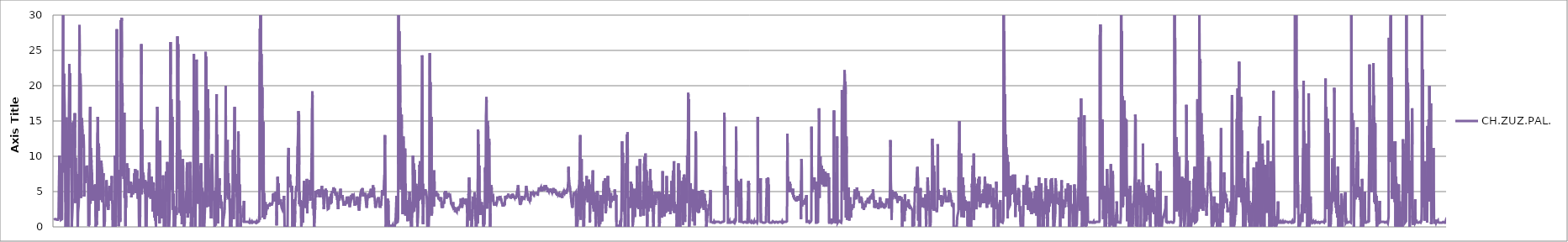
| Category | CH.ZUZ.PAL. |
|---|---|
| 2015-01-01_00:00:09 | 1 |
| 2015-01-01_00:00:10 | 1.1 |
| 2015-01-01_00:00:11 | 1.1 |
| 2015-01-01_00:00:12 | 1.1 |
| 2015-01-01_00:00:13 | 1.1 |
| 2015-01-01_00:00:14 | 1.1 |
| 2015-01-01_00:00:15 | 1.1 |
| 2015-01-01_00:00:16 | 1.1 |
| 2015-01-01_00:00:17 | 1.1 |
| 2015-01-01_00:00:18 | 1.1 |
| 2015-01-01_00:00:19 | 1.1 |
| 2015-01-01_00:00:20 | 1.1 |
| 2015-01-01_00:00:21 | 1.2 |
| 2015-01-01_00:00:22 | 1.1 |
| 2015-01-01_00:00:23 | 1.1 |
| 2015-01-01_00:00:24 | 1 |
| 2015-01-01_00:00:25 | 1.1 |
| 2015-01-01_00:00:26 | 1 |
| 2015-01-01_00:00:27 | 1 |
| 2015-01-01_00:00:28 | 1.1 |
| 2015-01-01_00:00:29 | 1 |
| 2015-01-01_00:00:30 | 1.1 |
| 2015-01-01_00:00:31 | 1.1 |
| 2015-01-01_00:00:32 | 1.3 |
| 2015-01-01_00:00:33 | 1.1 |
| 2015-01-01_00:00:34 | 1.1 |
| 2015-01-01_00:00:35 | 1.1 |
| 2015-01-01_00:00:36 | 10.1 |
| 2015-01-01_00:00:37 | 9.3 |
| 2015-01-01_00:00:38 | 8.3 |
| 2015-01-01_00:00:39 | 8.3 |
| 2015-01-01_00:00:40 | 9 |
| 2015-01-01_00:00:41 | 7.2 |
| 2015-01-01_00:00:42 | 7.3 |
| 2015-01-01_00:00:43 | 8 |
| 2015-01-01_00:00:44 | 1 |
| 2015-01-01_00:00:45 | 1.1 |
| 2015-01-01_00:00:46 | 1.1 |
| 2015-01-01_00:00:47 | 1.1 |
| 2015-01-01_00:00:48 | 1.1 |
| 2015-01-01_00:00:49 | 1.1 |
| 2015-01-01_00:00:50 | 1.1 |
| 2015-01-01_00:00:51 | 1.1 |
| 2015-01-01_00:00:52 | 1.1 |
| 2015-01-01_00:00:53 | 23.5 |
| 2015-01-01_00:00:54 | 31.3 |
| 2015-01-01_00:00:55 | 30.9 |
| 2015-01-01_00:00:56 | 7.7 |
| 2015-01-01_00:00:57 | 14.8 |
| 2015-01-01_00:00:58 | 19.1 |
| 2015-01-01_00:00:59 | 21.7 |
| 2015-01-01_00:01:00 | 19.3 |
| 2015-01-01_00:01:01 | 18.4 |
| 2015-01-01_00:01:02 | 17.3 |
| 2015-01-01_00:01:03 | 12.3 |
| 2015-01-01_00:01:04 | 12.5 |
| 2015-01-01_00:01:05 | 12.7 |
| 2015-01-01_00:01:06 | 3.5 |
| 2015-01-01_00:01:07 | 0 |
| 2015-01-01_00:01:08 | 2 |
| 2015-01-01_00:01:09 | 8.6 |
| 2015-01-01_00:01:10 | 14.3 |
| 2015-01-01_00:01:11 | 15.5 |
| 2015-01-01_00:01:12 | 13.2 |
| 2015-01-01_00:01:13 | 10.7 |
| 2015-01-01_00:01:14 | 11.5 |
| 2015-01-01_00:01:15 | 12.7 |
| 2015-01-01_00:01:16 | 11.1 |
| 2015-01-01_00:01:17 | 13.6 |
| 2015-01-01_00:01:18 | 7.5 |
| 2015-01-01_00:01:19 | 0 |
| 2015-01-01_00:01:20 | 0 |
| 2015-01-01_00:01:21 | 0 |
| 2015-01-01_00:01:22 | 8.1 |
| 2015-01-01_00:01:23 | 17 |
| 2015-01-01_00:01:24 | 19.4 |
| 2015-01-01_00:01:25 | 23.1 |
| 2015-01-01_00:01:26 | 21.1 |
| 2015-01-01_00:01:27 | 14.7 |
| 2015-01-01_00:01:28 | 21.8 |
| 2015-01-01_00:01:29 | 10.5 |
| 2015-01-01_00:01:30 | 8.4 |
| 2015-01-01_00:01:31 | 12.7 |
| 2015-01-01_00:01:32 | 11.6 |
| 2015-01-01_00:01:33 | 11.9 |
| 2015-01-01_00:01:34 | 13.2 |
| 2015-01-01_00:01:35 | 10.3 |
| 2015-01-01_00:01:36 | 2.9 |
| 2015-01-01_00:01:37 | 0 |
| 2015-01-01_00:01:38 | 0 |
| 2015-01-01_00:01:39 | 0 |
| 2015-01-01_00:01:40 | 0 |
| 2015-01-01_00:01:41 | 4 |
| 2015-01-01_00:01:42 | 14.1 |
| 2015-01-01_00:01:43 | 14.8 |
| 2015-01-01_00:01:44 | 13.4 |
| 2015-01-01_00:01:45 | 14.7 |
| 2015-01-01_00:01:46 | 14.7 |
| 2015-01-01_00:01:47 | 14.2 |
| 2015-01-01_00:01:48 | 15 |
| 2015-01-01_00:01:49 | 14.5 |
| 2015-01-01_00:01:50 | 14.8 |
| 2015-01-01_00:01:51 | 14.1 |
| 2015-01-01_00:01:52 | 16.1 |
| 2015-01-01_00:01:53 | 11.2 |
| 2015-01-01_00:01:54 | 3.4 |
| 2015-01-01_00:01:55 | 9 |
| 2015-01-01_00:01:56 | 9.8 |
| 2015-01-01_00:01:57 | 7.3 |
| 2015-01-01_00:01:58 | 6.7 |
| 2015-01-01_00:01:59 | 6.7 |
| 2015-01-01_00:02:00 | 7 |
| 2015-01-01_00:02:01 | 6.4 |
| 2015-01-01_00:02:02 | 6.2 |
| 2015-01-01_00:02:03 | 7.2 |
| 2015-01-01_00:02:04 | 7.5 |
| 2015-01-01_00:02:05 | 4.7 |
| 2015-01-01_00:02:06 | 0 |
| 2015-01-01_00:02:07 | 0.2 |
| 2015-01-01_00:02:08 | 2 |
| 2015-01-01_00:02:09 | 2.4 |
| 2015-01-01_00:02:10 | 2.5 |
| 2015-01-01_00:02:11 | 3 |
| 2015-01-01_00:02:12 | 4 |
| 2015-01-01_00:02:13 | 11.1 |
| 2015-01-01_00:02:14 | 20 |
| 2015-01-01_00:02:15 | 28.6 |
| 2015-01-01_00:02:16 | 24.2 |
| 2015-01-01_00:02:17 | 6.9 |
| 2015-01-01_00:02:18 | 18.6 |
| 2015-01-01_00:02:19 | 21.7 |
| 2015-01-01_00:02:20 | 21.5 |
| 2015-01-01_00:02:21 | 21.4 |
| 2015-01-01_00:02:22 | 19.6 |
| 2015-01-01_00:02:23 | 4.1 |
| 2015-01-01_00:02:24 | 10.7 |
| 2015-01-01_00:02:25 | 14 |
| 2015-01-01_00:02:26 | 14.3 |
| 2015-01-01_00:02:27 | 15.4 |
| 2015-01-01_00:02:28 | 14.8 |
| 2015-01-01_00:02:29 | 14.7 |
| 2015-01-01_00:02:30 | 13.8 |
| 2015-01-01_00:02:31 | 12.6 |
| 2015-01-01_00:02:32 | 11.2 |
| 2015-01-01_00:02:33 | 12.3 |
| 2015-01-01_00:02:34 | 13.1 |
| 2015-01-01_00:02:35 | 12.9 |
| 2015-01-01_00:02:36 | 12.3 |
| 2015-01-01_00:02:37 | 11.3 |
| 2015-01-01_00:02:38 | 4.3 |
| 2015-01-01_00:02:39 | 5.2 |
| 2015-01-01_00:02:40 | 8.5 |
| 2015-01-01_00:02:41 | 7.9 |
| 2015-01-01_00:02:42 | 7.8 |
| 2015-01-01_00:02:43 | 7.6 |
| 2015-01-01_00:02:44 | 6.2 |
| 2015-01-01_00:02:45 | 6.2 |
| 2015-01-01_00:02:46 | 6.8 |
| 2015-01-01_00:02:47 | 7.7 |
| 2015-01-01_00:02:48 | 7.1 |
| 2015-01-01_00:02:49 | 7.5 |
| 2015-01-01_00:02:50 | 8 |
| 2015-01-01_00:02:51 | 8.7 |
| 2015-01-01_00:02:52 | 8.1 |
| 2015-01-01_00:02:53 | 8.2 |
| 2015-01-01_00:02:54 | 8 |
| 2015-01-01_00:02:55 | 8.2 |
| 2015-01-01_00:02:56 | 8 |
| 2015-01-01_00:02:57 | 6.9 |
| 2015-01-01_00:02:58 | 4.6 |
| 2015-01-01_00:02:59 | 0.1 |
| 2015-01-01_00:03:00 | 0 |
| 2015-01-01_00:03:01 | 0 |
| 2015-01-01_00:03:02 | 0 |
| 2015-01-01_00:03:03 | 0 |
| 2015-01-01_00:03:04 | 0.4 |
| 2015-01-01_00:03:05 | 5.4 |
| 2015-01-01_00:03:06 | 11.9 |
| 2015-01-01_00:03:07 | 15.8 |
| 2015-01-01_00:03:08 | 17 |
| 2015-01-01_00:03:09 | 3.3 |
| 2015-01-01_00:03:10 | 6.7 |
| 2015-01-01_00:03:11 | 11.2 |
| 2015-01-01_00:03:12 | 9.6 |
| 2015-01-01_00:03:13 | 9.8 |
| 2015-01-01_00:03:14 | 9.1 |
| 2015-01-01_00:03:15 | 8.4 |
| 2015-01-01_00:03:16 | 8.3 |
| 2015-01-01_00:03:17 | 7.5 |
| 2015-01-01_00:03:18 | 6.1 |
| 2015-01-01_00:03:19 | 4.8 |
| 2015-01-01_00:03:20 | 4.9 |
| 2015-01-01_00:03:21 | 4.2 |
| 2015-01-01_00:03:22 | 3.7 |
| 2015-01-01_00:03:23 | 3.8 |
| 2015-01-01_00:03:24 | 5.4 |
| 2015-01-01_00:03:25 | 5.6 |
| 2015-01-01_00:03:26 | 5.2 |
| 2015-01-01_00:03:27 | 4.2 |
| 2015-01-01_00:03:28 | 3.8 |
| 2015-01-01_00:03:29 | 4.4 |
| 2015-01-01_00:03:30 | 5.9 |
| 2015-01-01_00:03:31 | 5.3 |
| 2015-01-01_00:03:32 | 4.5 |
| 2015-01-01_00:03:33 | 6 |
| 2015-01-01_00:03:34 | 1.5 |
| 2015-01-01_00:03:35 | 0 |
| 2015-01-01_00:03:36 | 0 |
| 2015-01-01_00:03:37 | 0 |
| 2015-01-01_00:03:38 | 0 |
| 2015-01-01_00:03:39 | 0.8 |
| 2015-01-01_00:03:40 | 0.3 |
| 2015-01-01_00:03:41 | 2.7 |
| 2015-01-01_00:03:42 | 10 |
| 2015-01-01_00:03:43 | 13.2 |
| 2015-01-01_00:03:44 | 13.5 |
| 2015-01-01_00:03:45 | 15.6 |
| 2015-01-01_00:03:46 | 14.8 |
| 2015-01-01_00:03:47 | 14.7 |
| 2015-01-01_00:03:48 | 2.3 |
| 2015-01-01_00:03:49 | 6.4 |
| 2015-01-01_00:03:50 | 11.8 |
| 2015-01-01_00:03:51 | 11.2 |
| 2015-01-01_00:03:52 | 9.4 |
| 2015-01-01_00:03:53 | 8.9 |
| 2015-01-01_00:03:54 | 7.2 |
| 2015-01-01_00:03:55 | 5.2 |
| 2015-01-01_00:03:56 | 4 |
| 2015-01-01_00:03:57 | 3.8 |
| 2015-01-01_00:03:58 | 3.8 |
| 2015-01-01_00:03:59 | 4.7 |
| 2015-01-01_00:04:00 | 6.3 |
| 2015-01-01_00:04:01 | 8.2 |
| 2015-01-01_00:04:02 | 9.4 |
| 2015-01-01_00:04:03 | 9.3 |
| 2015-01-01_00:04:04 | 8.7 |
| 2015-01-01_00:04:05 | 8.6 |
| 2015-01-01_00:04:06 | 8.3 |
| 2015-01-01_00:04:07 | 7.8 |
| 2015-01-01_00:04:08 | 3.7 |
| 2015-01-01_00:04:09 | 3.5 |
| 2015-01-01_00:04:10 | 7.2 |
| 2015-01-01_00:04:11 | 7 |
| 2015-01-01_00:04:12 | 7 |
| 2015-01-01_00:04:13 | 7.6 |
| 2015-01-01_00:04:14 | 4.3 |
| 2015-01-01_00:04:15 | 0.7 |
| 2015-01-01_00:04:16 | 0 |
| 2015-01-01_00:04:17 | 0 |
| 2015-01-01_00:04:18 | 0 |
| 2015-01-01_00:04:19 | 0 |
| 2015-01-01_00:04:20 | 0.8 |
| 2015-01-01_00:04:21 | 3 |
| 2015-01-01_00:04:22 | 3.2 |
| 2015-01-01_00:04:23 | 2.9 |
| 2015-01-01_00:04:24 | 2.9 |
| 2015-01-01_00:04:25 | 3.1 |
| 2015-01-01_00:04:26 | 3.5 |
| 2015-01-01_00:04:27 | 5.2 |
| 2015-01-01_00:04:28 | 6.6 |
| 2015-01-01_00:04:29 | 6.4 |
| 2015-01-01_00:04:30 | 5.6 |
| 2015-01-01_00:04:31 | 5 |
| 2015-01-01_00:04:32 | 4.9 |
| 2015-01-01_00:04:33 | 4.5 |
| 2015-01-01_00:04:34 | 3.5 |
| 2015-01-01_00:04:35 | 3.2 |
| 2015-01-01_00:04:36 | 2.6 |
| 2015-01-01_00:04:37 | 2.4 |
| 2015-01-01_00:04:38 | 2.4 |
| 2015-01-01_00:04:39 | 3.2 |
| 2015-01-01_00:04:40 | 4.5 |
| 2015-01-01_00:04:41 | 4.5 |
| 2015-01-01_00:04:42 | 4.5 |
| 2015-01-01_00:04:43 | 5.8 |
| 2015-01-01_00:04:44 | 5.9 |
| 2015-01-01_00:04:45 | 4.6 |
| 2015-01-01_00:04:46 | 4 |
| 2015-01-01_00:04:47 | 4.4 |
| 2015-01-01_00:04:48 | 4 |
| 2015-01-01_00:04:49 | 3.7 |
| 2015-01-01_00:04:50 | 4.2 |
| 2015-01-01_00:04:51 | 5.3 |
| 2015-01-01_00:04:52 | 5.9 |
| 2015-01-01_00:04:53 | 6.2 |
| 2015-01-01_00:04:54 | 7.2 |
| 2015-01-01_00:04:55 | 6.8 |
| 2015-01-01_00:04:56 | 3.8 |
| 2015-01-01_00:04:57 | 3.5 |
| 2015-01-01_00:04:58 | 1.1 |
| 2015-01-01_00:04:59 | 0 |
| 2015-01-01_00:05:00 | 0 |
| 2015-01-01_00:05:01 | 0 |
| 2015-01-01_00:05:02 | 0 |
| 2015-01-01_00:05:03 | 0 |
| 2015-01-01_00:05:04 | 0 |
| 2015-01-01_00:05:05 | 0 |
| 2015-01-01_00:05:06 | 0 |
| 2015-01-01_00:05:07 | 0.7 |
| 2015-01-01_00:05:08 | 0.5 |
| 2015-01-01_00:05:09 | 2 |
| 2015-01-01_00:05:10 | 10.1 |
| 2015-01-01_00:05:11 | 9.6 |
| 2015-01-01_00:05:12 | 3.3 |
| 2015-01-01_00:05:13 | 0 |
| 2015-01-01_00:05:14 | 0 |
| 2015-01-01_00:05:15 | 1.6 |
| 2015-01-01_00:05:16 | 1.7 |
| 2015-01-01_00:05:17 | 6.5 |
| 2015-01-01_00:05:18 | 16.9 |
| 2015-01-01_00:05:19 | 28 |
| 2015-01-01_00:05:20 | 9.2 |
| 2015-01-01_00:05:21 | 12.7 |
| 2015-01-01_00:05:22 | 20.7 |
| 2015-01-01_00:05:23 | 10 |
| 2015-01-01_00:05:24 | 6 |
| 2015-01-01_00:05:25 | 5.6 |
| 2015-01-01_00:05:26 | 5.6 |
| 2015-01-01_00:05:27 | 2.6 |
| 2015-01-01_00:05:28 | 0.1 |
| 2015-01-01_00:05:29 | 0.4 |
| 2015-01-01_00:05:30 | 2 |
| 2015-01-01_00:05:31 | 2.8 |
| 2015-01-01_00:05:32 | 8.1 |
| 2015-01-01_00:05:33 | 5.4 |
| 2015-01-01_00:05:34 | 3.2 |
| 2015-01-01_00:05:35 | 0.7 |
| 2015-01-01_00:05:36 | 0.7 |
| 2015-01-01_00:05:37 | 1.2 |
| 2015-01-01_00:05:38 | 23.7 |
| 2015-01-01_00:05:39 | 29.3 |
| 2015-01-01_00:05:40 | 10.9 |
| 2015-01-01_00:05:41 | 29.1 |
| 2015-01-01_00:05:42 | 28.2 |
| 2015-01-01_00:05:43 | 29.6 |
| 2015-01-01_00:05:44 | 24 |
| 2015-01-01_00:05:45 | 7.2 |
| 2015-01-01_00:05:46 | 20.3 |
| 2015-01-01_00:05:47 | 17.1 |
| 2015-01-01_00:05:48 | 10.3 |
| 2015-01-01_00:05:49 | 8.7 |
| 2015-01-01_00:05:50 | 12.4 |
| 2015-01-01_00:05:51 | 12.5 |
| 2015-01-01_00:05:52 | 8.5 |
| 2015-01-01_00:05:53 | 6.8 |
| 2015-01-01_00:05:54 | 7.3 |
| 2015-01-01_00:05:55 | 10.8 |
| 2015-01-01_00:05:56 | 16.2 |
| 2015-01-01_00:05:57 | 7.2 |
| 2015-01-01_00:05:58 | 4.1 |
| 2015-01-01_00:05:59 | 7.1 |
| 2015-01-01_00:06:00 | 6.3 |
| 2015-01-01_00:06:01 | 1 |
| 2015-01-01_00:06:02 | 0.1 |
| 2015-01-01_00:06:03 | 4.1 |
| 2015-01-01_00:06:04 | 2.7 |
| 2015-01-01_00:06:05 | 4.4 |
| 2015-01-01_00:06:06 | 5.2 |
| 2015-01-01_00:06:07 | 6.5 |
| 2015-01-01_00:06:08 | 6.7 |
| 2015-01-01_00:06:09 | 9 |
| 2015-01-01_00:06:10 | 9.1 |
| 2015-01-01_00:06:11 | 7.5 |
| 2015-01-01_00:06:12 | 7.9 |
| 2015-01-01_00:06:13 | 7.1 |
| 2015-01-01_00:06:14 | 8.3 |
| 2015-01-01_00:06:15 | 7.9 |
| 2015-01-01_00:06:16 | 8.3 |
| 2015-01-01_00:06:17 | 6.3 |
| 2015-01-01_00:06:18 | 4.8 |
| 2015-01-01_00:06:19 | 5.4 |
| 2015-01-01_00:06:20 | 5.2 |
| 2015-01-01_00:06:21 | 5.7 |
| 2015-01-01_00:06:22 | 6.1 |
| 2015-01-01_00:06:23 | 5.9 |
| 2015-01-01_00:06:24 | 6 |
| 2015-01-01_00:06:25 | 5.9 |
| 2015-01-01_00:06:26 | 4.8 |
| 2015-01-01_00:06:27 | 5.1 |
| 2015-01-01_00:06:28 | 6.4 |
| 2015-01-01_00:06:29 | 6 |
| 2015-01-01_00:06:30 | 5.8 |
| 2015-01-01_00:06:31 | 4.2 |
| 2015-01-01_00:06:32 | 4.8 |
| 2015-01-01_00:06:33 | 5.9 |
| 2015-01-01_00:06:34 | 5.5 |
| 2015-01-01_00:06:35 | 5.6 |
| 2015-01-01_00:06:36 | 5.3 |
| 2015-01-01_00:06:37 | 5.3 |
| 2015-01-01_00:06:38 | 4.6 |
| 2015-01-01_00:06:39 | 4.5 |
| 2015-01-01_00:06:40 | 5.3 |
| 2015-01-01_00:06:41 | 5.8 |
| 2015-01-01_00:06:42 | 5.7 |
| 2015-01-01_00:06:43 | 5.7 |
| 2015-01-01_00:06:44 | 6.5 |
| 2015-01-01_00:06:45 | 6 |
| 2015-01-01_00:06:46 | 7.6 |
| 2015-01-01_00:06:47 | 7.2 |
| 2015-01-01_00:06:48 | 6.2 |
| 2015-01-01_00:06:49 | 7.6 |
| 2015-01-01_00:06:50 | 8.2 |
| 2015-01-01_00:06:51 | 7.1 |
| 2015-01-01_00:06:52 | 5.4 |
| 2015-01-01_00:06:53 | 4.8 |
| 2015-01-01_00:06:54 | 5 |
| 2015-01-01_00:06:55 | 5.8 |
| 2015-01-01_00:06:56 | 7.7 |
| 2015-01-01_00:06:57 | 6.5 |
| 2015-01-01_00:06:58 | 6.9 |
| 2015-01-01_00:06:59 | 8 |
| 2015-01-01_00:07:00 | 7.2 |
| 2015-01-01_00:07:01 | 5.8 |
| 2015-01-01_00:07:02 | 5 |
| 2015-01-01_00:07:03 | 4 |
| 2015-01-01_00:07:04 | 6.5 |
| 2015-01-01_00:07:05 | 6.8 |
| 2015-01-01_00:07:06 | 5.7 |
| 2015-01-01_00:07:07 | 5.2 |
| 2015-01-01_00:07:08 | 1.3 |
| 2015-01-01_00:07:09 | 0 |
| 2015-01-01_00:07:10 | 0.9 |
| 2015-01-01_00:07:11 | 0.6 |
| 2015-01-01_00:07:12 | 0 |
| 2015-01-01_00:07:13 | 0 |
| 2015-01-01_00:07:14 | 1.6 |
| 2015-01-01_00:07:15 | 6.3 |
| 2015-01-01_00:07:16 | 5.9 |
| 2015-01-01_00:07:17 | 5.2 |
| 2015-01-01_00:07:18 | 15.2 |
| 2015-01-01_00:07:19 | 22 |
| 2015-01-01_00:07:20 | 25.9 |
| 2015-01-01_00:07:21 | 21.6 |
| 2015-01-01_00:07:22 | 4.6 |
| 2015-01-01_00:07:23 | 13.1 |
| 2015-01-01_00:07:24 | 13.8 |
| 2015-01-01_00:07:25 | 9.4 |
| 2015-01-01_00:07:26 | 8.5 |
| 2015-01-01_00:07:27 | 7.3 |
| 2015-01-01_00:07:28 | 7.7 |
| 2015-01-01_00:07:29 | 6.9 |
| 2015-01-01_00:07:30 | 7.6 |
| 2015-01-01_00:07:31 | 7.7 |
| 2015-01-01_00:07:32 | 6.3 |
| 2015-01-01_00:07:33 | 5.6 |
| 2015-01-01_00:07:34 | 6 |
| 2015-01-01_00:07:35 | 5.5 |
| 2015-01-01_00:07:36 | 5.7 |
| 2015-01-01_00:07:37 | 5.2 |
| 2015-01-01_00:07:38 | 4.7 |
| 2015-01-01_00:07:39 | 6.6 |
| 2015-01-01_00:07:40 | 5 |
| 2015-01-01_00:07:41 | 0.1 |
| 2015-01-01_00:07:42 | 0 |
| 2015-01-01_00:07:43 | 0 |
| 2015-01-01_00:07:44 | 0 |
| 2015-01-01_00:07:45 | 0 |
| 2015-01-01_00:07:46 | 0 |
| 2015-01-01_00:07:47 | 3.7 |
| 2015-01-01_00:07:48 | 5.7 |
| 2015-01-01_00:07:49 | 4.2 |
| 2015-01-01_00:07:50 | 5 |
| 2015-01-01_00:07:51 | 6.4 |
| 2015-01-01_00:07:52 | 5 |
| 2015-01-01_00:07:53 | 4.3 |
| 2015-01-01_00:07:54 | 5.8 |
| 2015-01-01_00:07:55 | 6.3 |
| 2015-01-01_00:07:56 | 5.4 |
| 2015-01-01_00:07:57 | 7.7 |
| 2015-01-01_00:07:58 | 9.1 |
| 2015-01-01_00:07:59 | 9.1 |
| 2015-01-01_00:08:00 | 8.8 |
| 2015-01-01_00:08:01 | 7.5 |
| 2015-01-01_00:08:02 | 6.6 |
| 2015-01-01_00:08:03 | 4.9 |
| 2015-01-01_00:08:04 | 4.3 |
| 2015-01-01_00:08:05 | 4.2 |
| 2015-01-01_00:08:06 | 4 |
| 2015-01-01_00:08:07 | 5.6 |
| 2015-01-01_00:08:08 | 6 |
| 2015-01-01_00:08:09 | 5.4 |
| 2015-01-01_00:08:10 | 6.7 |
| 2015-01-01_00:08:11 | 7.1 |
| 2015-01-01_00:08:12 | 6.4 |
| 2015-01-01_00:08:13 | 6.5 |
| 2015-01-01_00:08:14 | 5.8 |
| 2015-01-01_00:08:15 | 4.9 |
| 2015-01-01_00:08:16 | 2.2 |
| 2015-01-01_00:08:17 | 4.7 |
| 2015-01-01_00:08:18 | 5.1 |
| 2015-01-01_00:08:19 | 4.2 |
| 2015-01-01_00:08:20 | 6.3 |
| 2015-01-01_00:08:21 | 5.8 |
| 2015-01-01_00:08:22 | 4.5 |
| 2015-01-01_00:08:23 | 3.6 |
| 2015-01-01_00:08:24 | 2.1 |
| 2015-01-01_00:08:25 | 1.3 |
| 2015-01-01_00:08:26 | 5.1 |
| 2015-01-01_00:08:27 | 4.6 |
| 2015-01-01_00:08:28 | 0.9 |
| 2015-01-01_00:08:29 | 1.1 |
| 2015-01-01_00:08:30 | 3.5 |
| 2015-01-01_00:08:31 | 0.8 |
| 2015-01-01_00:08:32 | 0 |
| 2015-01-01_00:08:33 | 2.7 |
| 2015-01-01_00:08:34 | 3.7 |
| 2015-01-01_00:08:35 | 7.2 |
| 2015-01-01_00:08:36 | 13 |
| 2015-01-01_00:08:37 | 15 |
| 2015-01-01_00:08:38 | 17 |
| 2015-01-01_00:08:39 | 16.7 |
| 2015-01-01_00:08:40 | 16.4 |
| 2015-01-01_00:08:41 | 11.3 |
| 2015-01-01_00:08:42 | 7 |
| 2015-01-01_00:08:43 | 5.9 |
| 2015-01-01_00:08:44 | 9.2 |
| 2015-01-01_00:08:45 | 1.6 |
| 2015-01-01_00:08:46 | 3.7 |
| 2015-01-01_00:08:47 | 4.4 |
| 2015-01-01_00:08:48 | 5 |
| 2015-01-01_00:08:49 | 0.7 |
| 2015-01-01_00:08:50 | 0.5 |
| 2015-01-01_00:08:51 | 5.2 |
| 2015-01-01_00:08:52 | 12.2 |
| 2015-01-01_00:08:53 | 11.9 |
| 2015-01-01_00:08:54 | 6.9 |
| 2015-01-01_00:08:55 | 5.8 |
| 2015-01-01_00:08:56 | 4.3 |
| 2015-01-01_00:08:57 | 4 |
| 2015-01-01_00:08:58 | 5.3 |
| 2015-01-01_00:08:59 | 3.7 |
| 2015-01-01_00:09:00 | 1.6 |
| 2015-01-01_00:09:01 | 1.2 |
| 2015-01-01_00:09:02 | 3.1 |
| 2015-01-01_00:09:03 | 3.5 |
| 2015-01-01_00:09:04 | 3.3 |
| 2015-01-01_00:09:05 | 1.5 |
| 2015-01-01_00:09:06 | 3.5 |
| 2015-01-01_00:09:07 | 7.3 |
| 2015-01-01_00:09:08 | 6.5 |
| 2015-01-01_00:09:09 | 5.7 |
| 2015-01-01_00:09:10 | 4 |
| 2015-01-01_00:09:11 | 2.5 |
| 2015-01-01_00:09:12 | 0 |
| 2015-01-01_00:09:13 | 1.9 |
| 2015-01-01_00:09:14 | 2.8 |
| 2015-01-01_00:09:15 | 0 |
| 2015-01-01_00:09:16 | 1.2 |
| 2015-01-01_00:09:17 | 3.7 |
| 2015-01-01_00:09:18 | 0.3 |
| 2015-01-01_00:09:19 | 0 |
| 2015-01-01_00:09:20 | 1.6 |
| 2015-01-01_00:09:21 | 7.4 |
| 2015-01-01_00:09:22 | 7.8 |
| 2015-01-01_00:09:23 | 4.8 |
| 2015-01-01_00:09:24 | 5.9 |
| 2015-01-01_00:09:25 | 3.6 |
| 2015-01-01_00:09:26 | 6.7 |
| 2015-01-01_00:09:27 | 8.3 |
| 2015-01-01_00:09:28 | 9.2 |
| 2015-01-01_00:09:29 | 9.2 |
| 2015-01-01_00:09:30 | 7.9 |
| 2015-01-01_00:09:31 | 1.7 |
| 2015-01-01_00:09:32 | 0 |
| 2015-01-01_00:09:33 | 0 |
| 2015-01-01_00:09:34 | 0 |
| 2015-01-01_00:09:35 | 0 |
| 2015-01-01_00:09:36 | 0 |
| 2015-01-01_00:09:37 | 0 |
| 2015-01-01_00:09:38 | 0.1 |
| 2015-01-01_00:09:39 | 1.5 |
| 2015-01-01_00:09:40 | 2 |
| 2015-01-01_00:09:41 | 4.5 |
| 2015-01-01_00:09:42 | 14.7 |
| 2015-01-01_00:09:43 | 21.7 |
| 2015-01-01_00:09:44 | 26.2 |
| 2015-01-01_00:09:45 | 21.6 |
| 2015-01-01_00:09:46 | 5.2 |
| 2015-01-01_00:09:47 | 7.1 |
| 2015-01-01_00:09:48 | 18.1 |
| 2015-01-01_00:09:49 | 13.4 |
| 2015-01-01_00:09:50 | 8.2 |
| 2015-01-01_00:09:51 | 6.5 |
| 2015-01-01_00:09:52 | 9.9 |
| 2015-01-01_00:09:53 | 15.6 |
| 2015-01-01_00:09:54 | 10 |
| 2015-01-01_00:09:55 | 6.5 |
| 2015-01-01_00:09:56 | 2.4 |
| 2015-01-01_00:09:57 | 3.9 |
| 2015-01-01_00:09:58 | 4.7 |
| 2015-01-01_00:09:59 | 3.3 |
| 2015-01-01_00:10:00 | 0 |
| 2015-01-01_00:10:01 | 0 |
| 2015-01-01_00:10:02 | 0 |
| 2015-01-01_00:10:03 | 0.8 |
| 2015-01-01_00:10:04 | 1.4 |
| 2015-01-01_00:10:05 | 0 |
| 2015-01-01_00:10:06 | 0 |
| 2015-01-01_00:10:07 | 0 |
| 2015-01-01_00:10:08 | 1.2 |
| 2015-01-01_00:10:09 | 1.8 |
| 2015-01-01_00:10:10 | 2.3 |
| 2015-01-01_00:10:11 | 2.7 |
| 2015-01-01_00:10:12 | 2.9 |
| 2015-01-01_00:10:13 | 1.7 |
| 2015-01-01_00:10:14 | 2.7 |
| 2015-01-01_00:10:15 | 10.5 |
| 2015-01-01_00:10:16 | 10.1 |
| 2015-01-01_00:10:17 | 14.8 |
| 2015-01-01_00:10:18 | 27 |
| 2015-01-01_00:10:19 | 14 |
| 2015-01-01_00:10:20 | 11.2 |
| 2015-01-01_00:10:21 | 25.9 |
| 2015-01-01_00:10:22 | 24 |
| 2015-01-01_00:10:23 | 5.4 |
| 2015-01-01_00:10:24 | 10.1 |
| 2015-01-01_00:10:25 | 17.9 |
| 2015-01-01_00:10:26 | 10.6 |
| 2015-01-01_00:10:27 | 10.1 |
| 2015-01-01_00:10:28 | 10.5 |
| 2015-01-01_00:10:29 | 2 |
| 2015-01-01_00:10:30 | 8.8 |
| 2015-01-01_00:10:31 | 10.9 |
| 2015-01-01_00:10:32 | 6.4 |
| 2015-01-01_00:10:33 | 6.2 |
| 2015-01-01_00:10:34 | 5.8 |
| 2015-01-01_00:10:35 | 4.4 |
| 2015-01-01_00:10:36 | 1.6 |
| 2015-01-01_00:10:37 | 2.7 |
| 2015-01-01_00:10:38 | 5.2 |
| 2015-01-01_00:10:39 | 3.1 |
| 2015-01-01_00:10:40 | 0.4 |
| 2015-01-01_00:10:41 | 2.4 |
| 2015-01-01_00:10:42 | 2.6 |
| 2015-01-01_00:10:43 | 3.7 |
| 2015-01-01_00:10:44 | 6.4 |
| 2015-01-01_00:10:45 | 9.6 |
| 2015-01-01_00:10:46 | 6.2 |
| 2015-01-01_00:10:47 | 5.9 |
| 2015-01-01_00:10:48 | 4.5 |
| 2015-01-01_00:10:49 | 3.5 |
| 2015-01-01_00:10:50 | 0 |
| 2015-01-01_00:10:51 | 0 |
| 2015-01-01_00:10:52 | 0 |
| 2015-01-01_00:10:53 | 0 |
| 2015-01-01_00:10:54 | 0.6 |
| 2015-01-01_00:10:55 | 3.7 |
| 2015-01-01_00:10:56 | 3.2 |
| 2015-01-01_00:10:57 | 2.2 |
| 2015-01-01_00:10:58 | 2.2 |
| 2015-01-01_00:10:59 | 3 |
| 2015-01-01_00:11:00 | 1.9 |
| 2015-01-01_00:11:01 | 4.6 |
| 2015-01-01_00:11:02 | 5 |
| 2015-01-01_00:11:03 | 5.2 |
| 2015-01-01_00:11:04 | 8.1 |
| 2015-01-01_00:11:05 | 8.4 |
| 2015-01-01_00:11:06 | 8.8 |
| 2015-01-01_00:11:07 | 9.1 |
| 2015-01-01_00:11:08 | 6.9 |
| 2015-01-01_00:11:09 | 1.3 |
| 2015-01-01_00:11:10 | 4 |
| 2015-01-01_00:11:11 | 5.4 |
| 2015-01-01_00:11:12 | 4.8 |
| 2015-01-01_00:11:13 | 3.5 |
| 2015-01-01_00:11:14 | 2.2 |
| 2015-01-01_00:11:15 | 1.9 |
| 2015-01-01_00:11:16 | 2.5 |
| 2015-01-01_00:11:17 | 3.1 |
| 2015-01-01_00:11:18 | 5 |
| 2015-01-01_00:11:19 | 6.9 |
| 2015-01-01_00:11:20 | 9.2 |
| 2015-01-01_00:11:21 | 8.3 |
| 2015-01-01_00:11:22 | 6.7 |
| 2015-01-01_00:11:23 | 5.1 |
| 2015-01-01_00:11:24 | 3 |
| 2015-01-01_00:11:25 | 0 |
| 2015-01-01_00:11:26 | 1 |
| 2015-01-01_00:11:27 | 2.4 |
| 2015-01-01_00:11:28 | 2.3 |
| 2015-01-01_00:11:29 | 2.8 |
| 2015-01-01_00:11:30 | 0.7 |
| 2015-01-01_00:11:31 | 0 |
| 2015-01-01_00:11:32 | 1.5 |
| 2015-01-01_00:11:33 | 1.6 |
| 2015-01-01_00:11:34 | 2.1 |
| 2015-01-01_00:11:35 | 2.2 |
| 2015-01-01_00:11:36 | 1.4 |
| 2015-01-01_00:11:37 | 7.3 |
| 2015-01-01_00:11:38 | 16 |
| 2015-01-01_00:11:39 | 24.5 |
| 2015-01-01_00:11:40 | 19.5 |
| 2015-01-01_00:11:41 | 4.3 |
| 2015-01-01_00:11:42 | 10.3 |
| 2015-01-01_00:11:43 | 12 |
| 2015-01-01_00:11:44 | 9.3 |
| 2015-01-01_00:11:45 | 0.7 |
| 2015-01-01_00:11:46 | 0 |
| 2015-01-01_00:11:47 | 0 |
| 2015-01-01_00:11:48 | 0 |
| 2015-01-01_00:11:49 | 6.3 |
| 2015-01-01_00:11:50 | 15.6 |
| 2015-01-01_00:11:51 | 19.6 |
| 2015-01-01_00:11:52 | 23.7 |
| 2015-01-01_00:11:53 | 23.4 |
| 2015-01-01_00:11:54 | 19.6 |
| 2015-01-01_00:11:55 | 3.3 |
| 2015-01-01_00:11:56 | 9.1 |
| 2015-01-01_00:11:57 | 16.5 |
| 2015-01-01_00:11:58 | 13.6 |
| 2015-01-01_00:11:59 | 8.4 |
| 2015-01-01_00:12:00 | 6.2 |
| 2015-01-01_00:12:01 | 4.8 |
| 2015-01-01_00:12:02 | 3.8 |
| 2015-01-01_00:12:03 | 3.5 |
| 2015-01-01_00:12:04 | 3.3 |
| 2015-01-01_00:12:05 | 4.1 |
| 2015-01-01_00:12:06 | 4.5 |
| 2015-01-01_00:12:07 | 4.1 |
| 2015-01-01_00:12:08 | 4.1 |
| 2015-01-01_00:12:09 | 3.2 |
| 2015-01-01_00:12:10 | 0 |
| 2015-01-01_00:12:11 | 4.6 |
| 2015-01-01_00:12:12 | 7.8 |
| 2015-01-01_00:12:13 | 8.7 |
| 2015-01-01_00:12:14 | 8.2 |
| 2015-01-01_00:12:15 | 9 |
| 2015-01-01_00:12:16 | 6.8 |
| 2015-01-01_00:12:17 | 5.9 |
| 2015-01-01_00:12:18 | 4.7 |
| 2015-01-01_00:12:19 | 4.4 |
| 2015-01-01_00:12:20 | 5.5 |
| 2015-01-01_00:12:21 | 4.4 |
| 2015-01-01_00:12:22 | 0.8 |
| 2015-01-01_00:12:23 | 0 |
| 2015-01-01_00:12:24 | 0 |
| 2015-01-01_00:12:25 | 0.5 |
| 2015-01-01_00:12:26 | 4.9 |
| 2015-01-01_00:12:27 | 4.5 |
| 2015-01-01_00:12:28 | 2.7 |
| 2015-01-01_00:12:29 | 0 |
| 2015-01-01_00:12:30 | 0 |
| 2015-01-01_00:12:31 | 0 |
| 2015-01-01_00:12:32 | 1.6 |
| 2015-01-01_00:12:33 | 2 |
| 2015-01-01_00:12:34 | 2.9 |
| 2015-01-01_00:12:35 | 5.5 |
| 2015-01-01_00:12:36 | 16.1 |
| 2015-01-01_00:12:37 | 24.8 |
| 2015-01-01_00:12:38 | 4.7 |
| 2015-01-01_00:12:39 | 17.9 |
| 2015-01-01_00:12:40 | 24.1 |
| 2015-01-01_00:12:41 | 15.1 |
| 2015-01-01_00:12:42 | 7.8 |
| 2015-01-01_00:12:43 | 2.8 |
| 2015-01-01_00:12:44 | 4.4 |
| 2015-01-01_00:12:45 | 8.7 |
| 2015-01-01_00:12:46 | 9.7 |
| 2015-01-01_00:12:47 | 16.9 |
| 2015-01-01_00:12:48 | 19.5 |
| 2015-01-01_00:12:49 | 5 |
| 2015-01-01_00:12:50 | 16.8 |
| 2015-01-01_00:12:51 | 12.4 |
| 2015-01-01_00:12:52 | 8.7 |
| 2015-01-01_00:12:53 | 8.6 |
| 2015-01-01_00:12:54 | 7.6 |
| 2015-01-01_00:12:55 | 5.6 |
| 2015-01-01_00:12:56 | 2.9 |
| 2015-01-01_00:12:57 | 4.8 |
| 2015-01-01_00:12:58 | 4.8 |
| 2015-01-01_00:12:59 | 4.7 |
| 2015-01-01_00:13:00 | 4 |
| 2015-01-01_00:13:01 | 4.5 |
| 2015-01-01_00:13:02 | 6.3 |
| 2015-01-01_00:13:03 | 2.1 |
| 2015-01-01_00:13:04 | 1.2 |
| 2015-01-01_00:13:05 | 4.1 |
| 2015-01-01_00:13:06 | 8.9 |
| 2015-01-01_00:13:07 | 9.9 |
| 2015-01-01_00:13:08 | 10 |
| 2015-01-01_00:13:09 | 10.3 |
| 2015-01-01_00:13:10 | 8.3 |
| 2015-01-01_00:13:11 | 7.3 |
| 2015-01-01_00:13:12 | 5.4 |
| 2015-01-01_00:13:13 | 4 |
| 2015-01-01_00:13:14 | 4.1 |
| 2015-01-01_00:13:15 | 4.1 |
| 2015-01-01_00:13:16 | 4 |
| 2015-01-01_00:13:17 | 4.2 |
| 2015-01-01_00:13:18 | 4.2 |
| 2015-01-01_00:13:19 | 5.1 |
| 2015-01-01_00:13:20 | 1.1 |
| 2015-01-01_00:13:21 | 0 |
| 2015-01-01_00:13:22 | 0 |
| 2015-01-01_00:13:23 | 0 |
| 2015-01-01_00:13:24 | 0 |
| 2015-01-01_00:13:25 | 0 |
| 2015-01-01_00:13:26 | 0.7 |
| 2015-01-01_00:13:27 | 0.2 |
| 2015-01-01_00:13:28 | 5.6 |
| 2015-01-01_00:13:29 | 9.8 |
| 2015-01-01_00:13:30 | 15.7 |
| 2015-01-01_00:13:31 | 18.8 |
| 2015-01-01_00:13:32 | 3.1 |
| 2015-01-01_00:13:33 | 10.3 |
| 2015-01-01_00:13:34 | 13.1 |
| 2015-01-01_00:13:35 | 9.8 |
| 2015-01-01_00:13:36 | 6.8 |
| 2015-01-01_00:13:37 | 6.2 |
| 2015-01-01_00:13:38 | 0.5 |
| 2015-01-01_00:13:39 | 2.9 |
| 2015-01-01_00:13:40 | 2.7 |
| 2015-01-01_00:13:41 | 2.7 |
| 2015-01-01_00:13:42 | 4.7 |
| 2015-01-01_00:13:43 | 6.5 |
| 2015-01-01_00:13:44 | 5.9 |
| 2015-01-01_00:13:45 | 6.9 |
| 2015-01-01_00:13:46 | 6 |
| 2015-01-01_00:13:47 | 3.5 |
| 2015-01-01_00:13:48 | 3.9 |
| 2015-01-01_00:13:49 | 3.8 |
| 2015-01-01_00:13:50 | 4.1 |
| 2015-01-01_00:13:51 | 4.5 |
| 2015-01-01_00:13:52 | 3.7 |
| 2015-01-01_00:13:53 | 2.9 |
| 2015-01-01_00:13:54 | 2.6 |
| 2015-01-01_00:13:55 | 3.4 |
| 2015-01-01_00:13:56 | 3.6 |
| 2015-01-01_00:13:57 | 3.2 |
| 2015-01-01_00:13:58 | 2.8 |
| 2015-01-01_00:13:59 | 2.3 |
| 2015-01-01_00:14:00 | 0.4 |
| 2015-01-01_00:14:01 | 0 |
| 2015-01-01_00:14:02 | 0 |
| 2015-01-01_00:14:03 | 0 |
| 2015-01-01_00:14:04 | 1 |
| 2015-01-01_00:14:05 | 1.1 |
| 2015-01-01_00:14:06 | 1.2 |
| 2015-01-01_00:14:07 | 1.5 |
| 2015-01-01_00:14:08 | 1.5 |
| 2015-01-01_00:14:09 | 1.9 |
| 2015-01-01_00:14:10 | 2.1 |
| 2015-01-01_00:14:11 | 2.8 |
| 2015-01-01_00:14:12 | 4.1 |
| 2015-01-01_00:14:13 | 3.8 |
| 2015-01-01_00:14:14 | 9.3 |
| 2015-01-01_00:14:15 | 13.5 |
| 2015-01-01_00:14:16 | 20 |
| 2015-01-01_00:14:17 | 4.5 |
| 2015-01-01_00:14:18 | 11.8 |
| 2015-01-01_00:14:19 | 11.6 |
| 2015-01-01_00:14:20 | 10.1 |
| 2015-01-01_00:14:21 | 9.5 |
| 2015-01-01_00:14:22 | 10.2 |
| 2015-01-01_00:14:23 | 10.7 |
| 2015-01-01_00:14:24 | 10.5 |
| 2015-01-01_00:14:25 | 12.3 |
| 2015-01-01_00:14:26 | 5.2 |
| 2015-01-01_00:14:27 | 4.1 |
| 2015-01-01_00:14:28 | 7.6 |
| 2015-01-01_00:14:29 | 5.6 |
| 2015-01-01_00:14:30 | 4.4 |
| 2015-01-01_00:14:31 | 3.9 |
| 2015-01-01_00:14:32 | 5.4 |
| 2015-01-01_00:14:33 | 6.2 |
| 2015-01-01_00:14:34 | 4.8 |
| 2015-01-01_00:14:35 | 3.7 |
| 2015-01-01_00:14:36 | 3.8 |
| 2015-01-01_00:14:37 | 1.8 |
| 2015-01-01_00:14:38 | 0 |
| 2015-01-01_00:14:39 | 0 |
| 2015-01-01_00:14:40 | 1.3 |
| 2015-01-01_00:14:41 | 3.4 |
| 2015-01-01_00:14:42 | 0.6 |
| 2015-01-01_00:14:43 | 0 |
| 2015-01-01_00:14:44 | 1.1 |
| 2015-01-01_00:14:45 | 3.6 |
| 2015-01-01_00:14:46 | 4 |
| 2015-01-01_00:14:47 | 4.1 |
| 2015-01-01_00:14:48 | 2.7 |
| 2015-01-01_00:14:49 | 2.2 |
| 2015-01-01_00:14:50 | 4.5 |
| 2015-01-01_00:14:51 | 7.2 |
| 2015-01-01_00:14:52 | 10.9 |
| 2015-01-01_00:14:53 | 5.1 |
| 2015-01-01_00:14:54 | 4.1 |
| 2015-01-01_00:14:55 | 1.1 |
| 2015-01-01_00:14:56 | 4.7 |
| 2015-01-01_00:14:57 | 6.2 |
| 2015-01-01_00:14:58 | 13.8 |
| 2015-01-01_00:14:59 | 15.6 |
| 2015-01-01_00:15:00 | 17 |
| 2015-01-01_00:15:01 | 12.1 |
| 2015-01-01_00:15:02 | 6.7 |
| 2015-01-01_00:15:03 | 5.2 |
| 2015-01-01_00:15:04 | 5.9 |
| 2015-01-01_00:15:05 | 7.2 |
| 2015-01-01_00:15:06 | 7.5 |
| 2015-01-01_00:15:07 | 4.9 |
| 2015-01-01_00:15:08 | 6.9 |
| 2015-01-01_00:15:09 | 7 |
| 2015-01-01_00:15:10 | 4.4 |
| 2015-01-01_00:15:11 | 4.1 |
| 2015-01-01_00:15:12 | 2.4 |
| 2015-01-01_00:15:13 | 0 |
| 2015-01-01_00:15:14 | 3.5 |
| 2015-01-01_00:15:15 | 4.8 |
| 2015-01-01_00:15:16 | 5.6 |
| 2015-01-01_00:15:17 | 8.3 |
| 2015-01-01_00:15:18 | 13.5 |
| 2015-01-01_00:15:19 | 13 |
| 2015-01-01_00:15:20 | 9.3 |
| 2015-01-01_00:15:21 | 9.7 |
| 2015-01-01_00:15:22 | 9 |
| 2015-01-01_00:15:23 | 2.8 |
| 2015-01-01_00:15:24 | 4.2 |
| 2015-01-01_00:15:25 | 6 |
| 2015-01-01_00:15:26 | 1.9 |
| 2015-01-01_00:15:27 | 1.8 |
| 2015-01-01_00:15:28 | 3 |
| 2015-01-01_00:15:29 | 0 |
| 2015-01-01_00:15:30 | 0 |
| 2015-01-01_00:15:31 | 0.9 |
| 2015-01-01_00:15:32 | 0.6 |
| 2015-01-01_00:15:33 | 1.1 |
| 2015-01-01_00:15:34 | 1.4 |
| 2015-01-01_00:15:35 | 1.3 |
| 2015-01-01_00:15:36 | 1.3 |
| 2015-01-01_00:15:37 | 1.5 |
| 2015-01-01_00:15:38 | 1.3 |
| 2015-01-01_00:15:39 | 1.6 |
| 2015-01-01_00:15:40 | 1.5 |
| 2015-01-01_00:15:41 | 1.9 |
| 2015-01-01_00:15:42 | 2 |
| 2015-01-01_00:15:43 | 2.4 |
| 2015-01-01_00:15:44 | 2.5 |
| 2015-01-01_00:15:45 | 3.2 |
| 2015-01-01_00:15:46 | 3.7 |
| 2015-01-01_00:15:47 | 0.7 |
| 2015-01-01_00:15:48 | 0.7 |
| 2015-01-01_00:15:49 | 0.6 |
| 2015-01-01_00:15:50 | 0.7 |
| 2015-01-01_00:15:51 | 0.7 |
| 2015-01-01_00:15:52 | 0.7 |
| 2015-01-01_00:15:53 | 0.6 |
| 2015-01-01_00:15:54 | 0.6 |
| 2015-01-01_00:15:55 | 0.7 |
| 2015-01-01_00:15:56 | 0.7 |
| 2015-01-01_00:15:57 | 0.7 |
| 2015-01-01_00:15:58 | 0.7 |
| 2015-01-01_00:15:59 | 0.7 |
| 2015-01-01_00:16:00 | 0.7 |
| 2015-01-01_00:16:01 | 0.7 |
| 2015-01-01_00:16:02 | 0.7 |
| 2015-01-01_00:16:03 | 0.8 |
| 2015-01-01_00:16:04 | 0.7 |
| 2015-01-01_00:16:05 | 0.7 |
| 2015-01-01_00:16:06 | 0.7 |
| 2015-01-01_00:16:07 | 0.7 |
| 2015-01-01_00:16:08 | 0.7 |
| 2015-01-01_00:16:09 | 0.7 |
| 2015-01-01_00:16:10 | 0.7 |
| 2015-01-01_00:16:11 | 0.7 |
| 2015-01-01_00:16:12 | 0.6 |
| 2015-01-01_00:16:13 | 0.7 |
| 2015-01-01_00:16:14 | 0.8 |
| 2015-01-01_00:16:15 | 0.7 |
| 2015-01-01_00:16:16 | 0.6 |
| 2015-01-01_00:16:17 | 0.7 |
| 2015-01-01_00:16:18 | 0.6 |
| 2015-01-01_00:16:19 | 0.7 |
| 2015-01-01_00:16:20 | 0.6 |
| 2015-01-01_00:16:21 | 0.6 |
| 2015-01-01_00:16:22 | 0.6 |
| 2015-01-01_00:16:23 | 0.7 |
| 2015-01-01_00:16:24 | 0.7 |
| 2015-01-01_00:16:25 | 0.8 |
| 2015-01-01_00:16:26 | 0.7 |
| 2015-01-01_00:16:27 | 0.7 |
| 2015-01-01_00:16:28 | 0.6 |
| 2015-01-01_00:16:29 | 0.7 |
| 2015-01-01_00:16:30 | 0.7 |
| 2015-01-01_00:16:31 | 0.7 |
| 2015-01-01_00:16:32 | 0.6 |
| 2015-01-01_00:16:33 | 0.7 |
| 2015-01-01_00:16:34 | 0.7 |
| 2015-01-01_00:16:35 | 0.6 |
| 2015-01-01_00:16:36 | 0.7 |
| 2015-01-01_00:16:37 | 0.8 |
| 2015-01-01_00:16:38 | 0.7 |
| 2015-01-01_00:16:39 | 0.7 |
| 2015-01-01_00:16:40 | 0.7 |
| 2015-01-01_00:16:41 | 0.7 |
| 2015-01-01_00:16:42 | 0.7 |
| 2015-01-01_00:16:43 | 0.6 |
| 2015-01-01_00:16:44 | 0.7 |
| 2015-01-01_00:16:45 | 0.6 |
| 2015-01-01_00:16:46 | 0.6 |
| 2015-01-01_00:16:47 | 0.7 |
| 2015-01-01_00:16:48 | 0.8 |
| 2015-01-01_00:16:49 | 0.7 |
| 2015-01-01_00:16:50 | 0.6 |
| 2015-01-01_00:16:51 | 0.7 |
| 2015-01-01_00:16:52 | 0.7 |
| 2015-01-01_00:16:53 | 0.7 |
| 2015-01-01_00:16:54 | 0.7 |
| 2015-01-01_00:16:55 | 0.7 |
| 2015-01-01_00:16:56 | 0.6 |
| 2015-01-01_00:16:57 | 0.7 |
| 2015-01-01_00:16:58 | 0.7 |
| 2015-01-01_00:16:59 | 0.7 |
| 2015-01-01_00:17:00 | 0.8 |
| 2015-01-01_00:17:01 | 0.7 |
| 2015-01-01_00:17:02 | 1.8 |
| 2015-01-01_00:17:03 | 1 |
| 2015-01-01_00:17:04 | 23.4 |
| 2015-01-01_00:17:05 | 28.1 |
| 2015-01-01_00:17:06 | 16.1 |
| 2015-01-01_00:17:07 | 15.9 |
| 2015-01-01_00:17:08 | 33.6 |
| 2015-01-01_00:17:09 | 18.4 |
| 2015-01-01_00:17:10 | 9.7 |
| 2015-01-01_00:17:11 | 22.9 |
| 2015-01-01_00:17:12 | 24.5 |
| 2015-01-01_00:17:13 | 15.5 |
| 2015-01-01_00:17:14 | 5.2 |
| 2015-01-01_00:17:15 | 15.7 |
| 2015-01-01_00:17:16 | 19.8 |
| 2015-01-01_00:17:17 | 16.8 |
| 2015-01-01_00:17:18 | 12.4 |
| 2015-01-01_00:17:19 | 1.3 |
| 2015-01-01_00:17:20 | 8.4 |
| 2015-01-01_00:17:21 | 13.8 |
| 2015-01-01_00:17:22 | 14.9 |
| 2015-01-01_00:17:23 | 8.8 |
| 2015-01-01_00:17:24 | 1.7 |
| 2015-01-01_00:17:25 | 4.8 |
| 2015-01-01_00:17:26 | 3.2 |
| 2015-01-01_00:17:27 | 1.1 |
| 2015-01-01_00:17:28 | 1.2 |
| 2015-01-01_00:17:29 | 1.2 |
| 2015-01-01_00:17:30 | 1.8 |
| 2015-01-01_00:17:31 | 3 |
| 2015-01-01_00:17:32 | 3.5 |
| 2015-01-01_00:17:33 | 2.6 |
| 2015-01-01_00:17:34 | 2.7 |
| 2015-01-01_00:17:35 | 1.7 |
| 2015-01-01_00:17:36 | 2.6 |
| 2015-01-01_00:17:37 | 3.2 |
| 2015-01-01_00:17:38 | 2.7 |
| 2015-01-01_00:17:39 | 2.5 |
| 2015-01-01_00:17:40 | 2.7 |
| 2015-01-01_00:17:41 | 2.5 |
| 2015-01-01_00:17:42 | 2.8 |
| 2015-01-01_00:17:43 | 3.1 |
| 2015-01-01_00:17:44 | 2.9 |
| 2015-01-01_00:17:45 | 2.8 |
| 2015-01-01_00:17:46 | 3 |
| 2015-01-01_00:17:47 | 2.9 |
| 2015-01-01_00:17:48 | 3 |
| 2015-01-01_00:17:49 | 3.1 |
| 2015-01-01_00:17:50 | 2.9 |
| 2015-01-01_00:17:51 | 3 |
| 2015-01-01_00:17:52 | 2.8 |
| 2015-01-01_00:17:53 | 2.9 |
| 2015-01-01_00:17:54 | 3.2 |
| 2015-01-01_00:17:55 | 3 |
| 2015-01-01_00:17:56 | 3 |
| 2015-01-01_00:17:57 | 3.2 |
| 2015-01-01_00:17:58 | 3.1 |
| 2015-01-01_00:17:59 | 3.1 |
| 2015-01-01_00:18:00 | 3.4 |
| 2015-01-01_00:18:01 | 3 |
| 2015-01-01_00:18:02 | 3 |
| 2015-01-01_00:18:03 | 3.4 |
| 2015-01-01_00:18:04 | 3.2 |
| 2015-01-01_00:18:05 | 3.1 |
| 2015-01-01_00:18:06 | 3.4 |
| 2015-01-01_00:18:07 | 3.4 |
| 2015-01-01_00:18:08 | 3.7 |
| 2015-01-01_00:18:09 | 4.7 |
| 2015-01-01_00:18:10 | 4.5 |
| 2015-01-01_00:18:11 | 4.2 |
| 2015-01-01_00:18:12 | 3.9 |
| 2015-01-01_00:18:13 | 4.1 |
| 2015-01-01_00:18:14 | 4.8 |
| 2015-01-01_00:18:15 | 4.1 |
| 2015-01-01_00:18:16 | 3.6 |
| 2015-01-01_00:18:17 | 3.7 |
| 2015-01-01_00:18:18 | 3.9 |
| 2015-01-01_00:18:19 | 4.1 |
| 2015-01-01_00:18:20 | 4.5 |
| 2015-01-01_00:18:21 | 4.3 |
| 2015-01-01_00:18:22 | 4.6 |
| 2015-01-01_00:18:23 | 5 |
| 2015-01-01_00:18:24 | 4.8 |
| 2015-01-01_00:18:25 | 4.6 |
| 2015-01-01_00:18:26 | 4.5 |
| 2015-01-01_00:18:27 | 0.2 |
| 2015-01-01_00:18:28 | 2.2 |
| 2015-01-01_00:18:29 | 4.5 |
| 2015-01-01_00:18:30 | 4.7 |
| 2015-01-01_00:18:31 | 6.7 |
| 2015-01-01_00:18:32 | 7.1 |
| 2015-01-01_00:18:33 | 6.4 |
| 2015-01-01_00:18:34 | 3.1 |
| 2015-01-01_00:18:35 | 4.1 |
| 2015-01-01_00:18:36 | 6.2 |
| 2015-01-01_00:18:37 | 5.2 |
| 2015-01-01_00:18:38 | 4.6 |
| 2015-01-01_00:18:39 | 4.1 |
| 2015-01-01_00:18:40 | 3.8 |
| 2015-01-01_00:18:41 | 3.8 |
| 2015-01-01_00:18:42 | 3.2 |
| 2015-01-01_00:18:43 | 3.1 |
| 2015-01-01_00:18:44 | 3.5 |
| 2015-01-01_00:18:45 | 3.4 |
| 2015-01-01_00:18:46 | 3.4 |
| 2015-01-01_00:18:47 | 3.9 |
| 2015-01-01_00:18:48 | 3.6 |
| 2015-01-01_00:18:49 | 3.6 |
| 2015-01-01_00:18:50 | 3 |
| 2015-01-01_00:18:51 | 3 |
| 2015-01-01_00:18:52 | 2.7 |
| 2015-01-01_00:18:53 | 2.6 |
| 2015-01-01_00:18:54 | 2.7 |
| 2015-01-01_00:18:55 | 2.8 |
| 2015-01-01_00:18:56 | 2.4 |
| 2015-01-01_00:18:57 | 2.5 |
| 2015-01-01_00:18:58 | 2.3 |
| 2015-01-01_00:18:59 | 2.7 |
| 2015-01-01_00:19:00 | 3 |
| 2015-01-01_00:19:01 | 3.2 |
| 2015-01-01_00:19:02 | 3.7 |
| 2015-01-01_00:19:03 | 4.4 |
| 2015-01-01_00:19:04 | 3.8 |
| 2015-01-01_00:19:05 | 2.4 |
| 2015-01-01_00:19:06 | 0 |
| 2015-01-01_00:19:07 | 0 |
| 2015-01-01_00:19:08 | 0 |
| 2015-01-01_00:19:09 | 0 |
| 2015-01-01_00:19:10 | 0 |
| 2015-01-01_00:19:11 | 0 |
| 2015-01-01_00:19:12 | 0 |
| 2015-01-01_00:19:13 | 0 |
| 2015-01-01_00:19:14 | 0 |
| 2015-01-01_00:19:15 | 0 |
| 2015-01-01_00:19:16 | 0 |
| 2015-01-01_00:19:17 | 0 |
| 2015-01-01_00:19:18 | 0 |
| 2015-01-01_00:19:19 | 0 |
| 2015-01-01_00:19:20 | 0 |
| 2015-01-01_00:19:21 | 0 |
| 2015-01-01_00:19:22 | 4 |
| 2015-01-01_00:19:23 | 9.8 |
| 2015-01-01_00:19:24 | 9.8 |
| 2015-01-01_00:19:25 | 10.3 |
| 2015-01-01_00:19:26 | 11.2 |
| 2015-01-01_00:19:27 | 7 |
| 2015-01-01_00:19:28 | 7.2 |
| 2015-01-01_00:19:29 | 6.7 |
| 2015-01-01_00:19:30 | 6.9 |
| 2015-01-01_00:19:31 | 5.6 |
| 2015-01-01_00:19:32 | 7.4 |
| 2015-01-01_00:19:33 | 7.1 |
| 2015-01-01_00:19:34 | 6.5 |
| 2015-01-01_00:19:35 | 6.4 |
| 2015-01-01_00:19:36 | 6.3 |
| 2015-01-01_00:19:37 | 5.8 |
| 2015-01-01_00:19:38 | 5.5 |
| 2015-01-01_00:19:39 | 5.2 |
| 2015-01-01_00:19:40 | 4.9 |
| 2015-01-01_00:19:41 | 4.8 |
| 2015-01-01_00:19:42 | 5.8 |
| 2015-01-01_00:19:43 | 5.2 |
| 2015-01-01_00:19:44 | 1.6 |
| 2015-01-01_00:19:45 | 0 |
| 2015-01-01_00:19:46 | 0 |
| 2015-01-01_00:19:47 | 1.3 |
| 2015-01-01_00:19:48 | 3.3 |
| 2015-01-01_00:19:49 | 3.9 |
| 2015-01-01_00:19:50 | 3.8 |
| 2015-01-01_00:19:51 | 3.7 |
| 2015-01-01_00:19:52 | 3 |
| 2015-01-01_00:19:53 | 2.9 |
| 2015-01-01_00:19:54 | 3.3 |
| 2015-01-01_00:19:55 | 0.3 |
| 2015-01-01_00:19:56 | 0 |
| 2015-01-01_00:19:57 | 0 |
| 2015-01-01_00:19:58 | 2.3 |
| 2015-01-01_00:19:59 | 3.4 |
| 2015-01-01_00:20:00 | 3.5 |
| 2015-01-01_00:20:01 | 4.3 |
| 2015-01-01_00:20:02 | 5.3 |
| 2015-01-01_00:20:03 | 5.2 |
| 2015-01-01_00:20:04 | 5.8 |
| 2015-01-01_00:20:05 | 5.2 |
| 2015-01-01_00:20:06 | 5 |
| 2015-01-01_00:20:07 | 5.2 |
| 2015-01-01_00:20:08 | 7.3 |
| 2015-01-01_00:20:09 | 8.9 |
| 2015-01-01_00:20:10 | 8.7 |
| 2015-01-01_00:20:11 | 11.4 |
| 2015-01-01_00:20:12 | 12.4 |
| 2015-01-01_00:20:13 | 13.7 |
| 2015-01-01_00:20:14 | 15.9 |
| 2015-01-01_00:20:15 | 16.4 |
| 2015-01-01_00:20:16 | 14.4 |
| 2015-01-01_00:20:17 | 15.9 |
| 2015-01-01_00:20:18 | 8.8 |
| 2015-01-01_00:20:19 | 3.2 |
| 2015-01-01_00:20:20 | 4.9 |
| 2015-01-01_00:20:21 | 4 |
| 2015-01-01_00:20:22 | 3.3 |
| 2015-01-01_00:20:23 | 3.1 |
| 2015-01-01_00:20:24 | 2.9 |
| 2015-01-01_00:20:25 | 3.8 |
| 2015-01-01_00:20:26 | 3.4 |
| 2015-01-01_00:20:27 | 2.7 |
| 2015-01-01_00:20:28 | 0.3 |
| 2015-01-01_00:20:29 | 0 |
| 2015-01-01_00:20:30 | 0 |
| 2015-01-01_00:20:31 | 0 |
| 2015-01-01_00:20:32 | 0 |
| 2015-01-01_00:20:33 | 0.1 |
| 2015-01-01_00:20:34 | 2.2 |
| 2015-01-01_00:20:35 | 3.7 |
| 2015-01-01_00:20:36 | 3.2 |
| 2015-01-01_00:20:37 | 0.6 |
| 2015-01-01_00:20:38 | 2.8 |
| 2015-01-01_00:20:39 | 3.9 |
| 2015-01-01_00:20:40 | 4.5 |
| 2015-01-01_00:20:41 | 5.5 |
| 2015-01-01_00:20:42 | 6.5 |
| 2015-01-01_00:20:43 | 6 |
| 2015-01-01_00:20:44 | 4.2 |
| 2015-01-01_00:20:45 | 3.6 |
| 2015-01-01_00:20:46 | 2.7 |
| 2015-01-01_00:20:47 | 3.4 |
| 2015-01-01_00:20:48 | 4.8 |
| 2015-01-01_00:20:49 | 4.6 |
| 2015-01-01_00:20:50 | 5.9 |
| 2015-01-01_00:20:51 | 5.3 |
| 2015-01-01_00:20:52 | 3.6 |
| 2015-01-01_00:20:53 | 2.7 |
| 2015-01-01_00:20:54 | 3.4 |
| 2015-01-01_00:20:55 | 5.2 |
| 2015-01-01_00:20:56 | 6.8 |
| 2015-01-01_00:20:57 | 4.1 |
| 2015-01-01_00:20:58 | 1.9 |
| 2015-01-01_00:20:59 | 3.9 |
| 2015-01-01_00:21:00 | 5.6 |
| 2015-01-01_00:21:01 | 4.5 |
| 2015-01-01_00:21:02 | 4.6 |
| 2015-01-01_00:21:03 | 5.8 |
| 2015-01-01_00:21:04 | 6 |
| 2015-01-01_00:21:05 | 6.1 |
| 2015-01-01_00:21:06 | 5.8 |
| 2015-01-01_00:21:07 | 5.8 |
| 2015-01-01_00:21:08 | 5.9 |
| 2015-01-01_00:21:09 | 5.6 |
| 2015-01-01_00:21:10 | 6.6 |
| 2015-01-01_00:21:11 | 6.2 |
| 2015-01-01_00:21:12 | 4.1 |
| 2015-01-01_00:21:13 | 3.7 |
| 2015-01-01_00:21:14 | 4.3 |
| 2015-01-01_00:21:15 | 4.7 |
| 2015-01-01_00:21:16 | 5.3 |
| 2015-01-01_00:21:17 | 6.2 |
| 2015-01-01_00:21:18 | 6.7 |
| 2015-01-01_00:21:19 | 9.4 |
| 2015-01-01_00:21:20 | 10.4 |
| 2015-01-01_00:21:21 | 10.2 |
| 2015-01-01_00:21:22 | 16.8 |
| 2015-01-01_00:21:23 | 19.2 |
| 2015-01-01_00:21:24 | 18.3 |
| 2015-01-01_00:21:25 | 12.3 |
| 2015-01-01_00:21:26 | 2.6 |
| 2015-01-01_00:21:27 | 4 |
| 2015-01-01_00:21:28 | 3.2 |
| 2015-01-01_00:21:29 | 2.6 |
| 2015-01-01_00:21:30 | 3.2 |
| 2015-01-01_00:21:31 | 1.3 |
| 2015-01-01_00:21:32 | 0 |
| 2015-01-01_00:21:33 | 0 |
| 2015-01-01_00:21:34 | 0 |
| 2015-01-01_00:21:35 | 0 |
| 2015-01-01_00:21:36 | 0 |
| 2015-01-01_00:21:37 | 3 |
| 2015-01-01_00:21:38 | 4.9 |
| 2015-01-01_00:21:39 | 5.1 |
| 2015-01-01_00:21:40 | 4.9 |
| 2015-01-01_00:21:41 | 4.2 |
| 2015-01-01_00:21:42 | 4.4 |
| 2015-01-01_00:21:43 | 5.1 |
| 2015-01-01_00:21:44 | 4.7 |
| 2015-01-01_00:21:45 | 4.9 |
| 2015-01-01_00:21:46 | 5 |
| 2015-01-01_00:21:47 | 5.2 |
| 2015-01-01_00:21:48 | 4.9 |
| 2015-01-01_00:21:49 | 4.7 |
| 2015-01-01_00:21:50 | 5.1 |
| 2015-01-01_00:21:51 | 5.1 |
| 2015-01-01_00:21:52 | 5 |
| 2015-01-01_00:21:53 | 4.8 |
| 2015-01-01_00:21:54 | 5.3 |
| 2015-01-01_00:21:55 | 5 |
| 2015-01-01_00:21:56 | 4.7 |
| 2015-01-01_00:21:57 | 4.7 |
| 2015-01-01_00:21:58 | 4.2 |
| 2015-01-01_00:21:59 | 4.3 |
| 2015-01-01_00:22:00 | 4.3 |
| 2015-01-01_00:22:01 | 4.8 |
| 2015-01-01_00:22:02 | 4.2 |
| 2015-01-01_00:22:03 | 4.1 |
| 2015-01-01_00:22:04 | 5 |
| 2015-01-01_00:22:05 | 4.9 |
| 2015-01-01_00:22:06 | 5 |
| 2015-01-01_00:22:07 | 5.1 |
| 2015-01-01_00:22:08 | 5.4 |
| 2015-01-01_00:22:09 | 5.4 |
| 2015-01-01_00:22:10 | 5.8 |
| 2015-01-01_00:22:11 | 5.6 |
| 2015-01-01_00:22:12 | 5.7 |
| 2015-01-01_00:22:13 | 5.2 |
| 2015-01-01_00:22:14 | 5 |
| 2015-01-01_00:22:15 | 5.2 |
| 2015-01-01_00:22:16 | 4.7 |
| 2015-01-01_00:22:17 | 4.2 |
| 2015-01-01_00:22:18 | 3.6 |
| 2015-01-01_00:22:19 | 2.7 |
| 2015-01-01_00:22:20 | 2.5 |
| 2015-01-01_00:22:21 | 3.1 |
| 2015-01-01_00:22:22 | 3.3 |
| 2015-01-01_00:22:23 | 3.9 |
| 2015-01-01_00:22:24 | 4.5 |
| 2015-01-01_00:22:25 | 5.2 |
| 2015-01-01_00:22:26 | 5.1 |
| 2015-01-01_00:22:27 | 5.1 |
| 2015-01-01_00:22:28 | 5 |
| 2015-01-01_00:22:29 | 5.4 |
| 2015-01-01_00:22:30 | 5 |
| 2015-01-01_00:22:31 | 5 |
| 2015-01-01_00:22:32 | 5.2 |
| 2015-01-01_00:22:33 | 4.8 |
| 2015-01-01_00:22:34 | 4.4 |
| 2015-01-01_00:22:35 | 4.5 |
| 2015-01-01_00:22:36 | 4 |
| 2015-01-01_00:22:37 | 3.5 |
| 2015-01-01_00:22:38 | 2.8 |
| 2015-01-01_00:22:39 | 2.5 |
| 2015-01-01_00:22:40 | 2.5 |
| 2015-01-01_00:22:41 | 2.5 |
| 2015-01-01_00:22:42 | 2.5 |
| 2015-01-01_00:22:43 | 2.5 |
| 2015-01-01_00:22:44 | 2.6 |
| 2015-01-01_00:22:45 | 3 |
| 2015-01-01_00:22:46 | 3.4 |
| 2015-01-01_00:22:47 | 3.6 |
| 2015-01-01_00:22:48 | 3.9 |
| 2015-01-01_00:22:49 | 4.3 |
| 2015-01-01_00:22:50 | 4.1 |
| 2015-01-01_00:22:51 | 4 |
| 2015-01-01_00:22:52 | 3.2 |
| 2015-01-01_00:22:53 | 3.3 |
| 2015-01-01_00:22:54 | 3.7 |
| 2015-01-01_00:22:55 | 4.4 |
| 2015-01-01_00:22:56 | 4.7 |
| 2015-01-01_00:22:57 | 3.4 |
| 2015-01-01_00:22:58 | 3.5 |
| 2015-01-01_00:22:59 | 4.1 |
| 2015-01-01_00:23:00 | 5.1 |
| 2015-01-01_00:23:01 | 5.2 |
| 2015-01-01_00:23:02 | 5 |
| 2015-01-01_00:23:03 | 5.2 |
| 2015-01-01_00:23:04 | 4.8 |
| 2015-01-01_00:23:05 | 5 |
| 2015-01-01_00:23:06 | 5 |
| 2015-01-01_00:23:07 | 5.6 |
| 2015-01-01_00:23:08 | 5.5 |
| 2015-01-01_00:23:09 | 5.5 |
| 2015-01-01_00:23:10 | 5.5 |
| 2015-01-01_00:23:11 | 5.6 |
| 2015-01-01_00:23:12 | 5.1 |
| 2015-01-01_00:23:13 | 5.1 |
| 2015-01-01_00:23:14 | 5.4 |
| 2015-01-01_00:23:15 | 4.8 |
| 2015-01-01_00:23:16 | 4.8 |
| 2015-01-01_00:23:17 | 4.7 |
| 2015-01-01_00:23:18 | 4.4 |
| 2015-01-01_00:23:19 | 4.5 |
| 2015-01-01_00:23:20 | 4.7 |
| 2015-01-01_00:23:21 | 4.8 |
| 2015-01-01_00:23:22 | 4.5 |
| 2015-01-01_00:23:23 | 4.6 |
| 2015-01-01_00:23:24 | 4.9 |
| 2015-01-01_00:23:25 | 4 |
| 2015-01-01_00:23:26 | 3.8 |
| 2015-01-01_00:23:27 | 4 |
| 2015-01-01_00:23:28 | 4 |
| 2015-01-01_00:23:29 | 3.1 |
| 2015-01-01_00:23:30 | 2.5 |
| 2015-01-01_00:23:31 | 3.1 |
| 2015-01-01_00:23:32 | 3.6 |
| 2015-01-01_00:23:33 | 4.1 |
| 2015-01-01_00:23:34 | 4.5 |
| 2015-01-01_00:23:35 | 4.6 |
| 2015-01-01_00:23:36 | 3.7 |
| 2015-01-01_00:23:37 | 4.1 |
| 2015-01-01_00:23:38 | 4.8 |
| 2015-01-01_00:23:39 | 4.8 |
| 2015-01-01_00:23:40 | 4.9 |
| 2015-01-01_00:23:41 | 5 |
| 2015-01-01_00:23:42 | 5.4 |
| 2015-01-01_00:23:43 | 4.7 |
| 2015-01-01_00:23:44 | 4.7 |
| 2015-01-01_00:23:45 | 4.7 |
| 2015-01-01_00:23:46 | 4.1 |
| 2015-01-01_00:23:47 | 4.3 |
| 2015-01-01_00:23:48 | 4.3 |
| 2015-01-01_00:23:49 | 4.2 |
| 2015-01-01_00:23:50 | 4.1 |
| 2015-01-01_00:23:51 | 4 |
| 2015-01-01_00:23:52 | 4.5 |
| 2015-01-01_00:23:53 | 4.1 |
| 2015-01-01_00:23:54 | 4 |
| 2015-01-01_00:23:55 | 4 |
| 2015-01-01_00:23:56 | 3.4 |
| 2015-01-01_00:23:57 | 3.2 |
| 2015-01-01_00:23:58 | 3 |
| 2015-01-01_00:23:59 | 3.3 |
| 2015-01-01_00:24:00 | 3 |
| 2015-01-01_00:24:01 | 3.1 |
| 2015-01-01_00:24:02 | 3.3 |
| 2015-01-01_00:24:03 | 3 |
| 2015-01-01_00:24:04 | 3.2 |
| 2015-01-01_00:24:05 | 3.3 |
| 2015-01-01_00:24:06 | 3.6 |
| 2015-01-01_00:24:07 | 3.2 |
| 2015-01-01_00:24:08 | 3.1 |
| 2015-01-01_00:24:09 | 3.3 |
| 2015-01-01_00:24:10 | 3.3 |
| 2015-01-01_00:24:11 | 3.7 |
| 2015-01-01_00:24:12 | 4 |
| 2015-01-01_00:24:13 | 4.3 |
| 2015-01-01_00:24:14 | 3.9 |
| 2015-01-01_00:24:15 | 3.8 |
| 2015-01-01_00:24:16 | 3.9 |
| 2015-01-01_00:24:17 | 3.7 |
| 2015-01-01_00:24:18 | 3.9 |
| 2015-01-01_00:24:19 | 4.3 |
| 2015-01-01_00:24:20 | 4.4 |
| 2015-01-01_00:24:21 | 4.1 |
| 2015-01-01_00:24:22 | 4 |
| 2015-01-01_00:24:23 | 4.1 |
| 2015-01-01_00:24:24 | 3.5 |
| 2015-01-01_00:24:25 | 3.2 |
| 2015-01-01_00:24:26 | 3 |
| 2015-01-01_00:24:27 | 2.8 |
| 2015-01-01_00:24:28 | 2.7 |
| 2015-01-01_00:24:29 | 2.8 |
| 2015-01-01_00:24:30 | 3.3 |
| 2015-01-01_00:24:31 | 3.3 |
| 2015-01-01_00:24:32 | 3.3 |
| 2015-01-01_00:24:33 | 3.6 |
| 2015-01-01_00:24:34 | 4 |
| 2015-01-01_00:24:35 | 4.5 |
| 2015-01-01_00:24:36 | 4.6 |
| 2015-01-01_00:24:37 | 4.6 |
| 2015-01-01_00:24:38 | 4 |
| 2015-01-01_00:24:39 | 4.1 |
| 2015-01-01_00:24:40 | 4.3 |
| 2015-01-01_00:24:41 | 4.7 |
| 2015-01-01_00:24:42 | 4.3 |
| 2015-01-01_00:24:43 | 3.9 |
| 2015-01-01_00:24:44 | 4.4 |
| 2015-01-01_00:24:45 | 4.1 |
| 2015-01-01_00:24:46 | 4.1 |
| 2015-01-01_00:24:47 | 4 |
| 2015-01-01_00:24:48 | 4.3 |
| 2015-01-01_00:24:49 | 4.1 |
| 2015-01-01_00:24:50 | 3.5 |
| 2015-01-01_00:24:51 | 3.3 |
| 2015-01-01_00:24:52 | 3 |
| 2015-01-01_00:24:53 | 3.2 |
| 2015-01-01_00:24:54 | 3.5 |
| 2015-01-01_00:24:55 | 3.3 |
| 2015-01-01_00:24:56 | 3.1 |
| 2015-01-01_00:24:57 | 3.2 |
| 2015-01-01_00:24:58 | 3.6 |
| 2015-01-01_00:24:59 | 3.2 |
| 2015-01-01_00:25:00 | 3.4 |
| 2015-01-01_00:25:01 | 3.7 |
| 2015-01-01_00:25:02 | 3.7 |
| 2015-01-01_00:25:03 | 3.9 |
| 2015-01-01_00:25:04 | 4.3 |
| 2015-01-01_00:25:05 | 4.2 |
| 2015-01-01_00:25:06 | 3.9 |
| 2015-01-01_00:25:07 | 4 |
| 2015-01-01_00:25:08 | 4.1 |
| 2015-01-01_00:25:09 | 3.8 |
| 2015-01-01_00:25:10 | 3 |
| 2015-01-01_00:25:11 | 2.9 |
| 2015-01-01_00:25:12 | 2.9 |
| 2015-01-01_00:25:13 | 2.3 |
| 2015-01-01_00:25:14 | 2.3 |
| 2015-01-01_00:25:15 | 2.6 |
| 2015-01-01_00:25:16 | 3 |
| 2015-01-01_00:25:17 | 3.3 |
| 2015-01-01_00:25:18 | 3.4 |
| 2015-01-01_00:25:19 | 4.3 |
| 2015-01-01_00:25:20 | 4.7 |
| 2015-01-01_00:25:21 | 4.6 |
| 2015-01-01_00:25:22 | 4.8 |
| 2015-01-01_00:25:23 | 5 |
| 2015-01-01_00:25:24 | 5 |
| 2015-01-01_00:25:25 | 5 |
| 2015-01-01_00:25:26 | 5.3 |
| 2015-01-01_00:25:27 | 4.8 |
| 2015-01-01_00:25:28 | 5 |
| 2015-01-01_00:25:29 | 5.1 |
| 2015-01-01_00:25:30 | 5.5 |
| 2015-01-01_00:25:31 | 5.1 |
| 2015-01-01_00:25:32 | 4.6 |
| 2015-01-01_00:25:33 | 4.7 |
| 2015-01-01_00:25:34 | 4.3 |
| 2015-01-01_00:25:35 | 4.3 |
| 2015-01-01_00:25:36 | 4.8 |
| 2015-01-01_00:25:37 | 4.5 |
| 2015-01-01_00:25:38 | 4.6 |
| 2015-01-01_00:25:39 | 4.7 |
| 2015-01-01_00:25:40 | 4.8 |
| 2015-01-01_00:25:41 | 4.4 |
| 2015-01-01_00:25:42 | 4.5 |
| 2015-01-01_00:25:43 | 4.8 |
| 2015-01-01_00:25:44 | 4.6 |
| 2015-01-01_00:25:45 | 4.6 |
| 2015-01-01_00:25:46 | 3.9 |
| 2015-01-01_00:25:47 | 3.8 |
| 2015-01-01_00:25:48 | 3.4 |
| 2015-01-01_00:25:49 | 3 |
| 2015-01-01_00:25:50 | 2.9 |
| 2015-01-01_00:25:51 | 2.7 |
| 2015-01-01_00:25:52 | 2.8 |
| 2015-01-01_00:25:53 | 3.1 |
| 2015-01-01_00:25:54 | 3.7 |
| 2015-01-01_00:25:55 | 3.7 |
| 2015-01-01_00:25:56 | 4.1 |
| 2015-01-01_00:25:57 | 4.5 |
| 2015-01-01_00:25:58 | 4.3 |
| 2015-01-01_00:25:59 | 4.4 |
| 2015-01-01_00:26:00 | 4.7 |
| 2015-01-01_00:26:01 | 4.8 |
| 2015-01-01_00:26:02 | 4.1 |
| 2015-01-01_00:26:03 | 4.3 |
| 2015-01-01_00:26:04 | 4.5 |
| 2015-01-01_00:26:05 | 4.3 |
| 2015-01-01_00:26:06 | 4.6 |
| 2015-01-01_00:26:07 | 4.7 |
| 2015-01-01_00:26:08 | 5 |
| 2015-01-01_00:26:09 | 4.7 |
| 2015-01-01_00:26:10 | 4.8 |
| 2015-01-01_00:26:11 | 5.2 |
| 2015-01-01_00:26:12 | 5.4 |
| 2015-01-01_00:26:13 | 4.8 |
| 2015-01-01_00:26:14 | 4.2 |
| 2015-01-01_00:26:15 | 4.4 |
| 2015-01-01_00:26:16 | 4.2 |
| 2015-01-01_00:26:17 | 4.4 |
| 2015-01-01_00:26:18 | 4.8 |
| 2015-01-01_00:26:19 | 4.6 |
| 2015-01-01_00:26:20 | 4.5 |
| 2015-01-01_00:26:21 | 5 |
| 2015-01-01_00:26:22 | 5.9 |
| 2015-01-01_00:26:23 | 5.4 |
| 2015-01-01_00:26:24 | 5.1 |
| 2015-01-01_00:26:25 | 5.4 |
| 2015-01-01_00:26:26 | 5.6 |
| 2015-01-01_00:26:27 | 5.2 |
| 2015-01-01_00:26:28 | 4.5 |
| 2015-01-01_00:26:29 | 4.6 |
| 2015-01-01_00:26:30 | 4.2 |
| 2015-01-01_00:26:31 | 3.8 |
| 2015-01-01_00:26:32 | 3.4 |
| 2015-01-01_00:26:33 | 2.9 |
| 2015-01-01_00:26:34 | 2.7 |
| 2015-01-01_00:26:35 | 2.8 |
| 2015-01-01_00:26:36 | 2.7 |
| 2015-01-01_00:26:37 | 2.8 |
| 2015-01-01_00:26:38 | 2.8 |
| 2015-01-01_00:26:39 | 3.2 |
| 2015-01-01_00:26:40 | 3.1 |
| 2015-01-01_00:26:41 | 3.3 |
| 2015-01-01_00:26:42 | 3.6 |
| 2015-01-01_00:26:43 | 3.5 |
| 2015-01-01_00:26:44 | 3.8 |
| 2015-01-01_00:26:45 | 4 |
| 2015-01-01_00:26:46 | 4 |
| 2015-01-01_00:26:47 | 3.7 |
| 2015-01-01_00:26:48 | 3.6 |
| 2015-01-01_00:26:49 | 4.2 |
| 2015-01-01_00:26:50 | 3.8 |
| 2015-01-01_00:26:51 | 3.7 |
| 2015-01-01_00:26:52 | 3.7 |
| 2015-01-01_00:26:53 | 3.4 |
| 2015-01-01_00:26:54 | 2.8 |
| 2015-01-01_00:26:55 | 3.1 |
| 2015-01-01_00:26:56 | 3.6 |
| 2015-01-01_00:26:57 | 3.2 |
| 2015-01-01_00:26:58 | 2.7 |
| 2015-01-01_00:26:59 | 3 |
| 2015-01-01_00:27:00 | 3.3 |
| 2015-01-01_00:27:01 | 3 |
| 2015-01-01_00:27:02 | 2.9 |
| 2015-01-01_00:27:03 | 3.5 |
| 2015-01-01_00:27:04 | 3.6 |
| 2015-01-01_00:27:05 | 4.1 |
| 2015-01-01_00:27:06 | 4.7 |
| 2015-01-01_00:27:07 | 5.2 |
| 2015-01-01_00:27:08 | 4.9 |
| 2015-01-01_00:27:09 | 4.7 |
| 2015-01-01_00:27:10 | 4.8 |
| 2015-01-01_00:27:11 | 5.1 |
| 2015-01-01_00:27:12 | 4.5 |
| 2015-01-01_00:27:13 | 4.6 |
| 2015-01-01_00:27:14 | 4.8 |
| 2015-01-01_00:27:15 | 4.5 |
| 2015-01-01_00:27:16 | 4.6 |
| 2015-01-01_00:27:17 | 4.5 |
| 2015-01-01_00:27:18 | 4.4 |
| 2015-01-01_00:27:19 | 7.4 |
| 2015-01-01_00:27:20 | 12.6 |
| 2015-01-01_00:27:21 | 13 |
| 2015-01-01_00:27:22 | 11.7 |
| 2015-01-01_00:27:23 | 8 |
| 2015-01-01_00:27:24 | 2.8 |
| 2015-01-01_00:27:25 | 0 |
| 2015-01-01_00:27:26 | 0 |
| 2015-01-01_00:27:27 | 0 |
| 2015-01-01_00:27:28 | 0 |
| 2015-01-01_00:27:29 | 0 |
| 2015-01-01_00:27:30 | 0.7 |
| 2015-01-01_00:27:31 | 2.6 |
| 2015-01-01_00:27:32 | 3.4 |
| 2015-01-01_00:27:33 | 3.7 |
| 2015-01-01_00:27:34 | 4 |
| 2015-01-01_00:27:35 | 3.7 |
| 2015-01-01_00:27:36 | 3.5 |
| 2015-01-01_00:27:37 | 3.7 |
| 2015-01-01_00:27:38 | 3.5 |
| 2015-01-01_00:27:39 | 3 |
| 2015-01-01_00:27:40 | 0.1 |
| 2015-01-01_00:27:41 | 0 |
| 2015-01-01_00:27:42 | 0 |
| 2015-01-01_00:27:43 | 0 |
| 2015-01-01_00:27:44 | 0 |
| 2015-01-01_00:27:45 | 0 |
| 2015-01-01_00:27:46 | 0 |
| 2015-01-01_00:27:47 | 0 |
| 2015-01-01_00:27:48 | 0 |
| 2015-01-01_00:27:49 | 0.3 |
| 2015-01-01_00:27:50 | 0 |
| 2015-01-01_00:27:51 | 0 |
| 2015-01-01_00:27:52 | 0 |
| 2015-01-01_00:27:53 | 0 |
| 2015-01-01_00:27:54 | 0 |
| 2015-01-01_00:27:55 | 0 |
| 2015-01-01_00:27:56 | 0 |
| 2015-01-01_00:27:57 | 0 |
| 2015-01-01_00:27:58 | 0.2 |
| 2015-01-01_00:27:59 | 0 |
| 2015-01-01_00:28:00 | 0 |
| 2015-01-01_00:28:01 | 0 |
| 2015-01-01_00:28:02 | 0 |
| 2015-01-01_00:28:03 | 0 |
| 2015-01-01_00:28:04 | 0 |
| 2015-01-01_00:28:05 | 0 |
| 2015-01-01_00:28:06 | 0 |
| 2015-01-01_00:28:07 | 0 |
| 2015-01-01_00:28:08 | 0 |
| 2015-01-01_00:28:09 | 0 |
| 2015-01-01_00:28:10 | 0 |
| 2015-01-01_00:28:11 | 0 |
| 2015-01-01_00:28:12 | 0 |
| 2015-01-01_00:28:13 | 0 |
| 2015-01-01_00:28:14 | 1.3 |
| 2015-01-01_00:28:15 | 2 |
| 2015-01-01_00:28:16 | 2.8 |
| 2015-01-01_00:28:17 | 3.5 |
| 2015-01-01_00:28:18 | 4.4 |
| 2015-01-01_00:28:19 | 0.6 |
| 2015-01-01_00:28:20 | 0.7 |
| 2015-01-01_00:28:21 | 0.6 |
| 2015-01-01_00:28:22 | 0.6 |
| 2015-01-01_00:28:23 | 0.7 |
| 2015-01-01_00:28:24 | 0.7 |
| 2015-01-01_00:28:25 | 0.8 |
| 2015-01-01_00:28:26 | 1.2 |
| 2015-01-01_00:28:27 | 24.3 |
| 2015-01-01_00:28:28 | 30.4 |
| 2015-01-01_00:28:29 | 8.9 |
| 2015-01-01_00:28:30 | 13.4 |
| 2015-01-01_00:28:31 | 20.9 |
| 2015-01-01_00:28:32 | 27.7 |
| 2015-01-01_00:28:33 | 6.5 |
| 2015-01-01_00:28:34 | 14.6 |
| 2015-01-01_00:28:35 | 23 |
| 2015-01-01_00:28:36 | 17.6 |
| 2015-01-01_00:28:37 | 14.8 |
| 2015-01-01_00:28:38 | 16.9 |
| 2015-01-01_00:28:39 | 7 |
| 2015-01-01_00:28:40 | 5.3 |
| 2015-01-01_00:28:41 | 13.5 |
| 2015-01-01_00:28:42 | 15.1 |
| 2015-01-01_00:28:43 | 15.9 |
| 2015-01-01_00:28:44 | 14 |
| 2015-01-01_00:28:45 | 11.4 |
| 2015-01-01_00:28:46 | 11.5 |
| 2015-01-01_00:28:47 | 11.7 |
| 2015-01-01_00:28:48 | 11.6 |
| 2015-01-01_00:28:49 | 1.8 |
| 2015-01-01_00:28:50 | 6.1 |
| 2015-01-01_00:28:51 | 11.3 |
| 2015-01-01_00:28:52 | 12.8 |
| 2015-01-01_00:28:53 | 10.3 |
| 2015-01-01_00:28:54 | 7.8 |
| 2015-01-01_00:28:55 | 5.2 |
| 2015-01-01_00:28:56 | 3.8 |
| 2015-01-01_00:28:57 | 4.8 |
| 2015-01-01_00:28:58 | 6.9 |
| 2015-01-01_00:28:59 | 9.1 |
| 2015-01-01_00:29:00 | 11.1 |
| 2015-01-01_00:29:01 | 9.9 |
| 2015-01-01_00:29:02 | 1.6 |
| 2015-01-01_00:29:03 | 6.1 |
| 2015-01-01_00:29:04 | 4.5 |
| 2015-01-01_00:29:05 | 3.3 |
| 2015-01-01_00:29:06 | 3.1 |
| 2015-01-01_00:29:07 | 2.4 |
| 2015-01-01_00:29:08 | 3.5 |
| 2015-01-01_00:29:09 | 3.8 |
| 2015-01-01_00:29:10 | 2.9 |
| 2015-01-01_00:29:11 | 1.4 |
| 2015-01-01_00:29:12 | 0.8 |
| 2015-01-01_00:29:13 | 2.5 |
| 2015-01-01_00:29:14 | 2.8 |
| 2015-01-01_00:29:15 | 2.7 |
| 2015-01-01_00:29:16 | 2.7 |
| 2015-01-01_00:29:17 | 2.9 |
| 2015-01-01_00:29:18 | 3.1 |
| 2015-01-01_00:29:19 | 2.8 |
| 2015-01-01_00:29:20 | 0.9 |
| 2015-01-01_00:29:21 | 4.1 |
| 2015-01-01_00:29:22 | 5 |
| 2015-01-01_00:29:23 | 4.4 |
| 2015-01-01_00:29:24 | 3.9 |
| 2015-01-01_00:29:25 | 3.7 |
| 2015-01-01_00:29:26 | 3.5 |
| 2015-01-01_00:29:27 | 3.3 |
| 2015-01-01_00:29:28 | 1.1 |
| 2015-01-01_00:29:29 | 0 |
| 2015-01-01_00:29:30 | 0 |
| 2015-01-01_00:29:31 | 0 |
| 2015-01-01_00:29:32 | 0 |
| 2015-01-01_00:29:33 | 0 |
| 2015-01-01_00:29:34 | 0 |
| 2015-01-01_00:29:35 | 0.1 |
| 2015-01-01_00:29:36 | 3.5 |
| 2015-01-01_00:29:37 | 2 |
| 2015-01-01_00:29:38 | 2.9 |
| 2015-01-01_00:29:39 | 10.1 |
| 2015-01-01_00:29:40 | 7.1 |
| 2015-01-01_00:29:41 | 3.6 |
| 2015-01-01_00:29:42 | 6.5 |
| 2015-01-01_00:29:43 | 9 |
| 2015-01-01_00:29:44 | 2.7 |
| 2015-01-01_00:29:45 | 2.2 |
| 2015-01-01_00:29:46 | 6.3 |
| 2015-01-01_00:29:47 | 8.1 |
| 2015-01-01_00:29:48 | 6 |
| 2015-01-01_00:29:49 | 4.2 |
| 2015-01-01_00:29:50 | 4.2 |
| 2015-01-01_00:29:51 | 4.6 |
| 2015-01-01_00:29:52 | 5.4 |
| 2015-01-01_00:29:53 | 5.6 |
| 2015-01-01_00:29:54 | 5.7 |
| 2015-01-01_00:29:55 | 6.1 |
| 2015-01-01_00:29:56 | 4 |
| 2015-01-01_00:29:57 | 2.8 |
| 2015-01-01_00:29:58 | 4.4 |
| 2015-01-01_00:29:59 | 4.1 |
| 2015-01-01_00:30:00 | 1.6 |
| 2015-01-01_00:30:01 | 0 |
| 2015-01-01_00:30:02 | 0 |
| 2015-01-01_00:30:03 | 0 |
| 2015-01-01_00:30:04 | 0 |
| 2015-01-01_00:30:05 | 2.9 |
| 2015-01-01_00:30:06 | 5.8 |
| 2015-01-01_00:30:07 | 4.3 |
| 2015-01-01_00:30:08 | 3.7 |
| 2015-01-01_00:30:09 | 5.2 |
| 2015-01-01_00:30:10 | 7.4 |
| 2015-01-01_00:30:11 | 8.8 |
| 2015-01-01_00:30:12 | 8.5 |
| 2015-01-01_00:30:13 | 7.6 |
| 2015-01-01_00:30:14 | 9.3 |
| 2015-01-01_00:30:15 | 7.9 |
| 2015-01-01_00:30:16 | 5.5 |
| 2015-01-01_00:30:17 | 5.3 |
| 2015-01-01_00:30:18 | 4.8 |
| 2015-01-01_00:30:19 | 3.9 |
| 2015-01-01_00:30:20 | 4.3 |
| 2015-01-01_00:30:21 | 4.8 |
| 2015-01-01_00:30:22 | 12.9 |
| 2015-01-01_00:30:23 | 20.3 |
| 2015-01-01_00:30:24 | 24.3 |
| 2015-01-01_00:30:25 | 24.1 |
| 2015-01-01_00:30:26 | 19.8 |
| 2015-01-01_00:30:27 | 3.2 |
| 2015-01-01_00:30:28 | 6.1 |
| 2015-01-01_00:30:29 | 0.4 |
| 2015-01-01_00:30:30 | 2.2 |
| 2015-01-01_00:30:31 | 3 |
| 2015-01-01_00:30:32 | 3.3 |
| 2015-01-01_00:30:33 | 5 |
| 2015-01-01_00:30:34 | 5.2 |
| 2015-01-01_00:30:35 | 4.5 |
| 2015-01-01_00:30:36 | 4.4 |
| 2015-01-01_00:30:37 | 4.4 |
| 2015-01-01_00:30:38 | 5.3 |
| 2015-01-01_00:30:39 | 4.9 |
| 2015-01-01_00:30:40 | 5.3 |
| 2015-01-01_00:30:41 | 5 |
| 2015-01-01_00:30:42 | 4.9 |
| 2015-01-01_00:30:43 | 5.1 |
| 2015-01-01_00:30:44 | 5 |
| 2015-01-01_00:30:45 | 4.8 |
| 2015-01-01_00:30:46 | 4.5 |
| 2015-01-01_00:30:47 | 4.2 |
| 2015-01-01_00:30:48 | 3.7 |
| 2015-01-01_00:30:49 | 0.5 |
| 2015-01-01_00:30:50 | 0 |
| 2015-01-01_00:30:51 | 0 |
| 2015-01-01_00:30:52 | 0 |
| 2015-01-01_00:30:53 | 0 |
| 2015-01-01_00:30:54 | 0 |
| 2015-01-01_00:30:55 | 0 |
| 2015-01-01_00:30:56 | 0 |
| 2015-01-01_00:30:57 | 0.2 |
| 2015-01-01_00:30:58 | 1.3 |
| 2015-01-01_00:30:59 | 1.6 |
| 2015-01-01_00:31:00 | 6.4 |
| 2015-01-01_00:31:01 | 19.2 |
| 2015-01-01_00:31:02 | 24.6 |
| 2015-01-01_00:31:03 | 6 |
| 2015-01-01_00:31:04 | 16.1 |
| 2015-01-01_00:31:05 | 20.5 |
| 2015-01-01_00:31:06 | 19.4 |
| 2015-01-01_00:31:07 | 10.4 |
| 2015-01-01_00:31:08 | 2.8 |
| 2015-01-01_00:31:09 | 12.8 |
| 2015-01-01_00:31:10 | 15.6 |
| 2015-01-01_00:31:11 | 5.1 |
| 2015-01-01_00:31:12 | 1.6 |
| 2015-01-01_00:31:13 | 3.6 |
| 2015-01-01_00:31:14 | 4 |
| 2015-01-01_00:31:15 | 4 |
| 2015-01-01_00:31:16 | 3.4 |
| 2015-01-01_00:31:17 | 4.1 |
| 2015-01-01_00:31:18 | 4.7 |
| 2015-01-01_00:31:19 | 5 |
| 2015-01-01_00:31:20 | 4.9 |
| 2015-01-01_00:31:21 | 4.7 |
| 2015-01-01_00:31:22 | 2.9 |
| 2015-01-01_00:31:23 | 5.7 |
| 2015-01-01_00:31:24 | 8 |
| 2015-01-01_00:31:25 | 5.3 |
| 2015-01-01_00:31:26 | 4.6 |
| 2015-01-01_00:31:27 | 4.6 |
| 2015-01-01_00:31:28 | 4.9 |
| 2015-01-01_00:31:29 | 4.3 |
| 2015-01-01_00:31:30 | 4.3 |
| 2015-01-01_00:31:31 | 4.5 |
| 2015-01-01_00:31:32 | 4.6 |
| 2015-01-01_00:31:33 | 5.1 |
| 2015-01-01_00:31:34 | 4.5 |
| 2015-01-01_00:31:35 | 4.4 |
| 2015-01-01_00:31:36 | 4.4 |
| 2015-01-01_00:31:37 | 4.5 |
| 2015-01-01_00:31:38 | 4.8 |
| 2015-01-01_00:31:39 | 4.4 |
| 2015-01-01_00:31:40 | 4.4 |
| 2015-01-01_00:31:41 | 4.3 |
| 2015-01-01_00:31:42 | 4.7 |
| 2015-01-01_00:31:43 | 4.3 |
| 2015-01-01_00:31:44 | 4.2 |
| 2015-01-01_00:31:45 | 3.9 |
| 2015-01-01_00:31:46 | 3.9 |
| 2015-01-01_00:31:47 | 4.1 |
| 2015-01-01_00:31:48 | 4 |
| 2015-01-01_00:31:49 | 3.8 |
| 2015-01-01_00:31:50 | 3.7 |
| 2015-01-01_00:31:51 | 4.2 |
| 2015-01-01_00:31:52 | 3.9 |
| 2015-01-01_00:31:53 | 3.8 |
| 2015-01-01_00:31:54 | 3.6 |
| 2015-01-01_00:31:55 | 3.7 |
| 2015-01-01_00:31:56 | 4 |
| 2015-01-01_00:31:57 | 4 |
| 2015-01-01_00:31:58 | 4.2 |
| 2015-01-01_00:31:59 | 3.6 |
| 2015-01-01_00:32:00 | 2.9 |
| 2015-01-01_00:32:01 | 2.7 |
| 2015-01-01_00:32:02 | 2.8 |
| 2015-01-01_00:32:03 | 3.1 |
| 2015-01-01_00:32:04 | 2.9 |
| 2015-01-01_00:32:05 | 2.9 |
| 2015-01-01_00:32:06 | 2.7 |
| 2015-01-01_00:32:07 | 3 |
| 2015-01-01_00:32:08 | 3.3 |
| 2015-01-01_00:32:09 | 3.4 |
| 2015-01-01_00:32:10 | 3.6 |
| 2015-01-01_00:32:11 | 3.3 |
| 2015-01-01_00:32:12 | 3.2 |
| 2015-01-01_00:32:13 | 3.3 |
| 2015-01-01_00:32:14 | 3.5 |
| 2015-01-01_00:32:15 | 4.9 |
| 2015-01-01_00:32:16 | 5 |
| 2015-01-01_00:32:17 | 4.8 |
| 2015-01-01_00:32:18 | 4.5 |
| 2015-01-01_00:32:19 | 4.6 |
| 2015-01-01_00:32:20 | 5.1 |
| 2015-01-01_00:32:21 | 4.7 |
| 2015-01-01_00:32:22 | 4.8 |
| 2015-01-01_00:32:23 | 4 |
| 2015-01-01_00:32:24 | 4.1 |
| 2015-01-01_00:32:25 | 3.9 |
| 2015-01-01_00:32:26 | 4.2 |
| 2015-01-01_00:32:27 | 4.5 |
| 2015-01-01_00:32:28 | 4.5 |
| 2015-01-01_00:32:29 | 4.7 |
| 2015-01-01_00:32:30 | 4.2 |
| 2015-01-01_00:32:31 | 4.1 |
| 2015-01-01_00:32:32 | 4.4 |
| 2015-01-01_00:32:33 | 4.4 |
| 2015-01-01_00:32:34 | 4.8 |
| 2015-01-01_00:32:35 | 4.6 |
| 2015-01-01_00:32:36 | 4.5 |
| 2015-01-01_00:32:37 | 4.4 |
| 2015-01-01_00:32:38 | 4.4 |
| 2015-01-01_00:32:39 | 4.4 |
| 2015-01-01_00:32:40 | 4.4 |
| 2015-01-01_00:32:41 | 4.5 |
| 2015-01-01_00:32:42 | 4.5 |
| 2015-01-01_00:32:43 | 4.3 |
| 2015-01-01_00:32:44 | 4.1 |
| 2015-01-01_00:32:45 | 4.1 |
| 2015-01-01_00:32:46 | 3.7 |
| 2015-01-01_00:32:47 | 3.3 |
| 2015-01-01_00:32:48 | 3.3 |
| 2015-01-01_00:32:49 | 3.3 |
| 2015-01-01_00:32:50 | 3.3 |
| 2015-01-01_00:32:51 | 3.1 |
| 2015-01-01_00:32:52 | 3.2 |
| 2015-01-01_00:32:53 | 3.1 |
| 2015-01-01_00:32:54 | 2.9 |
| 2015-01-01_00:32:55 | 2.9 |
| 2015-01-01_00:32:56 | 3 |
| 2015-01-01_00:32:57 | 3.5 |
| 2015-01-01_00:32:58 | 3.1 |
| 2015-01-01_00:32:59 | 3 |
| 2015-01-01_00:33:00 | 2.8 |
| 2015-01-01_00:33:01 | 2.9 |
| 2015-01-01_00:33:02 | 2.6 |
| 2015-01-01_00:33:03 | 2.4 |
| 2015-01-01_00:33:04 | 2.4 |
| 2015-01-01_00:33:05 | 2.8 |
| 2015-01-01_00:33:06 | 2.9 |
| 2015-01-01_00:33:07 | 2.1 |
| 2015-01-01_00:33:08 | 2.1 |
| 2015-01-01_00:33:09 | 2.2 |
| 2015-01-01_00:33:10 | 2.3 |
| 2015-01-01_00:33:11 | 2.4 |
| 2015-01-01_00:33:12 | 2.3 |
| 2015-01-01_00:33:13 | 2.2 |
| 2015-01-01_00:33:14 | 2.3 |
| 2015-01-01_00:33:15 | 2.1 |
| 2015-01-01_00:33:16 | 2.4 |
| 2015-01-01_00:33:17 | 2.3 |
| 2015-01-01_00:33:18 | 2.5 |
| 2015-01-01_00:33:19 | 2.6 |
| 2015-01-01_00:33:20 | 2.7 |
| 2015-01-01_00:33:21 | 2.6 |
| 2015-01-01_00:33:22 | 2.5 |
| 2015-01-01_00:33:23 | 2.5 |
| 2015-01-01_00:33:24 | 2.5 |
| 2015-01-01_00:33:25 | 2.9 |
| 2015-01-01_00:33:26 | 2.8 |
| 2015-01-01_00:33:27 | 2.7 |
| 2015-01-01_00:33:28 | 2.6 |
| 2015-01-01_00:33:29 | 2.6 |
| 2015-01-01_00:33:30 | 2.9 |
| 2015-01-01_00:33:31 | 2.8 |
| 2015-01-01_00:33:32 | 3.2 |
| 2015-01-01_00:33:33 | 2.9 |
| 2015-01-01_00:33:34 | 3.3 |
| 2015-01-01_00:33:35 | 4 |
| 2015-01-01_00:33:36 | 3.5 |
| 2015-01-01_00:33:37 | 3.2 |
| 2015-01-01_00:33:38 | 3 |
| 2015-01-01_00:33:39 | 3.2 |
| 2015-01-01_00:33:40 | 3 |
| 2015-01-01_00:33:41 | 2.7 |
| 2015-01-01_00:33:42 | 2.8 |
| 2015-01-01_00:33:43 | 3.1 |
| 2015-01-01_00:33:44 | 3.8 |
| 2015-01-01_00:33:45 | 4.1 |
| 2015-01-01_00:33:46 | 4 |
| 2015-01-01_00:33:47 | 4 |
| 2015-01-01_00:33:48 | 3.7 |
| 2015-01-01_00:33:49 | 3.9 |
| 2015-01-01_00:33:50 | 3.6 |
| 2015-01-01_00:33:51 | 3.7 |
| 2015-01-01_00:33:52 | 3.6 |
| 2015-01-01_00:33:53 | 3.8 |
| 2015-01-01_00:33:54 | 3.2 |
| 2015-01-01_00:33:55 | 3.4 |
| 2015-01-01_00:33:56 | 3.4 |
| 2015-01-01_00:33:57 | 3.3 |
| 2015-01-01_00:33:58 | 3.8 |
| 2015-01-01_00:33:59 | 3.8 |
| 2015-01-01_00:34:00 | 4 |
| 2015-01-01_00:34:01 | 3.9 |
| 2015-01-01_00:34:02 | 3.5 |
| 2015-01-01_00:34:03 | 3.7 |
| 2015-01-01_00:34:04 | 3.1 |
| 2015-01-01_00:34:05 | 2.9 |
| 2015-01-01_00:34:06 | 2.5 |
| 2015-01-01_00:34:07 | 0 |
| 2015-01-01_00:34:08 | 0 |
| 2015-01-01_00:34:09 | 0 |
| 2015-01-01_00:34:10 | 0 |
| 2015-01-01_00:34:11 | 0 |
| 2015-01-01_00:34:12 | 3.1 |
| 2015-01-01_00:34:13 | 4.7 |
| 2015-01-01_00:34:14 | 4.4 |
| 2015-01-01_00:34:15 | 5 |
| 2015-01-01_00:34:16 | 7 |
| 2015-01-01_00:34:17 | 4.6 |
| 2015-01-01_00:34:18 | 6.6 |
| 2015-01-01_00:34:19 | 4.6 |
| 2015-01-01_00:34:20 | 4.3 |
| 2015-01-01_00:34:21 | 3.4 |
| 2015-01-01_00:34:22 | 1.5 |
| 2015-01-01_00:34:23 | 0.9 |
| 2015-01-01_00:34:24 | 1.3 |
| 2015-01-01_00:34:25 | 2.5 |
| 2015-01-01_00:34:26 | 2.6 |
| 2015-01-01_00:34:27 | 1.5 |
| 2015-01-01_00:34:28 | 0 |
| 2015-01-01_00:34:29 | 0 |
| 2015-01-01_00:34:30 | 0 |
| 2015-01-01_00:34:31 | 0 |
| 2015-01-01_00:34:32 | 0 |
| 2015-01-01_00:34:33 | 1.8 |
| 2015-01-01_00:34:34 | 2.3 |
| 2015-01-01_00:34:35 | 3.2 |
| 2015-01-01_00:34:36 | 4.3 |
| 2015-01-01_00:34:37 | 3.2 |
| 2015-01-01_00:34:38 | 2.6 |
| 2015-01-01_00:34:39 | 3.4 |
| 2015-01-01_00:34:40 | 2.6 |
| 2015-01-01_00:34:41 | 3.7 |
| 2015-01-01_00:34:42 | 4.7 |
| 2015-01-01_00:34:43 | 4.9 |
| 2015-01-01_00:34:44 | 4.3 |
| 2015-01-01_00:34:45 | 3.9 |
| 2015-01-01_00:34:46 | 4.1 |
| 2015-01-01_00:34:47 | 2.5 |
| 2015-01-01_00:34:48 | 0 |
| 2015-01-01_00:34:49 | 0 |
| 2015-01-01_00:34:50 | 0 |
| 2015-01-01_00:34:51 | 0 |
| 2015-01-01_00:34:52 | 0 |
| 2015-01-01_00:34:53 | 0 |
| 2015-01-01_00:34:54 | 0 |
| 2015-01-01_00:34:55 | 0 |
| 2015-01-01_00:34:56 | 1.2 |
| 2015-01-01_00:34:57 | 2.8 |
| 2015-01-01_00:34:58 | 0.5 |
| 2015-01-01_00:34:59 | 6.8 |
| 2015-01-01_00:35:00 | 13.8 |
| 2015-01-01_00:35:01 | 11.5 |
| 2015-01-01_00:35:02 | 11.7 |
| 2015-01-01_00:35:03 | 7.5 |
| 2015-01-01_00:35:04 | 5 |
| 2015-01-01_00:35:05 | 7.2 |
| 2015-01-01_00:35:06 | 8.7 |
| 2015-01-01_00:35:07 | 1.7 |
| 2015-01-01_00:35:08 | 4.3 |
| 2015-01-01_00:35:09 | 3.4 |
| 2015-01-01_00:35:10 | 2.4 |
| 2015-01-01_00:35:11 | 2.3 |
| 2015-01-01_00:35:12 | 2.8 |
| 2015-01-01_00:35:13 | 2.9 |
| 2015-01-01_00:35:14 | 2.4 |
| 2015-01-01_00:35:15 | 2.1 |
| 2015-01-01_00:35:16 | 3.3 |
| 2015-01-01_00:35:17 | 3.2 |
| 2015-01-01_00:35:18 | 3.5 |
| 2015-01-01_00:35:19 | 3.6 |
| 2015-01-01_00:35:20 | 2.4 |
| 2015-01-01_00:35:21 | 1.7 |
| 2015-01-01_00:35:22 | 2.5 |
| 2015-01-01_00:35:23 | 3 |
| 2015-01-01_00:35:24 | 2.2 |
| 2015-01-01_00:35:25 | 0.3 |
| 2015-01-01_00:35:26 | 0.3 |
| 2015-01-01_00:35:27 | 0 |
| 2015-01-01_00:35:28 | 0 |
| 2015-01-01_00:35:29 | 0 |
| 2015-01-01_00:35:30 | 0 |
| 2015-01-01_00:35:31 | 0.1 |
| 2015-01-01_00:35:32 | 0.6 |
| 2015-01-01_00:35:33 | 2.1 |
| 2015-01-01_00:35:34 | 5.6 |
| 2015-01-01_00:35:35 | 8.4 |
| 2015-01-01_00:35:36 | 6.4 |
| 2015-01-01_00:35:37 | 3.8 |
| 2015-01-01_00:35:38 | 8.5 |
| 2015-01-01_00:35:39 | 15.7 |
| 2015-01-01_00:35:40 | 16.5 |
| 2015-01-01_00:35:41 | 18.4 |
| 2015-01-01_00:35:42 | 17.6 |
| 2015-01-01_00:35:43 | 12.2 |
| 2015-01-01_00:35:44 | 2.6 |
| 2015-01-01_00:35:45 | 11.2 |
| 2015-01-01_00:35:46 | 14.3 |
| 2015-01-01_00:35:47 | 15 |
| 2015-01-01_00:35:48 | 13.6 |
| 2015-01-01_00:35:49 | 14.4 |
| 2015-01-01_00:35:50 | 14.1 |
| 2015-01-01_00:35:51 | 6.8 |
| 2015-01-01_00:35:52 | 3.4 |
| 2015-01-01_00:35:53 | 10.8 |
| 2015-01-01_00:35:54 | 12.5 |
| 2015-01-01_00:35:55 | 12.5 |
| 2015-01-01_00:35:56 | 11.6 |
| 2015-01-01_00:35:57 | 6.6 |
| 2015-01-01_00:35:58 | 3.8 |
| 2015-01-01_00:35:59 | 0.3 |
| 2015-01-01_00:36:00 | 0 |
| 2015-01-01_00:36:01 | 1.9 |
| 2015-01-01_00:36:02 | 4.9 |
| 2015-01-01_00:36:03 | 5 |
| 2015-01-01_00:36:04 | 4.6 |
| 2015-01-01_00:36:05 | 4.7 |
| 2015-01-01_00:36:06 | 5.9 |
| 2015-01-01_00:36:07 | 5.2 |
| 2015-01-01_00:36:08 | 4.8 |
| 2015-01-01_00:36:09 | 4.6 |
| 2015-01-01_00:36:10 | 4.2 |
| 2015-01-01_00:36:11 | 4 |
| 2015-01-01_00:36:12 | 4.1 |
| 2015-01-01_00:36:13 | 4.1 |
| 2015-01-01_00:36:14 | 4.1 |
| 2015-01-01_00:36:15 | 4.2 |
| 2015-01-01_00:36:16 | 3.7 |
| 2015-01-01_00:36:17 | 3.4 |
| 2015-01-01_00:36:18 | 3.2 |
| 2015-01-01_00:36:19 | 3.1 |
| 2015-01-01_00:36:20 | 3.3 |
| 2015-01-01_00:36:21 | 3 |
| 2015-01-01_00:36:22 | 3.3 |
| 2015-01-01_00:36:23 | 3.3 |
| 2015-01-01_00:36:24 | 3.3 |
| 2015-01-01_00:36:25 | 3.3 |
| 2015-01-01_00:36:26 | 3.3 |
| 2015-01-01_00:36:27 | 3.4 |
| 2015-01-01_00:36:28 | 3.3 |
| 2015-01-01_00:36:29 | 3.3 |
| 2015-01-01_00:36:30 | 3.3 |
| 2015-01-01_00:36:31 | 3.2 |
| 2015-01-01_00:36:32 | 3.3 |
| 2015-01-01_00:36:33 | 3.4 |
| 2015-01-01_00:36:34 | 3.6 |
| 2015-01-01_00:36:35 | 4.1 |
| 2015-01-01_00:36:36 | 4.1 |
| 2015-01-01_00:36:37 | 4.3 |
| 2015-01-01_00:36:38 | 4.1 |
| 2015-01-01_00:36:39 | 3.9 |
| 2015-01-01_00:36:40 | 4.1 |
| 2015-01-01_00:36:41 | 3.9 |
| 2015-01-01_00:36:42 | 4.2 |
| 2015-01-01_00:36:43 | 4.1 |
| 2015-01-01_00:36:44 | 4.2 |
| 2015-01-01_00:36:45 | 4 |
| 2015-01-01_00:36:46 | 4.1 |
| 2015-01-01_00:36:47 | 4 |
| 2015-01-01_00:36:48 | 4.2 |
| 2015-01-01_00:36:49 | 4.4 |
| 2015-01-01_00:36:50 | 4.2 |
| 2015-01-01_00:36:51 | 3.8 |
| 2015-01-01_00:36:52 | 4.1 |
| 2015-01-01_00:36:53 | 4.2 |
| 2015-01-01_00:36:54 | 4.1 |
| 2015-01-01_00:36:55 | 4 |
| 2015-01-01_00:36:56 | 3.6 |
| 2015-01-01_00:36:57 | 3.4 |
| 2015-01-01_00:36:58 | 3.3 |
| 2015-01-01_00:36:59 | 3.3 |
| 2015-01-01_00:37:00 | 3.2 |
| 2015-01-01_00:37:01 | 3.1 |
| 2015-01-01_00:37:02 | 2.9 |
| 2015-01-01_00:37:03 | 3.1 |
| 2015-01-01_00:37:04 | 3.2 |
| 2015-01-01_00:37:05 | 3.1 |
| 2015-01-01_00:37:06 | 2.9 |
| 2015-01-01_00:37:07 | 3.2 |
| 2015-01-01_00:37:08 | 3.2 |
| 2015-01-01_00:37:09 | 3.2 |
| 2015-01-01_00:37:10 | 3.3 |
| 2015-01-01_00:37:11 | 3.3 |
| 2015-01-01_00:37:12 | 3.2 |
| 2015-01-01_00:37:13 | 3.9 |
| 2015-01-01_00:37:14 | 4.4 |
| 2015-01-01_00:37:15 | 4.4 |
| 2015-01-01_00:37:16 | 4.4 |
| 2015-01-01_00:37:17 | 4.2 |
| 2015-01-01_00:37:18 | 4.1 |
| 2015-01-01_00:37:19 | 4.4 |
| 2015-01-01_00:37:20 | 4.2 |
| 2015-01-01_00:37:21 | 4 |
| 2015-01-01_00:37:22 | 4 |
| 2015-01-01_00:37:23 | 4.3 |
| 2015-01-01_00:37:24 | 4.4 |
| 2015-01-01_00:37:25 | 4.4 |
| 2015-01-01_00:37:26 | 4.3 |
| 2015-01-01_00:37:27 | 4.3 |
| 2015-01-01_00:37:28 | 4.5 |
| 2015-01-01_00:37:29 | 4.7 |
| 2015-01-01_00:37:30 | 4.5 |
| 2015-01-01_00:37:31 | 4.4 |
| 2015-01-01_00:37:32 | 4.4 |
| 2015-01-01_00:37:33 | 4.5 |
| 2015-01-01_00:37:34 | 4.3 |
| 2015-01-01_00:37:35 | 4.2 |
| 2015-01-01_00:37:36 | 4.3 |
| 2015-01-01_00:37:37 | 4.3 |
| 2015-01-01_00:37:38 | 4.3 |
| 2015-01-01_00:37:39 | 4.2 |
| 2015-01-01_00:37:40 | 4 |
| 2015-01-01_00:37:41 | 4 |
| 2015-01-01_00:37:42 | 4 |
| 2015-01-01_00:37:43 | 4.1 |
| 2015-01-01_00:37:44 | 4.3 |
| 2015-01-01_00:37:45 | 4.6 |
| 2015-01-01_00:37:46 | 4.1 |
| 2015-01-01_00:37:47 | 4.1 |
| 2015-01-01_00:37:48 | 4.2 |
| 2015-01-01_00:37:49 | 4.4 |
| 2015-01-01_00:37:50 | 4.7 |
| 2015-01-01_00:37:51 | 4.7 |
| 2015-01-01_00:37:52 | 4.2 |
| 2015-01-01_00:37:53 | 4.4 |
| 2015-01-01_00:37:54 | 4.1 |
| 2015-01-01_00:37:55 | 4.2 |
| 2015-01-01_00:37:56 | 4.3 |
| 2015-01-01_00:37:57 | 4.4 |
| 2015-01-01_00:37:58 | 4.4 |
| 2015-01-01_00:37:59 | 4.3 |
| 2015-01-01_00:38:00 | 4.1 |
| 2015-01-01_00:38:01 | 4.3 |
| 2015-01-01_00:38:02 | 4 |
| 2015-01-01_00:38:03 | 4.3 |
| 2015-01-01_00:38:04 | 4.3 |
| 2015-01-01_00:38:05 | 4.3 |
| 2015-01-01_00:38:06 | 4 |
| 2015-01-01_00:38:07 | 4.2 |
| 2015-01-01_00:38:08 | 4.4 |
| 2015-01-01_00:38:09 | 4.4 |
| 2015-01-01_00:38:10 | 4.6 |
| 2015-01-01_00:38:11 | 4.6 |
| 2015-01-01_00:38:12 | 4.2 |
| 2015-01-01_00:38:13 | 5.1 |
| 2015-01-01_00:38:14 | 5.2 |
| 2015-01-01_00:38:15 | 5.2 |
| 2015-01-01_00:38:16 | 5.6 |
| 2015-01-01_00:38:17 | 5.9 |
| 2015-01-01_00:38:18 | 5.7 |
| 2015-01-01_00:38:19 | 5.5 |
| 2015-01-01_00:38:20 | 5 |
| 2015-01-01_00:38:21 | 4.8 |
| 2015-01-01_00:38:22 | 4.1 |
| 2015-01-01_00:38:23 | 4.1 |
| 2015-01-01_00:38:24 | 3.8 |
| 2015-01-01_00:38:25 | 3.5 |
| 2015-01-01_00:38:26 | 3.3 |
| 2015-01-01_00:38:27 | 3.1 |
| 2015-01-01_00:38:28 | 3 |
| 2015-01-01_00:38:29 | 3.2 |
| 2015-01-01_00:38:30 | 3.4 |
| 2015-01-01_00:38:31 | 3.2 |
| 2015-01-01_00:38:32 | 3.4 |
| 2015-01-01_00:38:33 | 3.6 |
| 2015-01-01_00:38:34 | 4.1 |
| 2015-01-01_00:38:35 | 4.1 |
| 2015-01-01_00:38:36 | 4.4 |
| 2015-01-01_00:38:37 | 4.1 |
| 2015-01-01_00:38:38 | 4.1 |
| 2015-01-01_00:38:39 | 3.9 |
| 2015-01-01_00:38:40 | 4 |
| 2015-01-01_00:38:41 | 4 |
| 2015-01-01_00:38:42 | 4 |
| 2015-01-01_00:38:43 | 3.8 |
| 2015-01-01_00:38:44 | 4.1 |
| 2015-01-01_00:38:45 | 4 |
| 2015-01-01_00:38:46 | 4.1 |
| 2015-01-01_00:38:47 | 4 |
| 2015-01-01_00:38:48 | 4.1 |
| 2015-01-01_00:38:49 | 4 |
| 2015-01-01_00:38:50 | 4 |
| 2015-01-01_00:38:51 | 4.1 |
| 2015-01-01_00:38:52 | 4.4 |
| 2015-01-01_00:38:53 | 4.2 |
| 2015-01-01_00:38:54 | 4.3 |
| 2015-01-01_00:38:55 | 4.8 |
| 2015-01-01_00:38:56 | 5.4 |
| 2015-01-01_00:38:57 | 5.8 |
| 2015-01-01_00:38:58 | 5.9 |
| 2015-01-01_00:38:59 | 5.6 |
| 2015-01-01_00:39:00 | 5.4 |
| 2015-01-01_00:39:01 | 5.5 |
| 2015-01-01_00:39:02 | 4.9 |
| 2015-01-01_00:39:03 | 4.9 |
| 2015-01-01_00:39:04 | 5 |
| 2015-01-01_00:39:05 | 4.6 |
| 2015-01-01_00:39:06 | 4.1 |
| 2015-01-01_00:39:07 | 3.9 |
| 2015-01-01_00:39:08 | 3.7 |
| 2015-01-01_00:39:09 | 3.9 |
| 2015-01-01_00:39:10 | 4.2 |
| 2015-01-01_00:39:11 | 3.9 |
| 2015-01-01_00:39:12 | 4 |
| 2015-01-01_00:39:13 | 3.8 |
| 2015-01-01_00:39:14 | 3.7 |
| 2015-01-01_00:39:15 | 3.9 |
| 2015-01-01_00:39:16 | 3.8 |
| 2015-01-01_00:39:17 | 3.6 |
| 2015-01-01_00:39:18 | 3.5 |
| 2015-01-01_00:39:19 | 4.1 |
| 2015-01-01_00:39:20 | 4.7 |
| 2015-01-01_00:39:21 | 5 |
| 2015-01-01_00:39:22 | 4.8 |
| 2015-01-01_00:39:23 | 4.5 |
| 2015-01-01_00:39:24 | 4.8 |
| 2015-01-01_00:39:25 | 4.8 |
| 2015-01-01_00:39:26 | 4.7 |
| 2015-01-01_00:39:27 | 4.7 |
| 2015-01-01_00:39:28 | 4.7 |
| 2015-01-01_00:39:29 | 4.8 |
| 2015-01-01_00:39:30 | 4.8 |
| 2015-01-01_00:39:31 | 4.8 |
| 2015-01-01_00:39:32 | 4.9 |
| 2015-01-01_00:39:33 | 4.6 |
| 2015-01-01_00:39:34 | 4.8 |
| 2015-01-01_00:39:35 | 4.8 |
| 2015-01-01_00:39:36 | 4.9 |
| 2015-01-01_00:39:37 | 4.7 |
| 2015-01-01_00:39:38 | 4.6 |
| 2015-01-01_00:39:39 | 4.7 |
| 2015-01-01_00:39:40 | 4.8 |
| 2015-01-01_00:39:41 | 4.8 |
| 2015-01-01_00:39:42 | 4.9 |
| 2015-01-01_00:39:43 | 4.7 |
| 2015-01-01_00:39:44 | 4.9 |
| 2015-01-01_00:39:45 | 4.8 |
| 2015-01-01_00:39:46 | 4.7 |
| 2015-01-01_00:39:47 | 4.7 |
| 2015-01-01_00:39:48 | 4.8 |
| 2015-01-01_00:39:49 | 4.7 |
| 2015-01-01_00:39:50 | 4.8 |
| 2015-01-01_00:39:51 | 4.8 |
| 2015-01-01_00:39:52 | 4.8 |
| 2015-01-01_00:39:53 | 4.6 |
| 2015-01-01_00:39:54 | 4.4 |
| 2015-01-01_00:39:55 | 4.6 |
| 2015-01-01_00:39:56 | 4.9 |
| 2015-01-01_00:39:57 | 5 |
| 2015-01-01_00:39:58 | 5.2 |
| 2015-01-01_00:39:59 | 5.3 |
| 2015-01-01_00:40:00 | 5.4 |
| 2015-01-01_00:40:01 | 5.6 |
| 2015-01-01_00:40:02 | 5.4 |
| 2015-01-01_00:40:03 | 5.1 |
| 2015-01-01_00:40:04 | 5.1 |
| 2015-01-01_00:40:05 | 5.3 |
| 2015-01-01_00:40:06 | 5.4 |
| 2015-01-01_00:40:07 | 5.3 |
| 2015-01-01_00:40:08 | 5.4 |
| 2015-01-01_00:40:09 | 5.4 |
| 2015-01-01_00:40:10 | 5.6 |
| 2015-01-01_00:40:11 | 5.6 |
| 2015-01-01_00:40:12 | 5.5 |
| 2015-01-01_00:40:13 | 5 |
| 2015-01-01_00:40:14 | 5.1 |
| 2015-01-01_00:40:15 | 5.7 |
| 2015-01-01_00:40:16 | 5.8 |
| 2015-01-01_00:40:17 | 5.6 |
| 2015-01-01_00:40:18 | 5.3 |
| 2015-01-01_00:40:19 | 5.4 |
| 2015-01-01_00:40:20 | 5.6 |
| 2015-01-01_00:40:21 | 5.5 |
| 2015-01-01_00:40:22 | 5.5 |
| 2015-01-01_00:40:23 | 5.3 |
| 2015-01-01_00:40:24 | 5.5 |
| 2015-01-01_00:40:25 | 5.1 |
| 2015-01-01_00:40:26 | 5.4 |
| 2015-01-01_00:40:27 | 5.7 |
| 2015-01-01_00:40:28 | 5.9 |
| 2015-01-01_00:40:29 | 5.3 |
| 2015-01-01_00:40:30 | 5.3 |
| 2015-01-01_00:40:31 | 5.4 |
| 2015-01-01_00:40:32 | 5.4 |
| 2015-01-01_00:40:33 | 5.2 |
| 2015-01-01_00:40:34 | 5.6 |
| 2015-01-01_00:40:35 | 5.9 |
| 2015-01-01_00:40:36 | 5.4 |
| 2015-01-01_00:40:37 | 5.6 |
| 2015-01-01_00:40:38 | 5.5 |
| 2015-01-01_00:40:39 | 5.4 |
| 2015-01-01_00:40:40 | 5.3 |
| 2015-01-01_00:40:41 | 5.5 |
| 2015-01-01_00:40:42 | 5.1 |
| 2015-01-01_00:40:43 | 4.9 |
| 2015-01-01_00:40:44 | 4.8 |
| 2015-01-01_00:40:45 | 5 |
| 2015-01-01_00:40:46 | 5.2 |
| 2015-01-01_00:40:47 | 5.1 |
| 2015-01-01_00:40:48 | 5.1 |
| 2015-01-01_00:40:49 | 5 |
| 2015-01-01_00:40:50 | 5.1 |
| 2015-01-01_00:40:51 | 5 |
| 2015-01-01_00:40:52 | 5.4 |
| 2015-01-01_00:40:53 | 5.3 |
| 2015-01-01_00:40:54 | 4.9 |
| 2015-01-01_00:40:55 | 5.3 |
| 2015-01-01_00:40:56 | 5.1 |
| 2015-01-01_00:40:57 | 5.1 |
| 2015-01-01_00:40:58 | 5 |
| 2015-01-01_00:40:59 | 5.1 |
| 2015-01-01_00:41:00 | 5.4 |
| 2015-01-01_00:41:01 | 5.1 |
| 2015-01-01_00:41:02 | 5.2 |
| 2015-01-01_00:41:03 | 5.1 |
| 2015-01-01_00:41:04 | 4.9 |
| 2015-01-01_00:41:05 | 5.1 |
| 2015-01-01_00:41:06 | 5.3 |
| 2015-01-01_00:41:07 | 5.2 |
| 2015-01-01_00:41:08 | 5.1 |
| 2015-01-01_00:41:09 | 5.1 |
| 2015-01-01_00:41:10 | 5.2 |
| 2015-01-01_00:41:11 | 5.1 |
| 2015-01-01_00:41:12 | 5.1 |
| 2015-01-01_00:41:13 | 5.5 |
| 2015-01-01_00:41:14 | 5.1 |
| 2015-01-01_00:41:15 | 5.2 |
| 2015-01-01_00:41:16 | 5 |
| 2015-01-01_00:41:17 | 5 |
| 2015-01-01_00:41:18 | 4.8 |
| 2015-01-01_00:41:19 | 5.3 |
| 2015-01-01_00:41:20 | 5.1 |
| 2015-01-01_00:41:21 | 5.3 |
| 2015-01-01_00:41:22 | 5.1 |
| 2015-01-01_00:41:23 | 5 |
| 2015-01-01_00:41:24 | 4.9 |
| 2015-01-01_00:41:25 | 4.6 |
| 2015-01-01_00:41:26 | 4.8 |
| 2015-01-01_00:41:27 | 4.7 |
| 2015-01-01_00:41:28 | 4.8 |
| 2015-01-01_00:41:29 | 4.6 |
| 2015-01-01_00:41:30 | 4.4 |
| 2015-01-01_00:41:31 | 4.6 |
| 2015-01-01_00:41:32 | 4.7 |
| 2015-01-01_00:41:33 | 4.9 |
| 2015-01-01_00:41:34 | 4.7 |
| 2015-01-01_00:41:35 | 4.5 |
| 2015-01-01_00:41:36 | 4.6 |
| 2015-01-01_00:41:37 | 4.5 |
| 2015-01-01_00:41:38 | 4.6 |
| 2015-01-01_00:41:39 | 4.6 |
| 2015-01-01_00:41:40 | 4.7 |
| 2015-01-01_00:41:41 | 4.5 |
| 2015-01-01_00:41:42 | 4.5 |
| 2015-01-01_00:41:43 | 4.3 |
| 2015-01-01_00:41:44 | 4.7 |
| 2015-01-01_00:41:45 | 4.4 |
| 2015-01-01_00:41:46 | 4.4 |
| 2015-01-01_00:41:47 | 4.2 |
| 2015-01-01_00:41:48 | 4.4 |
| 2015-01-01_00:41:49 | 4.2 |
| 2015-01-01_00:41:50 | 4.3 |
| 2015-01-01_00:41:51 | 4.4 |
| 2015-01-01_00:41:52 | 4.4 |
| 2015-01-01_00:41:53 | 4.5 |
| 2015-01-01_00:41:54 | 4.4 |
| 2015-01-01_00:41:55 | 4.1 |
| 2015-01-01_00:41:56 | 4.4 |
| 2015-01-01_00:41:57 | 4.6 |
| 2015-01-01_00:41:58 | 4.8 |
| 2015-01-01_00:41:59 | 4.9 |
| 2015-01-01_00:42:00 | 4.9 |
| 2015-01-01_00:42:01 | 5 |
| 2015-01-01_00:42:02 | 4.9 |
| 2015-01-01_00:42:03 | 5 |
| 2015-01-01_00:42:04 | 5.1 |
| 2015-01-01_00:42:05 | 4.8 |
| 2015-01-01_00:42:06 | 5 |
| 2015-01-01_00:42:07 | 5.1 |
| 2015-01-01_00:42:08 | 4.9 |
| 2015-01-01_00:42:09 | 4.8 |
| 2015-01-01_00:42:10 | 4.9 |
| 2015-01-01_00:42:11 | 4.9 |
| 2015-01-01_00:42:12 | 4.9 |
| 2015-01-01_00:42:13 | 5 |
| 2015-01-01_00:42:14 | 5 |
| 2015-01-01_00:42:15 | 4.7 |
| 2015-01-01_00:42:16 | 4.7 |
| 2015-01-01_00:42:17 | 5 |
| 2015-01-01_00:42:18 | 4.9 |
| 2015-01-01_00:42:19 | 4.9 |
| 2015-01-01_00:42:20 | 4.9 |
| 2015-01-01_00:42:21 | 5 |
| 2015-01-01_00:42:22 | 5.2 |
| 2015-01-01_00:42:23 | 5.9 |
| 2015-01-01_00:42:24 | 6.1 |
| 2015-01-01_00:42:25 | 6.5 |
| 2015-01-01_00:42:26 | 8.5 |
| 2015-01-01_00:42:27 | 7.5 |
| 2015-01-01_00:42:28 | 6.9 |
| 2015-01-01_00:42:29 | 6.6 |
| 2015-01-01_00:42:30 | 6.2 |
| 2015-01-01_00:42:31 | 5.9 |
| 2015-01-01_00:42:32 | 5.8 |
| 2015-01-01_00:42:33 | 5.7 |
| 2015-01-01_00:42:34 | 5.5 |
| 2015-01-01_00:42:35 | 5.1 |
| 2015-01-01_00:42:36 | 4.9 |
| 2015-01-01_00:42:37 | 4.6 |
| 2015-01-01_00:42:38 | 4.2 |
| 2015-01-01_00:42:39 | 4 |
| 2015-01-01_00:42:40 | 3.6 |
| 2015-01-01_00:42:41 | 3.5 |
| 2015-01-01_00:42:42 | 3.2 |
| 2015-01-01_00:42:43 | 3.1 |
| 2015-01-01_00:42:44 | 2.7 |
| 2015-01-01_00:42:45 | 2.7 |
| 2015-01-01_00:42:46 | 2.8 |
| 2015-01-01_00:42:47 | 3 |
| 2015-01-01_00:42:48 | 3.3 |
| 2015-01-01_00:42:49 | 3.9 |
| 2015-01-01_00:42:50 | 4.4 |
| 2015-01-01_00:42:51 | 4.7 |
| 2015-01-01_00:42:52 | 4.9 |
| 2015-01-01_00:42:53 | 4.8 |
| 2015-01-01_00:42:54 | 4.6 |
| 2015-01-01_00:42:55 | 4.6 |
| 2015-01-01_00:42:56 | 4.7 |
| 2015-01-01_00:42:57 | 4.4 |
| 2015-01-01_00:42:58 | 4.7 |
| 2015-01-01_00:42:59 | 4.6 |
| 2015-01-01_00:43:00 | 4.7 |
| 2015-01-01_00:43:01 | 4.7 |
| 2015-01-01_00:43:02 | 4.9 |
| 2015-01-01_00:43:03 | 1.4 |
| 2015-01-01_00:43:04 | 0 |
| 2015-01-01_00:43:05 | 0 |
| 2015-01-01_00:43:06 | 0 |
| 2015-01-01_00:43:07 | 0 |
| 2015-01-01_00:43:08 | 0 |
| 2015-01-01_00:43:09 | 0 |
| 2015-01-01_00:43:10 | 0 |
| 2015-01-01_00:43:11 | 0 |
| 2015-01-01_00:43:12 | 1 |
| 2015-01-01_00:43:13 | 1.1 |
| 2015-01-01_00:43:14 | 4.1 |
| 2015-01-01_00:43:15 | 4.5 |
| 2015-01-01_00:43:16 | 5.2 |
| 2015-01-01_00:43:17 | 5.7 |
| 2015-01-01_00:43:18 | 5.6 |
| 2015-01-01_00:43:19 | 6.1 |
| 2015-01-01_00:43:20 | 7.1 |
| 2015-01-01_00:43:21 | 8.6 |
| 2015-01-01_00:43:22 | 10.7 |
| 2015-01-01_00:43:23 | 12.6 |
| 2015-01-01_00:43:24 | 13 |
| 2015-01-01_00:43:25 | 4.7 |
| 2015-01-01_00:43:26 | 1 |
| 2015-01-01_00:43:27 | 4.8 |
| 2015-01-01_00:43:28 | 4.4 |
| 2015-01-01_00:43:29 | 6.4 |
| 2015-01-01_00:43:30 | 9.6 |
| 2015-01-01_00:43:31 | 6.7 |
| 2015-01-01_00:43:32 | 4.5 |
| 2015-01-01_00:43:33 | 4 |
| 2015-01-01_00:43:34 | 5.8 |
| 2015-01-01_00:43:35 | 6.4 |
| 2015-01-01_00:43:36 | 5.3 |
| 2015-01-01_00:43:37 | 4 |
| 2015-01-01_00:43:38 | 3 |
| 2015-01-01_00:43:39 | 0 |
| 2015-01-01_00:43:40 | 0 |
| 2015-01-01_00:43:41 | 0 |
| 2015-01-01_00:43:42 | 0 |
| 2015-01-01_00:43:43 | 0.2 |
| 2015-01-01_00:43:44 | 2.8 |
| 2015-01-01_00:43:45 | 2.8 |
| 2015-01-01_00:43:46 | 4.1 |
| 2015-01-01_00:43:47 | 5 |
| 2015-01-01_00:43:48 | 5.4 |
| 2015-01-01_00:43:49 | 5.2 |
| 2015-01-01_00:43:50 | 4.4 |
| 2015-01-01_00:43:51 | 4.5 |
| 2015-01-01_00:43:52 | 5.8 |
| 2015-01-01_00:43:53 | 5.5 |
| 2015-01-01_00:43:54 | 5.7 |
| 2015-01-01_00:43:55 | 7.2 |
| 2015-01-01_00:43:56 | 6.4 |
| 2015-01-01_00:43:57 | 6 |
| 2015-01-01_00:43:58 | 4.5 |
| 2015-01-01_00:43:59 | 4 |
| 2015-01-01_00:44:00 | 3.9 |
| 2015-01-01_00:44:01 | 3.5 |
| 2015-01-01_00:44:02 | 4.1 |
| 2015-01-01_00:44:03 | 5.8 |
| 2015-01-01_00:44:04 | 5.5 |
| 2015-01-01_00:44:05 | 5.7 |
| 2015-01-01_00:44:06 | 6.7 |
| 2015-01-01_00:44:07 | 6.8 |
| 2015-01-01_00:44:08 | 6.1 |
| 2015-01-01_00:44:09 | 5.5 |
| 2015-01-01_00:44:10 | 6 |
| 2015-01-01_00:44:11 | 0.6 |
| 2015-01-01_00:44:12 | 1 |
| 2015-01-01_00:44:13 | 3.1 |
| 2015-01-01_00:44:14 | 3.6 |
| 2015-01-01_00:44:15 | 3.5 |
| 2015-01-01_00:44:16 | 4.7 |
| 2015-01-01_00:44:17 | 4.8 |
| 2015-01-01_00:44:18 | 4.6 |
| 2015-01-01_00:44:19 | 3.6 |
| 2015-01-01_00:44:20 | 3.1 |
| 2015-01-01_00:44:21 | 4.3 |
| 2015-01-01_00:44:22 | 5 |
| 2015-01-01_00:44:23 | 5.3 |
| 2015-01-01_00:44:24 | 6.7 |
| 2015-01-01_00:44:25 | 7.4 |
| 2015-01-01_00:44:26 | 8 |
| 2015-01-01_00:44:27 | 5.1 |
| 2015-01-01_00:44:28 | 3.7 |
| 2015-01-01_00:44:29 | 2.6 |
| 2015-01-01_00:44:30 | 3.5 |
| 2015-01-01_00:44:31 | 2.2 |
| 2015-01-01_00:44:32 | 3 |
| 2015-01-01_00:44:33 | 4.5 |
| 2015-01-01_00:44:34 | 4.9 |
| 2015-01-01_00:44:35 | 4.6 |
| 2015-01-01_00:44:36 | 4.6 |
| 2015-01-01_00:44:37 | 4.1 |
| 2015-01-01_00:44:38 | 2.5 |
| 2015-01-01_00:44:39 | 1.7 |
| 2015-01-01_00:44:40 | 0 |
| 2015-01-01_00:44:41 | 0 |
| 2015-01-01_00:44:42 | 0.8 |
| 2015-01-01_00:44:43 | 1.2 |
| 2015-01-01_00:44:44 | 2.2 |
| 2015-01-01_00:44:45 | 2.7 |
| 2015-01-01_00:44:46 | 2.8 |
| 2015-01-01_00:44:47 | 4.5 |
| 2015-01-01_00:44:48 | 5.1 |
| 2015-01-01_00:44:49 | 5.2 |
| 2015-01-01_00:44:50 | 5.2 |
| 2015-01-01_00:44:51 | 4.4 |
| 2015-01-01_00:44:52 | 3.2 |
| 2015-01-01_00:44:53 | 1.5 |
| 2015-01-01_00:44:54 | 3 |
| 2015-01-01_00:44:55 | 2.9 |
| 2015-01-01_00:44:56 | 0.3 |
| 2015-01-01_00:44:57 | 0 |
| 2015-01-01_00:44:58 | 2.3 |
| 2015-01-01_00:44:59 | 3.7 |
| 2015-01-01_00:45:00 | 3.1 |
| 2015-01-01_00:45:01 | 1.4 |
| 2015-01-01_00:45:02 | 0.4 |
| 2015-01-01_00:45:03 | 2.6 |
| 2015-01-01_00:45:04 | 3.8 |
| 2015-01-01_00:45:05 | 4.2 |
| 2015-01-01_00:45:06 | 4.5 |
| 2015-01-01_00:45:07 | 3.1 |
| 2015-01-01_00:45:08 | 1 |
| 2015-01-01_00:45:09 | 0.8 |
| 2015-01-01_00:45:10 | 3.2 |
| 2015-01-01_00:45:11 | 2.8 |
| 2015-01-01_00:45:12 | 0.8 |
| 2015-01-01_00:45:13 | 1.3 |
| 2015-01-01_00:45:14 | 2.5 |
| 2015-01-01_00:45:15 | 2.7 |
| 2015-01-01_00:45:16 | 3.9 |
| 2015-01-01_00:45:17 | 4.5 |
| 2015-01-01_00:45:18 | 5.8 |
| 2015-01-01_00:45:19 | 6.3 |
| 2015-01-01_00:45:20 | 6.5 |
| 2015-01-01_00:45:21 | 4.9 |
| 2015-01-01_00:45:22 | 3.9 |
| 2015-01-01_00:45:23 | 4.1 |
| 2015-01-01_00:45:24 | 3.7 |
| 2015-01-01_00:45:25 | 3.3 |
| 2015-01-01_00:45:26 | 5.6 |
| 2015-01-01_00:45:27 | 6.9 |
| 2015-01-01_00:45:28 | 6.8 |
| 2015-01-01_00:45:29 | 4.6 |
| 2015-01-01_00:45:30 | 1.9 |
| 2015-01-01_00:45:31 | 4.5 |
| 2015-01-01_00:45:32 | 5.1 |
| 2015-01-01_00:45:33 | 3 |
| 2015-01-01_00:45:34 | 4.6 |
| 2015-01-01_00:45:35 | 4.3 |
| 2015-01-01_00:45:36 | 3.7 |
| 2015-01-01_00:45:37 | 5.3 |
| 2015-01-01_00:45:38 | 5.7 |
| 2015-01-01_00:45:39 | 5.4 |
| 2015-01-01_00:45:40 | 7.2 |
| 2015-01-01_00:45:41 | 5.6 |
| 2015-01-01_00:45:42 | 5.5 |
| 2015-01-01_00:45:43 | 5.7 |
| 2015-01-01_00:45:44 | 5 |
| 2015-01-01_00:45:45 | 5 |
| 2015-01-01_00:45:46 | 5.5 |
| 2015-01-01_00:45:47 | 5.1 |
| 2015-01-01_00:45:48 | 4.2 |
| 2015-01-01_00:45:49 | 4 |
| 2015-01-01_00:45:50 | 3.8 |
| 2015-01-01_00:45:51 | 3.6 |
| 2015-01-01_00:45:52 | 2.7 |
| 2015-01-01_00:45:53 | 3.1 |
| 2015-01-01_00:45:54 | 4.4 |
| 2015-01-01_00:45:55 | 4.8 |
| 2015-01-01_00:45:56 | 4 |
| 2015-01-01_00:45:57 | 3.5 |
| 2015-01-01_00:45:58 | 3.6 |
| 2015-01-01_00:45:59 | 4.2 |
| 2015-01-01_00:46:00 | 4.2 |
| 2015-01-01_00:46:01 | 4.3 |
| 2015-01-01_00:46:02 | 3.9 |
| 2015-01-01_00:46:03 | 4.1 |
| 2015-01-01_00:46:04 | 3.8 |
| 2015-01-01_00:46:05 | 3.9 |
| 2015-01-01_00:46:06 | 4.4 |
| 2015-01-01_00:46:07 | 4 |
| 2015-01-01_00:46:08 | 4.1 |
| 2015-01-01_00:46:09 | 3.7 |
| 2015-01-01_00:46:10 | 3.9 |
| 2015-01-01_00:46:11 | 4.1 |
| 2015-01-01_00:46:12 | 4.1 |
| 2015-01-01_00:46:13 | 4.6 |
| 2015-01-01_00:46:14 | 5.3 |
| 2015-01-01_00:46:15 | 4.8 |
| 2015-01-01_00:46:16 | 4.8 |
| 2015-01-01_00:46:17 | 4.6 |
| 2015-01-01_00:46:18 | 4.4 |
| 2015-01-01_00:46:19 | 4 |
| 2015-01-01_00:46:20 | 4.1 |
| 2015-01-01_00:46:21 | 4.5 |
| 2015-01-01_00:46:22 | 0.7 |
| 2015-01-01_00:46:23 | 0 |
| 2015-01-01_00:46:24 | 0 |
| 2015-01-01_00:46:25 | 0 |
| 2015-01-01_00:46:26 | 0 |
| 2015-01-01_00:46:27 | 0 |
| 2015-01-01_00:46:28 | 0 |
| 2015-01-01_00:46:29 | 0 |
| 2015-01-01_00:46:30 | 0 |
| 2015-01-01_00:46:31 | 0 |
| 2015-01-01_00:46:32 | 0.3 |
| 2015-01-01_00:46:33 | 0 |
| 2015-01-01_00:46:34 | 0 |
| 2015-01-01_00:46:35 | 0 |
| 2015-01-01_00:46:36 | 0 |
| 2015-01-01_00:46:37 | 0 |
| 2015-01-01_00:46:38 | 0 |
| 2015-01-01_00:46:39 | 0 |
| 2015-01-01_00:46:40 | 0 |
| 2015-01-01_00:46:41 | 0 |
| 2015-01-01_00:46:42 | 0.9 |
| 2015-01-01_00:46:43 | 0 |
| 2015-01-01_00:46:44 | 0 |
| 2015-01-01_00:46:45 | 0 |
| 2015-01-01_00:46:46 | 1.2 |
| 2015-01-01_00:46:47 | 2.9 |
| 2015-01-01_00:46:48 | 5.4 |
| 2015-01-01_00:46:49 | 8.3 |
| 2015-01-01_00:46:50 | 12.1 |
| 2015-01-01_00:46:51 | 9.6 |
| 2015-01-01_00:46:52 | 8.7 |
| 2015-01-01_00:46:53 | 9.1 |
| 2015-01-01_00:46:54 | 10.5 |
| 2015-01-01_00:46:55 | 2.2 |
| 2015-01-01_00:46:56 | 2.6 |
| 2015-01-01_00:46:57 | 3.3 |
| 2015-01-01_00:46:58 | 3.4 |
| 2015-01-01_00:46:59 | 3.8 |
| 2015-01-01_00:47:00 | 3 |
| 2015-01-01_00:47:01 | 2.5 |
| 2015-01-01_00:47:02 | 2.3 |
| 2015-01-01_00:47:03 | 0.7 |
| 2015-01-01_00:47:04 | 0 |
| 2015-01-01_00:47:05 | 0.9 |
| 2015-01-01_00:47:06 | 3.4 |
| 2015-01-01_00:47:07 | 7.4 |
| 2015-01-01_00:47:08 | 9 |
| 2015-01-01_00:47:09 | 7.1 |
| 2015-01-01_00:47:10 | 7.6 |
| 2015-01-01_00:47:11 | 7.1 |
| 2015-01-01_00:47:12 | 7.9 |
| 2015-01-01_00:47:13 | 9.6 |
| 2015-01-01_00:47:14 | 13.1 |
| 2015-01-01_00:47:15 | 12.2 |
| 2015-01-01_00:47:16 | 4.1 |
| 2015-01-01_00:47:17 | 13.4 |
| 2015-01-01_00:47:18 | 8.9 |
| 2015-01-01_00:47:19 | 1.5 |
| 2015-01-01_00:47:20 | 0 |
| 2015-01-01_00:47:21 | 1.8 |
| 2015-01-01_00:47:22 | 4.2 |
| 2015-01-01_00:47:23 | 3 |
| 2015-01-01_00:47:24 | 2.7 |
| 2015-01-01_00:47:25 | 2.8 |
| 2015-01-01_00:47:26 | 3.2 |
| 2015-01-01_00:47:27 | 3.3 |
| 2015-01-01_00:47:28 | 3.6 |
| 2015-01-01_00:47:29 | 3.5 |
| 2015-01-01_00:47:30 | 3.3 |
| 2015-01-01_00:47:31 | 2.7 |
| 2015-01-01_00:47:32 | 4.2 |
| 2015-01-01_00:47:33 | 6.4 |
| 2015-01-01_00:47:34 | 6 |
| 2015-01-01_00:47:35 | 5.8 |
| 2015-01-01_00:47:36 | 5.7 |
| 2015-01-01_00:47:37 | 6.1 |
| 2015-01-01_00:47:38 | 5.7 |
| 2015-01-01_00:47:39 | 5.5 |
| 2015-01-01_00:47:40 | 4.4 |
| 2015-01-01_00:47:41 | 2.3 |
| 2015-01-01_00:47:42 | 0 |
| 2015-01-01_00:47:43 | 0 |
| 2015-01-01_00:47:44 | 0 |
| 2015-01-01_00:47:45 | 0 |
| 2015-01-01_00:47:46 | 1.5 |
| 2015-01-01_00:47:47 | 3 |
| 2015-01-01_00:47:48 | 3.6 |
| 2015-01-01_00:47:49 | 4.3 |
| 2015-01-01_00:47:50 | 5.4 |
| 2015-01-01_00:47:51 | 4 |
| 2015-01-01_00:47:52 | 3.2 |
| 2015-01-01_00:47:53 | 1.4 |
| 2015-01-01_00:47:54 | 2.8 |
| 2015-01-01_00:47:55 | 3.1 |
| 2015-01-01_00:47:56 | 4.3 |
| 2015-01-01_00:47:57 | 3.1 |
| 2015-01-01_00:47:58 | 3.2 |
| 2015-01-01_00:47:59 | 3.5 |
| 2015-01-01_00:48:00 | 4.5 |
| 2015-01-01_00:48:01 | 4.2 |
| 2015-01-01_00:48:02 | 3.8 |
| 2015-01-01_00:48:03 | 5 |
| 2015-01-01_00:48:04 | 8.6 |
| 2015-01-01_00:48:05 | 7.4 |
| 2015-01-01_00:48:06 | 3.9 |
| 2015-01-01_00:48:07 | 2.7 |
| 2015-01-01_00:48:08 | 4.8 |
| 2015-01-01_00:48:09 | 4 |
| 2015-01-01_00:48:10 | 3.2 |
| 2015-01-01_00:48:11 | 2.7 |
| 2015-01-01_00:48:12 | 2.5 |
| 2015-01-01_00:48:13 | 3.3 |
| 2015-01-01_00:48:14 | 6.3 |
| 2015-01-01_00:48:15 | 3.4 |
| 2015-01-01_00:48:16 | 2.7 |
| 2015-01-01_00:48:17 | 4.3 |
| 2015-01-01_00:48:18 | 9.6 |
| 2015-01-01_00:48:19 | 3.8 |
| 2015-01-01_00:48:20 | 3.1 |
| 2015-01-01_00:48:21 | 1.5 |
| 2015-01-01_00:48:22 | 1.4 |
| 2015-01-01_00:48:23 | 3.6 |
| 2015-01-01_00:48:24 | 2.9 |
| 2015-01-01_00:48:25 | 2.5 |
| 2015-01-01_00:48:26 | 3.8 |
| 2015-01-01_00:48:27 | 3.2 |
| 2015-01-01_00:48:28 | 3.7 |
| 2015-01-01_00:48:29 | 2.7 |
| 2015-01-01_00:48:30 | 2.5 |
| 2015-01-01_00:48:31 | 2.8 |
| 2015-01-01_00:48:32 | 3 |
| 2015-01-01_00:48:33 | 3.4 |
| 2015-01-01_00:48:34 | 5.2 |
| 2015-01-01_00:48:35 | 6.4 |
| 2015-01-01_00:48:36 | 3.3 |
| 2015-01-01_00:48:37 | 1.6 |
| 2015-01-01_00:48:38 | 4.8 |
| 2015-01-01_00:48:39 | 9 |
| 2015-01-01_00:48:40 | 7.6 |
| 2015-01-01_00:48:41 | 9.9 |
| 2015-01-01_00:48:42 | 3.7 |
| 2015-01-01_00:48:43 | 2.6 |
| 2015-01-01_00:48:44 | 5.2 |
| 2015-01-01_00:48:45 | 10.4 |
| 2015-01-01_00:48:46 | 8.7 |
| 2015-01-01_00:48:47 | 6.4 |
| 2015-01-01_00:48:48 | 7.5 |
| 2015-01-01_00:48:49 | 8.1 |
| 2015-01-01_00:48:50 | 7.2 |
| 2015-01-01_00:48:51 | 7.8 |
| 2015-01-01_00:48:52 | 6.3 |
| 2015-01-01_00:48:53 | 3.7 |
| 2015-01-01_00:48:54 | 0 |
| 2015-01-01_00:48:55 | 1.8 |
| 2015-01-01_00:48:56 | 3.5 |
| 2015-01-01_00:48:57 | 5.1 |
| 2015-01-01_00:48:58 | 5.8 |
| 2015-01-01_00:48:59 | 3.8 |
| 2015-01-01_00:49:00 | 2.2 |
| 2015-01-01_00:49:01 | 4.3 |
| 2015-01-01_00:49:02 | 4.6 |
| 2015-01-01_00:49:03 | 4.7 |
| 2015-01-01_00:49:04 | 5.2 |
| 2015-01-01_00:49:05 | 5.6 |
| 2015-01-01_00:49:06 | 5.8 |
| 2015-01-01_00:49:07 | 5.3 |
| 2015-01-01_00:49:08 | 7 |
| 2015-01-01_00:49:09 | 8.2 |
| 2015-01-01_00:49:10 | 5.3 |
| 2015-01-01_00:49:11 | 6.2 |
| 2015-01-01_00:49:12 | 6.6 |
| 2015-01-01_00:49:13 | 2.7 |
| 2015-01-01_00:49:14 | 2.7 |
| 2015-01-01_00:49:15 | 4.5 |
| 2015-01-01_00:49:16 | 4.3 |
| 2015-01-01_00:49:17 | 5.4 |
| 2015-01-01_00:49:18 | 4 |
| 2015-01-01_00:49:19 | 3.1 |
| 2015-01-01_00:49:20 | 2.7 |
| 2015-01-01_00:49:21 | 2.2 |
| 2015-01-01_00:49:22 | 2.8 |
| 2015-01-01_00:49:23 | 3.4 |
| 2015-01-01_00:49:24 | 0.6 |
| 2015-01-01_00:49:25 | 0 |
| 2015-01-01_00:49:26 | 1.2 |
| 2015-01-01_00:49:27 | 2.7 |
| 2015-01-01_00:49:28 | 2.8 |
| 2015-01-01_00:49:29 | 3.5 |
| 2015-01-01_00:49:30 | 4.3 |
| 2015-01-01_00:49:31 | 4.8 |
| 2015-01-01_00:49:32 | 5 |
| 2015-01-01_00:49:33 | 4.7 |
| 2015-01-01_00:49:34 | 3.4 |
| 2015-01-01_00:49:35 | 3.1 |
| 2015-01-01_00:49:36 | 3.1 |
| 2015-01-01_00:49:37 | 3.8 |
| 2015-01-01_00:49:38 | 4.1 |
| 2015-01-01_00:49:39 | 4.2 |
| 2015-01-01_00:49:40 | 4.7 |
| 2015-01-01_00:49:41 | 4.6 |
| 2015-01-01_00:49:42 | 4.7 |
| 2015-01-01_00:49:43 | 4.8 |
| 2015-01-01_00:49:44 | 4.2 |
| 2015-01-01_00:49:45 | 4.8 |
| 2015-01-01_00:49:46 | 4.6 |
| 2015-01-01_00:49:47 | 4.9 |
| 2015-01-01_00:49:48 | 4.4 |
| 2015-01-01_00:49:49 | 5 |
| 2015-01-01_00:49:50 | 4.9 |
| 2015-01-01_00:49:51 | 4.8 |
| 2015-01-01_00:49:52 | 0.8 |
| 2015-01-01_00:49:53 | 0 |
| 2015-01-01_00:49:54 | 0 |
| 2015-01-01_00:49:55 | 0 |
| 2015-01-01_00:49:56 | 0.7 |
| 2015-01-01_00:49:57 | 2.3 |
| 2015-01-01_00:49:58 | 3.2 |
| 2015-01-01_00:49:59 | 3.1 |
| 2015-01-01_00:50:00 | 2.7 |
| 2015-01-01_00:50:01 | 2.6 |
| 2015-01-01_00:50:02 | 3.5 |
| 2015-01-01_00:50:03 | 4.6 |
| 2015-01-01_00:50:04 | 4.9 |
| 2015-01-01_00:50:05 | 1.3 |
| 2015-01-01_00:50:06 | 1.4 |
| 2015-01-01_00:50:07 | 2.5 |
| 2015-01-01_00:50:08 | 3.4 |
| 2015-01-01_00:50:09 | 5.9 |
| 2015-01-01_00:50:10 | 7.9 |
| 2015-01-01_00:50:11 | 4.5 |
| 2015-01-01_00:50:12 | 2 |
| 2015-01-01_00:50:13 | 2.3 |
| 2015-01-01_00:50:14 | 2.8 |
| 2015-01-01_00:50:15 | 4.6 |
| 2015-01-01_00:50:16 | 3.4 |
| 2015-01-01_00:50:17 | 3.6 |
| 2015-01-01_00:50:18 | 2.7 |
| 2015-01-01_00:50:19 | 1.5 |
| 2015-01-01_00:50:20 | 1.6 |
| 2015-01-01_00:50:21 | 3 |
| 2015-01-01_00:50:22 | 3.4 |
| 2015-01-01_00:50:23 | 4.4 |
| 2015-01-01_00:50:24 | 3.6 |
| 2015-01-01_00:50:25 | 2 |
| 2015-01-01_00:50:26 | 1.9 |
| 2015-01-01_00:50:27 | 2.2 |
| 2015-01-01_00:50:28 | 3.8 |
| 2015-01-01_00:50:29 | 7 |
| 2015-01-01_00:50:30 | 7.2 |
| 2015-01-01_00:50:31 | 4.7 |
| 2015-01-01_00:50:32 | 2.4 |
| 2015-01-01_00:50:33 | 2.8 |
| 2015-01-01_00:50:34 | 2.4 |
| 2015-01-01_00:50:35 | 2.7 |
| 2015-01-01_00:50:36 | 3.8 |
| 2015-01-01_00:50:37 | 3.9 |
| 2015-01-01_00:50:38 | 2.5 |
| 2015-01-01_00:50:39 | 2.2 |
| 2015-01-01_00:50:40 | 2.7 |
| 2015-01-01_00:50:41 | 3.7 |
| 2015-01-01_00:50:42 | 4.2 |
| 2015-01-01_00:50:43 | 4.6 |
| 2015-01-01_00:50:44 | 3.5 |
| 2015-01-01_00:50:45 | 3.2 |
| 2015-01-01_00:50:46 | 3.5 |
| 2015-01-01_00:50:47 | 2.7 |
| 2015-01-01_00:50:48 | 1.8 |
| 2015-01-01_00:50:49 | 2.2 |
| 2015-01-01_00:50:50 | 3.2 |
| 2015-01-01_00:50:51 | 2.3 |
| 2015-01-01_00:50:52 | 4.1 |
| 2015-01-01_00:50:53 | 6.5 |
| 2015-01-01_00:50:54 | 6.5 |
| 2015-01-01_00:50:55 | 5.2 |
| 2015-01-01_00:50:56 | 3.6 |
| 2015-01-01_00:50:57 | 2.8 |
| 2015-01-01_00:50:58 | 2.8 |
| 2015-01-01_00:50:59 | 5.1 |
| 2015-01-01_00:51:00 | 6.9 |
| 2015-01-01_00:51:01 | 7.5 |
| 2015-01-01_00:51:02 | 7.8 |
| 2015-01-01_00:51:03 | 8 |
| 2015-01-01_00:51:04 | 7.7 |
| 2015-01-01_00:51:05 | 8 |
| 2015-01-01_00:51:06 | 9.3 |
| 2015-01-01_00:51:07 | 2 |
| 2015-01-01_00:51:08 | 3.5 |
| 2015-01-01_00:51:09 | 2.8 |
| 2015-01-01_00:51:10 | 2.7 |
| 2015-01-01_00:51:11 | 2.8 |
| 2015-01-01_00:51:12 | 2.3 |
| 2015-01-01_00:51:13 | 2.2 |
| 2015-01-01_00:51:14 | 2 |
| 2015-01-01_00:51:15 | 2.3 |
| 2015-01-01_00:51:16 | 2.2 |
| 2015-01-01_00:51:17 | 3.2 |
| 2015-01-01_00:51:18 | 3 |
| 2015-01-01_00:51:19 | 1.4 |
| 2015-01-01_00:51:20 | 0 |
| 2015-01-01_00:51:21 | 0 |
| 2015-01-01_00:51:22 | 2.5 |
| 2015-01-01_00:51:23 | 0.1 |
| 2015-01-01_00:51:24 | 1.7 |
| 2015-01-01_00:51:25 | 3.2 |
| 2015-01-01_00:51:26 | 4.5 |
| 2015-01-01_00:51:27 | 8.2 |
| 2015-01-01_00:51:28 | 9 |
| 2015-01-01_00:51:29 | 6.1 |
| 2015-01-01_00:51:30 | 6.3 |
| 2015-01-01_00:51:31 | 6.5 |
| 2015-01-01_00:51:32 | 8 |
| 2015-01-01_00:51:33 | 1.4 |
| 2015-01-01_00:51:34 | 2.4 |
| 2015-01-01_00:51:35 | 0.8 |
| 2015-01-01_00:51:36 | 0 |
| 2015-01-01_00:51:37 | 0.1 |
| 2015-01-01_00:51:38 | 2.1 |
| 2015-01-01_00:51:39 | 2.1 |
| 2015-01-01_00:51:40 | 2.4 |
| 2015-01-01_00:51:41 | 4.5 |
| 2015-01-01_00:51:42 | 2.1 |
| 2015-01-01_00:51:43 | 3.4 |
| 2015-01-01_00:51:44 | 6.5 |
| 2015-01-01_00:51:45 | 5.2 |
| 2015-01-01_00:51:46 | 4.5 |
| 2015-01-01_00:51:47 | 4.2 |
| 2015-01-01_00:51:48 | 5.7 |
| 2015-01-01_00:51:49 | 5.4 |
| 2015-01-01_00:51:50 | 3.5 |
| 2015-01-01_00:51:51 | 0.3 |
| 2015-01-01_00:51:52 | 1.8 |
| 2015-01-01_00:51:53 | 7 |
| 2015-01-01_00:51:54 | 6.8 |
| 2015-01-01_00:51:55 | 6.2 |
| 2015-01-01_00:51:56 | 7.4 |
| 2015-01-01_00:51:57 | 6.8 |
| 2015-01-01_00:51:58 | 4.5 |
| 2015-01-01_00:51:59 | 4 |
| 2015-01-01_00:52:00 | 0.7 |
| 2015-01-01_00:52:01 | 1.7 |
| 2015-01-01_00:52:02 | 3.9 |
| 2015-01-01_00:52:03 | 5.8 |
| 2015-01-01_00:52:04 | 6.1 |
| 2015-01-01_00:52:05 | 5.8 |
| 2015-01-01_00:52:06 | 6.2 |
| 2015-01-01_00:52:07 | 6.9 |
| 2015-01-01_00:52:08 | 5.3 |
| 2015-01-01_00:52:09 | 3.4 |
| 2015-01-01_00:52:10 | 4.9 |
| 2015-01-01_00:52:11 | 10.1 |
| 2015-01-01_00:52:12 | 10 |
| 2015-01-01_00:52:13 | 7 |
| 2015-01-01_00:52:14 | 6.4 |
| 2015-01-01_00:52:15 | 12.4 |
| 2015-01-01_00:52:16 | 19 |
| 2015-01-01_00:52:17 | 18.4 |
| 2015-01-01_00:52:18 | 17.7 |
| 2015-01-01_00:52:19 | 18.1 |
| 2015-01-01_00:52:20 | 11 |
| 2015-01-01_00:52:21 | 0 |
| 2015-01-01_00:52:22 | 0 |
| 2015-01-01_00:52:23 | 0 |
| 2015-01-01_00:52:24 | 0 |
| 2015-01-01_00:52:25 | 0 |
| 2015-01-01_00:52:26 | 3.2 |
| 2015-01-01_00:52:27 | 5.9 |
| 2015-01-01_00:52:28 | 6.2 |
| 2015-01-01_00:52:29 | 5.2 |
| 2015-01-01_00:52:30 | 3.6 |
| 2015-01-01_00:52:31 | 3.4 |
| 2015-01-01_00:52:32 | 5.3 |
| 2015-01-01_00:52:33 | 3.3 |
| 2015-01-01_00:52:34 | 3.7 |
| 2015-01-01_00:52:35 | 4.8 |
| 2015-01-01_00:52:36 | 5.2 |
| 2015-01-01_00:52:37 | 2.8 |
| 2015-01-01_00:52:38 | 2 |
| 2015-01-01_00:52:39 | 1.9 |
| 2015-01-01_00:52:40 | 0.8 |
| 2015-01-01_00:52:41 | 3.3 |
| 2015-01-01_00:52:42 | 2.5 |
| 2015-01-01_00:52:43 | 2.7 |
| 2015-01-01_00:52:44 | 3.6 |
| 2015-01-01_00:52:45 | 4.9 |
| 2015-01-01_00:52:46 | 5.3 |
| 2015-01-01_00:52:47 | 2.2 |
| 2015-01-01_00:52:48 | 0.2 |
| 2015-01-01_00:52:49 | 2.1 |
| 2015-01-01_00:52:50 | 5.2 |
| 2015-01-01_00:52:51 | 6.5 |
| 2015-01-01_00:52:52 | 8.6 |
| 2015-01-01_00:52:53 | 13.5 |
| 2015-01-01_00:52:54 | 13.1 |
| 2015-01-01_00:52:55 | 12.2 |
| 2015-01-01_00:52:56 | 2.1 |
| 2015-01-01_00:52:57 | 3.5 |
| 2015-01-01_00:52:58 | 3.2 |
| 2015-01-01_00:52:59 | 5.1 |
| 2015-01-01_00:53:00 | 4.9 |
| 2015-01-01_00:53:01 | 3.8 |
| 2015-01-01_00:53:02 | 3 |
| 2015-01-01_00:53:03 | 2.5 |
| 2015-01-01_00:53:04 | 2.6 |
| 2015-01-01_00:53:05 | 2.3 |
| 2015-01-01_00:53:06 | 2 |
| 2015-01-01_00:53:07 | 2.4 |
| 2015-01-01_00:53:08 | 2 |
| 2015-01-01_00:53:09 | 2 |
| 2015-01-01_00:53:10 | 2.1 |
| 2015-01-01_00:53:11 | 3.2 |
| 2015-01-01_00:53:12 | 5.1 |
| 2015-01-01_00:53:13 | 2.8 |
| 2015-01-01_00:53:14 | 2.6 |
| 2015-01-01_00:53:15 | 2.5 |
| 2015-01-01_00:53:16 | 2.6 |
| 2015-01-01_00:53:17 | 3.3 |
| 2015-01-01_00:53:18 | 4 |
| 2015-01-01_00:53:19 | 4.9 |
| 2015-01-01_00:53:20 | 4.9 |
| 2015-01-01_00:53:21 | 3.8 |
| 2015-01-01_00:53:22 | 4.2 |
| 2015-01-01_00:53:23 | 5.2 |
| 2015-01-01_00:53:24 | 4.3 |
| 2015-01-01_00:53:25 | 3.5 |
| 2015-01-01_00:53:26 | 3 |
| 2015-01-01_00:53:27 | 5.2 |
| 2015-01-01_00:53:28 | 3.6 |
| 2015-01-01_00:53:29 | 2.7 |
| 2015-01-01_00:53:30 | 2.8 |
| 2015-01-01_00:53:31 | 3.8 |
| 2015-01-01_00:53:32 | 3.6 |
| 2015-01-01_00:53:33 | 2.4 |
| 2015-01-01_00:53:34 | 2.9 |
| 2015-01-01_00:53:35 | 4.3 |
| 2015-01-01_00:53:36 | 4.7 |
| 2015-01-01_00:53:37 | 3.7 |
| 2015-01-01_00:53:38 | 4 |
| 2015-01-01_00:53:39 | 4 |
| 2015-01-01_00:53:40 | 3.5 |
| 2015-01-01_00:53:41 | 3.7 |
| 2015-01-01_00:53:42 | 2.9 |
| 2015-01-01_00:53:43 | 2.5 |
| 2015-01-01_00:53:44 | 1.3 |
| 2015-01-01_00:53:45 | 0 |
| 2015-01-01_00:53:46 | 0 |
| 2015-01-01_00:53:47 | 0 |
| 2015-01-01_00:53:48 | 0 |
| 2015-01-01_00:53:49 | 0.9 |
| 2015-01-01_00:53:50 | 1.5 |
| 2015-01-01_00:53:51 | 1.8 |
| 2015-01-01_00:53:52 | 1.6 |
| 2015-01-01_00:53:53 | 1.9 |
| 2015-01-01_00:53:54 | 2.4 |
| 2015-01-01_00:53:55 | 2.3 |
| 2015-01-01_00:53:56 | 2.4 |
| 2015-01-01_00:53:57 | 2.7 |
| 2015-01-01_00:53:58 | 3.2 |
| 2015-01-01_00:53:59 | 2.8 |
| 2015-01-01_00:54:00 | 2.9 |
| 2015-01-01_00:54:01 | 3 |
| 2015-01-01_00:54:02 | 3.1 |
| 2015-01-01_00:54:03 | 3.8 |
| 2015-01-01_00:54:04 | 3.3 |
| 2015-01-01_00:54:05 | 4 |
| 2015-01-01_00:54:06 | 5.2 |
| 2015-01-01_00:54:07 | 0.7 |
| 2015-01-01_00:54:08 | 0.6 |
| 2015-01-01_00:54:09 | 0.6 |
| 2015-01-01_00:54:10 | 0.7 |
| 2015-01-01_00:54:11 | 0.6 |
| 2015-01-01_00:54:12 | 0.7 |
| 2015-01-01_00:54:13 | 0.7 |
| 2015-01-01_00:54:14 | 0.6 |
| 2015-01-01_00:54:15 | 0.8 |
| 2015-01-01_00:54:16 | 0.6 |
| 2015-01-01_00:54:17 | 0.6 |
| 2015-01-01_00:54:18 | 0.7 |
| 2015-01-01_00:54:19 | 0.6 |
| 2015-01-01_00:54:20 | 0.7 |
| 2015-01-01_00:54:21 | 0.7 |
| 2015-01-01_00:54:22 | 0.6 |
| 2015-01-01_00:54:23 | 0.7 |
| 2015-01-01_00:54:24 | 0.8 |
| 2015-01-01_00:54:25 | 0.8 |
| 2015-01-01_00:54:26 | 0.9 |
| 2015-01-01_00:54:27 | 0.8 |
| 2015-01-01_00:54:28 | 0.6 |
| 2015-01-01_00:54:29 | 0.6 |
| 2015-01-01_00:54:30 | 0.7 |
| 2015-01-01_00:54:31 | 0.7 |
| 2015-01-01_00:54:32 | 0.7 |
| 2015-01-01_00:54:33 | 0.7 |
| 2015-01-01_00:54:34 | 0.7 |
| 2015-01-01_00:54:35 | 0.7 |
| 2015-01-01_00:54:36 | 0.7 |
| 2015-01-01_00:54:37 | 0.7 |
| 2015-01-01_00:54:38 | 0.7 |
| 2015-01-01_00:54:39 | 0.7 |
| 2015-01-01_00:54:40 | 0.7 |
| 2015-01-01_00:54:41 | 0.7 |
| 2015-01-01_00:54:42 | 0.6 |
| 2015-01-01_00:54:43 | 0.7 |
| 2015-01-01_00:54:44 | 0.6 |
| 2015-01-01_00:54:45 | 0.7 |
| 2015-01-01_00:54:46 | 0.6 |
| 2015-01-01_00:54:47 | 0.6 |
| 2015-01-01_00:54:48 | 0.7 |
| 2015-01-01_00:54:49 | 0.6 |
| 2015-01-01_00:54:50 | 0.7 |
| 2015-01-01_00:54:51 | 0.6 |
| 2015-01-01_00:54:52 | 0.6 |
| 2015-01-01_00:54:53 | 0.6 |
| 2015-01-01_00:54:54 | 0.6 |
| 2015-01-01_00:54:55 | 0.7 |
| 2015-01-01_00:54:56 | 0.7 |
| 2015-01-01_00:54:57 | 0.6 |
| 2015-01-01_00:54:58 | 0.6 |
| 2015-01-01_00:54:59 | 0.6 |
| 2015-01-01_00:55:00 | 0.7 |
| 2015-01-01_00:55:01 | 0.7 |
| 2015-01-01_00:55:02 | 0.7 |
| 2015-01-01_00:55:03 | 0.7 |
| 2015-01-01_00:55:04 | 0.6 |
| 2015-01-01_00:55:05 | 0.7 |
| 2015-01-01_00:55:06 | 0.7 |
| 2015-01-01_00:55:07 | 0.7 |
| 2015-01-01_00:55:08 | 0.7 |
| 2015-01-01_00:55:09 | 0.6 |
| 2015-01-01_00:55:10 | 0.7 |
| 2015-01-01_00:55:11 | 0.8 |
| 2015-01-01_00:55:12 | 0.8 |
| 2015-01-01_00:55:13 | 0.8 |
| 2015-01-01_00:55:14 | 16.2 |
| 2015-01-01_00:55:15 | 15 |
| 2015-01-01_00:55:16 | 4.6 |
| 2015-01-01_00:55:17 | 5.5 |
| 2015-01-01_00:55:18 | 7.7 |
| 2015-01-01_00:55:19 | 8.5 |
| 2015-01-01_00:55:20 | 7.5 |
| 2015-01-01_00:55:21 | 4.8 |
| 2015-01-01_00:55:22 | 4.6 |
| 2015-01-01_00:55:23 | 5.7 |
| 2015-01-01_00:55:24 | 5 |
| 2015-01-01_00:55:25 | 5.5 |
| 2015-01-01_00:55:26 | 5.7 |
| 2015-01-01_00:55:27 | 5.4 |
| 2015-01-01_00:55:28 | 5.7 |
| 2015-01-01_00:55:29 | 5.1 |
| 2015-01-01_00:55:30 | 5.8 |
| 2015-01-01_00:55:31 | 4.3 |
| 2015-01-01_00:55:32 | 0.6 |
| 2015-01-01_00:55:33 | 0.6 |
| 2015-01-01_00:55:34 | 0.6 |
| 2015-01-01_00:55:35 | 0.7 |
| 2015-01-01_00:55:36 | 0.6 |
| 2015-01-01_00:55:37 | 0.6 |
| 2015-01-01_00:55:38 | 0.6 |
| 2015-01-01_00:55:39 | 0.6 |
| 2015-01-01_00:55:40 | 0.8 |
| 2015-01-01_00:55:41 | 0.6 |
| 2015-01-01_00:55:42 | 0.6 |
| 2015-01-01_00:55:43 | 0.6 |
| 2015-01-01_00:55:44 | 0.7 |
| 2015-01-01_00:55:45 | 0.7 |
| 2015-01-01_00:55:46 | 0.6 |
| 2015-01-01_00:55:47 | 0.7 |
| 2015-01-01_00:55:48 | 0.7 |
| 2015-01-01_00:55:49 | 0.7 |
| 2015-01-01_00:55:50 | 0.7 |
| 2015-01-01_00:55:51 | 0.7 |
| 2015-01-01_00:55:52 | 0.6 |
| 2015-01-01_00:55:53 | 0.7 |
| 2015-01-01_00:55:54 | 0.7 |
| 2015-01-01_00:55:55 | 0.6 |
| 2015-01-01_00:55:56 | 0.7 |
| 2015-01-01_00:55:57 | 0.6 |
| 2015-01-01_00:55:58 | 0.6 |
| 2015-01-01_00:55:59 | 0.7 |
| 2015-01-01_00:56:00 | 0.6 |
| 2015-01-01_00:56:01 | 0.6 |
| 2015-01-01_00:56:02 | 0.7 |
| 2015-01-01_00:56:03 | 0.8 |
| 2015-01-01_00:56:04 | 0.9 |
| 2015-01-01_00:56:05 | 0.9 |
| 2015-01-01_00:56:06 | 0.6 |
| 2015-01-01_00:56:07 | 0.6 |
| 2015-01-01_00:56:08 | 0.7 |
| 2015-01-01_00:56:09 | 0.7 |
| 2015-01-01_00:56:10 | 0.7 |
| 2015-01-01_00:56:11 | 0.9 |
| 2015-01-01_00:56:12 | 14.2 |
| 2015-01-01_00:56:13 | 10.7 |
| 2015-01-01_00:56:14 | 4.2 |
| 2015-01-01_00:56:15 | 4.6 |
| 2015-01-01_00:56:16 | 6.7 |
| 2015-01-01_00:56:17 | 5.9 |
| 2015-01-01_00:56:18 | 5.9 |
| 2015-01-01_00:56:19 | 6.3 |
| 2015-01-01_00:56:20 | 5.1 |
| 2015-01-01_00:56:21 | 6.5 |
| 2015-01-01_00:56:22 | 5.3 |
| 2015-01-01_00:56:23 | 4.9 |
| 2015-01-01_00:56:24 | 2.9 |
| 2015-01-01_00:56:25 | 5.2 |
| 2015-01-01_00:56:26 | 6.2 |
| 2015-01-01_00:56:27 | 5.6 |
| 2015-01-01_00:56:28 | 6.1 |
| 2015-01-01_00:56:29 | 5.9 |
| 2015-01-01_00:56:30 | 0.6 |
| 2015-01-01_00:56:31 | 6.2 |
| 2015-01-01_00:56:32 | 0.6 |
| 2015-01-01_00:56:33 | 0.7 |
| 2015-01-01_00:56:34 | 6.3 |
| 2015-01-01_00:56:35 | 0.6 |
| 2015-01-01_00:56:36 | 6.1 |
| 2015-01-01_00:56:37 | 6.8 |
| 2015-01-01_00:56:38 | 0.7 |
| 2015-01-01_00:56:39 | 0.7 |
| 2015-01-01_00:56:40 | 0.7 |
| 2015-01-01_00:56:41 | 0.6 |
| 2015-01-01_00:56:42 | 0.7 |
| 2015-01-01_00:56:43 | 0.7 |
| 2015-01-01_00:56:44 | 0.6 |
| 2015-01-01_00:56:45 | 0.7 |
| 2015-01-01_00:56:46 | 0.6 |
| 2015-01-01_00:56:47 | 0.6 |
| 2015-01-01_00:56:48 | 0.6 |
| 2015-01-01_00:56:49 | 0.7 |
| 2015-01-01_00:56:50 | 0.7 |
| 2015-01-01_00:56:51 | 0.7 |
| 2015-01-01_00:56:52 | 0.6 |
| 2015-01-01_00:56:53 | 0.7 |
| 2015-01-01_00:56:54 | 0.6 |
| 2015-01-01_00:56:55 | 0.8 |
| 2015-01-01_00:56:56 | 0.7 |
| 2015-01-01_00:56:57 | 0.6 |
| 2015-01-01_00:56:58 | 0.7 |
| 2015-01-01_00:56:59 | 0.6 |
| 2015-01-01_00:57:00 | 0.7 |
| 2015-01-01_00:57:01 | 0.7 |
| 2015-01-01_00:57:02 | 0.6 |
| 2015-01-01_00:57:03 | 0.6 |
| 2015-01-01_00:57:04 | 0.6 |
| 2015-01-01_00:57:05 | 0.6 |
| 2015-01-01_00:57:06 | 0.7 |
| 2015-01-01_00:57:07 | 0.7 |
| 2015-01-01_00:57:08 | 0.6 |
| 2015-01-01_00:57:09 | 0.6 |
| 2015-01-01_00:57:10 | 0.6 |
| 2015-01-01_00:57:11 | 0.6 |
| 2015-01-01_00:57:12 | 0.6 |
| 2015-01-01_00:57:13 | 6.5 |
| 2015-01-01_00:57:14 | 5.2 |
| 2015-01-01_00:57:15 | 6.2 |
| 2015-01-01_00:57:16 | 0.7 |
| 2015-01-01_00:57:17 | 0.7 |
| 2015-01-01_00:57:18 | 0.8 |
| 2015-01-01_00:57:19 | 0.6 |
| 2015-01-01_00:57:20 | 0.6 |
| 2015-01-01_00:57:21 | 0.7 |
| 2015-01-01_00:57:22 | 0.6 |
| 2015-01-01_00:57:23 | 0.7 |
| 2015-01-01_00:57:24 | 0.7 |
| 2015-01-01_00:57:25 | 0.6 |
| 2015-01-01_00:57:26 | 0.6 |
| 2015-01-01_00:57:27 | 0.6 |
| 2015-01-01_00:57:28 | 0.7 |
| 2015-01-01_00:57:29 | 0.8 |
| 2015-01-01_00:57:30 | 0.7 |
| 2015-01-01_00:57:31 | 0.7 |
| 2015-01-01_00:57:32 | 0.7 |
| 2015-01-01_00:57:33 | 0.6 |
| 2015-01-01_00:57:34 | 0.7 |
| 2015-01-01_00:57:35 | 0.6 |
| 2015-01-01_00:57:36 | 0.7 |
| 2015-01-01_00:57:37 | 0.6 |
| 2015-01-01_00:57:38 | 0.6 |
| 2015-01-01_00:57:39 | 0.6 |
| 2015-01-01_00:57:40 | 0.6 |
| 2015-01-01_00:57:41 | 0.8 |
| 2015-01-01_00:57:42 | 0.6 |
| 2015-01-01_00:57:43 | 0.7 |
| 2015-01-01_00:57:44 | 0.7 |
| 2015-01-01_00:57:45 | 0.6 |
| 2015-01-01_00:57:46 | 0.6 |
| 2015-01-01_00:57:47 | 0.7 |
| 2015-01-01_00:57:48 | 0.6 |
| 2015-01-01_00:57:49 | 0.7 |
| 2015-01-01_00:57:50 | 0.7 |
| 2015-01-01_00:57:51 | 0.6 |
| 2015-01-01_00:57:52 | 0.8 |
| 2015-01-01_00:57:53 | 0.7 |
| 2015-01-01_00:57:54 | 0.7 |
| 2015-01-01_00:57:55 | 0.9 |
| 2015-01-01_00:57:56 | 0.6 |
| 2015-01-01_00:57:57 | 0.6 |
| 2015-01-01_00:57:58 | 0.8 |
| 2015-01-01_00:57:59 | 15.6 |
| 2015-01-01_00:58:00 | 5.9 |
| 2015-01-01_00:58:01 | 5.7 |
| 2015-01-01_00:58:02 | 5.6 |
| 2015-01-01_00:58:03 | 5.2 |
| 2015-01-01_00:58:04 | 5.1 |
| 2015-01-01_00:58:05 | 5.2 |
| 2015-01-01_00:58:06 | 4.9 |
| 2015-01-01_00:58:07 | 5.3 |
| 2015-01-01_00:58:08 | 4.8 |
| 2015-01-01_00:58:09 | 4.9 |
| 2015-01-01_00:58:10 | 4.8 |
| 2015-01-01_00:58:11 | 4.9 |
| 2015-01-01_00:58:12 | 5.7 |
| 2015-01-01_00:58:13 | 6.9 |
| 2015-01-01_00:58:14 | 0.7 |
| 2015-01-01_00:58:15 | 0.7 |
| 2015-01-01_00:58:16 | 0.6 |
| 2015-01-01_00:58:17 | 0.7 |
| 2015-01-01_00:58:18 | 0.6 |
| 2015-01-01_00:58:19 | 0.7 |
| 2015-01-01_00:58:20 | 0.7 |
| 2015-01-01_00:58:21 | 0.6 |
| 2015-01-01_00:58:22 | 0.7 |
| 2015-01-01_00:58:23 | 0.6 |
| 2015-01-01_00:58:24 | 0.6 |
| 2015-01-01_00:58:25 | 0.7 |
| 2015-01-01_00:58:26 | 0.6 |
| 2015-01-01_00:58:27 | 0.6 |
| 2015-01-01_00:58:28 | 0.7 |
| 2015-01-01_00:58:29 | 0.6 |
| 2015-01-01_00:58:30 | 0.7 |
| 2015-01-01_00:58:31 | 0.6 |
| 2015-01-01_00:58:32 | 0.6 |
| 2015-01-01_00:58:33 | 0.6 |
| 2015-01-01_00:58:34 | 0.6 |
| 2015-01-01_00:58:35 | 0.6 |
| 2015-01-01_00:58:36 | 0.6 |
| 2015-01-01_00:58:37 | 0.6 |
| 2015-01-01_00:58:38 | 0.6 |
| 2015-01-01_00:58:39 | 0.7 |
| 2015-01-01_00:58:40 | 0.6 |
| 2015-01-01_00:58:41 | 0.7 |
| 2015-01-01_00:58:42 | 0.7 |
| 2015-01-01_00:58:43 | 0.7 |
| 2015-01-01_00:58:44 | 6.9 |
| 2015-01-01_00:58:45 | 6.1 |
| 2015-01-01_00:58:46 | 6 |
| 2015-01-01_00:58:47 | 5.9 |
| 2015-01-01_00:58:48 | 5.7 |
| 2015-01-01_00:58:49 | 5.6 |
| 2015-01-01_00:58:50 | 7 |
| 2015-01-01_00:58:51 | 5.2 |
| 2015-01-01_00:58:52 | 6 |
| 2015-01-01_00:58:53 | 0.7 |
| 2015-01-01_00:58:54 | 0.7 |
| 2015-01-01_00:58:55 | 0.6 |
| 2015-01-01_00:58:56 | 0.6 |
| 2015-01-01_00:58:57 | 0.7 |
| 2015-01-01_00:58:58 | 0.6 |
| 2015-01-01_00:58:59 | 0.7 |
| 2015-01-01_00:59:00 | 0.7 |
| 2015-01-01_00:59:01 | 0.7 |
| 2015-01-01_00:59:02 | 0.6 |
| 2015-01-01_00:59:03 | 0.6 |
| 2015-01-01_00:59:04 | 0.7 |
| 2015-01-01_00:59:05 | 0.7 |
| 2015-01-01_00:59:06 | 0.7 |
| 2015-01-01_00:59:07 | 0.7 |
| 2015-01-01_00:59:08 | 0.6 |
| 2015-01-01_00:59:09 | 0.6 |
| 2015-01-01_00:59:10 | 0.6 |
| 2015-01-01_00:59:11 | 0.6 |
| 2015-01-01_00:59:12 | 0.6 |
| 2015-01-01_00:59:13 | 0.8 |
| 2015-01-01_00:59:14 | 0.7 |
| 2015-01-01_00:59:15 | 0.7 |
| 2015-01-01_00:59:16 | 0.7 |
| 2015-01-01_00:59:17 | 0.7 |
| 2015-01-01_00:59:18 | 0.7 |
| 2015-01-01_00:59:19 | 0.7 |
| 2015-01-01_00:59:20 | 0.6 |
| 2015-01-01_00:59:21 | 0.6 |
| 2015-01-01_00:59:22 | 0.7 |
| 2015-01-01_00:59:23 | 0.6 |
| 2015-01-01_00:59:24 | 0.7 |
| 2015-01-01_00:59:25 | 0.7 |
| 2015-01-01_00:59:26 | 0.7 |
| 2015-01-01_00:59:27 | 0.7 |
| 2015-01-01_00:59:28 | 0.7 |
| 2015-01-01_00:59:29 | 0.6 |
| 2015-01-01_00:59:30 | 0.6 |
| 2015-01-01_00:59:31 | 0.7 |
| 2015-01-01_00:59:32 | 0.7 |
| 2015-01-01_00:59:33 | 0.7 |
| 2015-01-01_00:59:34 | 0.6 |
| 2015-01-01_00:59:35 | 0.7 |
| 2015-01-01_00:59:36 | 0.7 |
| 2015-01-01_00:59:37 | 0.7 |
| 2015-01-01_00:59:38 | 0.6 |
| 2015-01-01_00:59:39 | 0.7 |
| 2015-01-01_00:59:40 | 0.7 |
| 2015-01-01_00:59:41 | 0.6 |
| 2015-01-01_00:59:42 | 0.7 |
| 2015-01-01_00:59:43 | 0.7 |
| 2015-01-01_00:59:44 | 0.7 |
| 2015-01-01_00:59:45 | 0.7 |
| 2015-01-01_00:59:46 | 0.7 |
| 2015-01-01_00:59:47 | 0.6 |
| 2015-01-01_00:59:48 | 0.7 |
| 2015-01-01_00:59:49 | 0.7 |
| 2015-01-01_00:59:50 | 0.7 |
| 2015-01-01_00:59:51 | 0.7 |
| 2015-01-01_00:59:52 | 0.6 |
| 2015-01-01_00:59:53 | 0.7 |
| 2015-01-01_00:59:54 | 0.7 |
| 2015-01-01_00:59:55 | 0.6 |
| 2015-01-01_00:59:56 | 0.6 |
| 2015-01-01_00:59:57 | 0.7 |
| 2015-01-01_00:59:58 | 0.6 |
| 2015-01-01_00:59:59 | 0.7 |
| 2015-01-01_01:00:01 | 0.8 |
| 2015-01-01_01:00:02 | 0.7 |
| 2015-01-01_01:00:03 | 0.7 |
| 2015-01-01_01:00:04 | 0.6 |
| 2015-01-01_01:00:05 | 0.6 |
| 2015-01-01_01:00:06 | 0.6 |
| 2015-01-01_01:00:07 | 0.7 |
| 2015-01-01_01:00:08 | 0.7 |
| 2015-01-01_01:00:09 | 0.7 |
| 2015-01-01_01:00:10 | 0.7 |
| 2015-01-01_01:00:11 | 0.7 |
| 2015-01-01_01:00:12 | 0.7 |
| 2015-01-01_01:00:13 | 0.8 |
| 2015-01-01_01:00:14 | 0.7 |
| 2015-01-01_01:00:15 | 0.7 |
| 2015-01-01_01:00:16 | 0.6 |
| 2015-01-01_01:00:17 | 0.6 |
| 2015-01-01_01:00:18 | 0.6 |
| 2015-01-01_01:00:19 | 0.7 |
| 2015-01-01_01:00:20 | 0.7 |
| 2015-01-01_01:00:21 | 0.7 |
| 2015-01-01_01:00:22 | 0.6 |
| 2015-01-01_01:00:23 | 0.7 |
| 2015-01-01_01:00:24 | 0.8 |
| 2015-01-01_01:00:25 | 0.7 |
| 2015-01-01_01:00:26 | 13.2 |
| 2015-01-01_01:00:27 | 10.1 |
| 2015-01-01_01:00:28 | 6.3 |
| 2015-01-01_01:00:29 | 7.1 |
| 2015-01-01_01:00:30 | 6 |
| 2015-01-01_01:00:31 | 5.7 |
| 2015-01-01_01:00:32 | 5.3 |
| 2015-01-01_01:00:33 | 4.9 |
| 2015-01-01_01:00:34 | 5.8 |
| 2015-01-01_01:00:35 | 5.4 |
| 2015-01-01_01:00:36 | 5.7 |
| 2015-01-01_01:00:37 | 6.4 |
| 2015-01-01_01:00:38 | 5.8 |
| 2015-01-01_01:00:39 | 5.9 |
| 2015-01-01_01:00:40 | 6.1 |
| 2015-01-01_01:00:41 | 5.5 |
| 2015-01-01_01:00:42 | 5 |
| 2015-01-01_01:00:43 | 4.9 |
| 2015-01-01_01:00:44 | 5.4 |
| 2015-01-01_01:00:45 | 5.5 |
| 2015-01-01_01:00:46 | 5.4 |
| 2015-01-01_01:00:47 | 5.5 |
| 2015-01-01_01:00:48 | 4.9 |
| 2015-01-01_01:00:49 | 5.1 |
| 2015-01-01_01:00:50 | 5 |
| 2015-01-01_01:00:51 | 4.9 |
| 2015-01-01_01:00:52 | 4.6 |
| 2015-01-01_01:00:53 | 4.9 |
| 2015-01-01_01:00:54 | 5.4 |
| 2015-01-01_01:00:55 | 4.7 |
| 2015-01-01_01:00:56 | 4.2 |
| 2015-01-01_01:00:57 | 4.5 |
| 2015-01-01_01:00:58 | 4.2 |
| 2015-01-01_01:00:59 | 4.3 |
| 2015-01-01_01:01:00 | 4.1 |
| 2015-01-01_01:01:01 | 3.9 |
| 2015-01-01_01:01:02 | 4.2 |
| 2015-01-01_01:01:03 | 3.9 |
| 2015-01-01_01:01:04 | 3.9 |
| 2015-01-01_01:01:05 | 3.9 |
| 2015-01-01_01:01:06 | 4 |
| 2015-01-01_01:01:07 | 3.9 |
| 2015-01-01_01:01:08 | 3.8 |
| 2015-01-01_01:01:09 | 3.9 |
| 2015-01-01_01:01:10 | 3.6 |
| 2015-01-01_01:01:11 | 3.8 |
| 2015-01-01_01:01:12 | 3.9 |
| 2015-01-01_01:01:13 | 4.1 |
| 2015-01-01_01:01:14 | 3.7 |
| 2015-01-01_01:01:15 | 3.7 |
| 2015-01-01_01:01:16 | 4.4 |
| 2015-01-01_01:01:17 | 4 |
| 2015-01-01_01:01:18 | 3.8 |
| 2015-01-01_01:01:19 | 4 |
| 2015-01-01_01:01:20 | 3.7 |
| 2015-01-01_01:01:21 | 4.1 |
| 2015-01-01_01:01:22 | 4 |
| 2015-01-01_01:01:23 | 4.1 |
| 2015-01-01_01:01:24 | 3.7 |
| 2015-01-01_01:01:25 | 4.2 |
| 2015-01-01_01:01:26 | 4.3 |
| 2015-01-01_01:01:27 | 3.9 |
| 2015-01-01_01:01:28 | 4.6 |
| 2015-01-01_01:01:29 | 4.1 |
| 2015-01-01_01:01:30 | 4.1 |
| 2015-01-01_01:01:31 | 3.9 |
| 2015-01-01_01:01:32 | 3.6 |
| 2015-01-01_01:01:33 | 1.1 |
| 2015-01-01_01:01:34 | 6.6 |
| 2015-01-01_01:01:35 | 9.6 |
| 2015-01-01_01:01:36 | 9.4 |
| 2015-01-01_01:01:37 | 8.3 |
| 2015-01-01_01:01:38 | 2.9 |
| 2015-01-01_01:01:39 | 3.1 |
| 2015-01-01_01:01:40 | 3.5 |
| 2015-01-01_01:01:41 | 3.1 |
| 2015-01-01_01:01:42 | 3.5 |
| 2015-01-01_01:01:43 | 3.4 |
| 2015-01-01_01:01:44 | 3.3 |
| 2015-01-01_01:01:45 | 3.2 |
| 2015-01-01_01:01:46 | 3.8 |
| 2015-01-01_01:01:47 | 3.2 |
| 2015-01-01_01:01:48 | 3.3 |
| 2015-01-01_01:01:49 | 3.4 |
| 2015-01-01_01:01:50 | 3.7 |
| 2015-01-01_01:01:51 | 3.4 |
| 2015-01-01_01:01:52 | 3.2 |
| 2015-01-01_01:01:53 | 3.5 |
| 2015-01-01_01:01:54 | 4 |
| 2015-01-01_01:01:55 | 3.2 |
| 2015-01-01_01:01:56 | 3.7 |
| 2015-01-01_01:01:57 | 3.7 |
| 2015-01-01_01:01:58 | 4.1 |
| 2015-01-01_01:01:59 | 3.9 |
| 2015-01-01_01:02:00 | 4.5 |
| 2015-01-01_01:02:01 | 0.7 |
| 2015-01-01_01:02:02 | 0.7 |
| 2015-01-01_01:02:03 | 0.7 |
| 2015-01-01_01:02:04 | 0.7 |
| 2015-01-01_01:02:05 | 0.7 |
| 2015-01-01_01:02:06 | 0.7 |
| 2015-01-01_01:02:07 | 0.7 |
| 2015-01-01_01:02:08 | 0.7 |
| 2015-01-01_01:02:09 | 0.7 |
| 2015-01-01_01:02:10 | 0.7 |
| 2015-01-01_01:02:11 | 0.8 |
| 2015-01-01_01:02:12 | 0.8 |
| 2015-01-01_01:02:13 | 0.7 |
| 2015-01-01_01:02:14 | 0.8 |
| 2015-01-01_01:02:15 | 0.6 |
| 2015-01-01_01:02:16 | 0.6 |
| 2015-01-01_01:02:17 | 0.7 |
| 2015-01-01_01:02:18 | 0.6 |
| 2015-01-01_01:02:19 | 0.7 |
| 2015-01-01_01:02:20 | 0.7 |
| 2015-01-01_01:02:21 | 0.8 |
| 2015-01-01_01:02:22 | 0.7 |
| 2015-01-01_01:02:23 | 0.7 |
| 2015-01-01_01:02:24 | 0.9 |
| 2015-01-01_01:02:25 | 14.2 |
| 2015-01-01_01:02:26 | 14.3 |
| 2015-01-01_01:02:27 | 4.9 |
| 2015-01-01_01:02:28 | 4.8 |
| 2015-01-01_01:02:29 | 5.7 |
| 2015-01-01_01:02:30 | 5.4 |
| 2015-01-01_01:02:31 | 6.4 |
| 2015-01-01_01:02:32 | 6.2 |
| 2015-01-01_01:02:33 | 5.8 |
| 2015-01-01_01:02:34 | 6.2 |
| 2015-01-01_01:02:35 | 6.2 |
| 2015-01-01_01:02:36 | 6.1 |
| 2015-01-01_01:02:37 | 6.2 |
| 2015-01-01_01:02:38 | 6.2 |
| 2015-01-01_01:02:39 | 7 |
| 2015-01-01_01:02:40 | 6.2 |
| 2015-01-01_01:02:41 | 6.3 |
| 2015-01-01_01:02:42 | 5.6 |
| 2015-01-01_01:02:43 | 5.3 |
| 2015-01-01_01:02:44 | 5.5 |
| 2015-01-01_01:02:45 | 5.9 |
| 2015-01-01_01:02:46 | 6.4 |
| 2015-01-01_01:02:47 | 0.6 |
| 2015-01-01_01:02:48 | 0.7 |
| 2015-01-01_01:02:49 | 0.7 |
| 2015-01-01_01:02:50 | 0.7 |
| 2015-01-01_01:02:51 | 0.6 |
| 2015-01-01_01:02:52 | 0.6 |
| 2015-01-01_01:02:53 | 0.7 |
| 2015-01-01_01:02:54 | 0.7 |
| 2015-01-01_01:02:55 | 0.7 |
| 2015-01-01_01:02:56 | 0.7 |
| 2015-01-01_01:02:57 | 0.7 |
| 2015-01-01_01:02:58 | 0.7 |
| 2015-01-01_01:02:59 | 0.7 |
| 2015-01-01_01:03:00 | 0.7 |
| 2015-01-01_01:03:01 | 0.8 |
| 2015-01-01_01:03:02 | 16.8 |
| 2015-01-01_01:03:03 | 15.1 |
| 2015-01-01_01:03:04 | 4.1 |
| 2015-01-01_01:03:05 | 5.9 |
| 2015-01-01_01:03:06 | 7.4 |
| 2015-01-01_01:03:07 | 6.1 |
| 2015-01-01_01:03:08 | 10 |
| 2015-01-01_01:03:09 | 10 |
| 2015-01-01_01:03:10 | 8.1 |
| 2015-01-01_01:03:11 | 8.3 |
| 2015-01-01_01:03:12 | 7.4 |
| 2015-01-01_01:03:13 | 7.6 |
| 2015-01-01_01:03:14 | 7 |
| 2015-01-01_01:03:15 | 8.7 |
| 2015-01-01_01:03:16 | 7.4 |
| 2015-01-01_01:03:17 | 7.2 |
| 2015-01-01_01:03:18 | 6.4 |
| 2015-01-01_01:03:19 | 6 |
| 2015-01-01_01:03:20 | 6.5 |
| 2015-01-01_01:03:21 | 6.3 |
| 2015-01-01_01:03:22 | 6.8 |
| 2015-01-01_01:03:23 | 8.2 |
| 2015-01-01_01:03:24 | 7.2 |
| 2015-01-01_01:03:25 | 6.5 |
| 2015-01-01_01:03:26 | 5.7 |
| 2015-01-01_01:03:27 | 5.9 |
| 2015-01-01_01:03:28 | 7.8 |
| 2015-01-01_01:03:29 | 7.3 |
| 2015-01-01_01:03:30 | 6 |
| 2015-01-01_01:03:31 | 6.8 |
| 2015-01-01_01:03:32 | 6.8 |
| 2015-01-01_01:03:33 | 7.8 |
| 2015-01-01_01:03:34 | 7 |
| 2015-01-01_01:03:35 | 5.8 |
| 2015-01-01_01:03:36 | 7.3 |
| 2015-01-01_01:03:37 | 6.4 |
| 2015-01-01_01:03:38 | 5.7 |
| 2015-01-01_01:03:39 | 5.7 |
| 2015-01-01_01:03:40 | 7.3 |
| 2015-01-01_01:03:41 | 6.8 |
| 2015-01-01_01:03:42 | 6.6 |
| 2015-01-01_01:03:43 | 7.6 |
| 2015-01-01_01:03:44 | 7.5 |
| 2015-01-01_01:03:45 | 7.2 |
| 2015-01-01_01:03:46 | 7.6 |
| 2015-01-01_01:03:47 | 6.8 |
| 2015-01-01_01:03:48 | 6.5 |
| 2015-01-01_01:03:49 | 7 |
| 2015-01-01_01:03:50 | 6.8 |
| 2015-01-01_01:03:51 | 7 |
| 2015-01-01_01:03:52 | 0.6 |
| 2015-01-01_01:03:53 | 0.6 |
| 2015-01-01_01:03:54 | 0.7 |
| 2015-01-01_01:03:55 | 0.6 |
| 2015-01-01_01:03:56 | 0.6 |
| 2015-01-01_01:03:57 | 0.6 |
| 2015-01-01_01:03:58 | 0.6 |
| 2015-01-01_01:03:59 | 0.6 |
| 2015-01-01_01:04:00 | 0.6 |
| 2015-01-01_01:04:01 | 0.7 |
| 2015-01-01_01:04:02 | 0.7 |
| 2015-01-01_01:04:03 | 0.6 |
| 2015-01-01_01:04:04 | 0.8 |
| 2015-01-01_01:04:05 | 1 |
| 2015-01-01_01:04:06 | 1.2 |
| 2015-01-01_01:04:07 | 0.6 |
| 2015-01-01_01:04:08 | 0.7 |
| 2015-01-01_01:04:09 | 0.7 |
| 2015-01-01_01:04:10 | 0.7 |
| 2015-01-01_01:04:11 | 0.7 |
| 2015-01-01_01:04:12 | 0.7 |
| 2015-01-01_01:04:13 | 0.8 |
| 2015-01-01_01:04:14 | 0.9 |
| 2015-01-01_01:04:15 | 15.6 |
| 2015-01-01_01:04:16 | 16.5 |
| 2015-01-01_01:04:17 | 5.3 |
| 2015-01-01_01:04:18 | 6.7 |
| 2015-01-01_01:04:19 | 7.7 |
| 2015-01-01_01:04:20 | 6.8 |
| 2015-01-01_01:04:21 | 7 |
| 2015-01-01_01:04:22 | 5.5 |
| 2015-01-01_01:04:23 | 6.3 |
| 2015-01-01_01:04:24 | 0.5 |
| 2015-01-01_01:04:25 | 0.7 |
| 2015-01-01_01:04:26 | 0.7 |
| 2015-01-01_01:04:27 | 0.6 |
| 2015-01-01_01:04:28 | 0.7 |
| 2015-01-01_01:04:29 | 0.8 |
| 2015-01-01_01:04:30 | 0.9 |
| 2015-01-01_01:04:31 | 12.8 |
| 2015-01-01_01:04:32 | 11.2 |
| 2015-01-01_01:04:33 | 5.5 |
| 2015-01-01_01:04:34 | 0.6 |
| 2015-01-01_01:04:35 | 0.6 |
| 2015-01-01_01:04:36 | 0.7 |
| 2015-01-01_01:04:37 | 0.6 |
| 2015-01-01_01:04:38 | 0.8 |
| 2015-01-01_01:04:39 | 0.7 |
| 2015-01-01_01:04:40 | 0.9 |
| 2015-01-01_01:04:41 | 1 |
| 2015-01-01_01:04:42 | 0.6 |
| 2015-01-01_01:04:43 | 0.6 |
| 2015-01-01_01:04:44 | 0.9 |
| 2015-01-01_01:04:45 | 0.8 |
| 2015-01-01_01:04:46 | 0.7 |
| 2015-01-01_01:04:47 | 0.8 |
| 2015-01-01_01:04:48 | 0.7 |
| 2015-01-01_01:04:49 | 0.7 |
| 2015-01-01_01:04:50 | 0.7 |
| 2015-01-01_01:04:51 | 0.6 |
| 2015-01-01_01:04:52 | 0.6 |
| 2015-01-01_01:04:53 | 0.9 |
| 2015-01-01_01:04:54 | 13.9 |
| 2015-01-01_01:04:55 | 19.4 |
| 2015-01-01_01:04:56 | 11.8 |
| 2015-01-01_01:04:57 | 5.1 |
| 2015-01-01_01:04:58 | 10.8 |
| 2015-01-01_01:04:59 | 8.4 |
| 2015-01-01_01:05:00 | 8.7 |
| 2015-01-01_01:05:01 | 10.3 |
| 2015-01-01_01:05:02 | 14 |
| 2015-01-01_01:05:03 | 17.6 |
| 2015-01-01_01:05:04 | 10.2 |
| 2015-01-01_01:05:05 | 7 |
| 2015-01-01_01:05:06 | 19.9 |
| 2015-01-01_01:05:07 | 20.2 |
| 2015-01-01_01:05:08 | 22.2 |
| 2015-01-01_01:05:09 | 20.2 |
| 2015-01-01_01:05:10 | 3.8 |
| 2015-01-01_01:05:11 | 13 |
| 2015-01-01_01:05:12 | 20.6 |
| 2015-01-01_01:05:13 | 18.8 |
| 2015-01-01_01:05:14 | 6.4 |
| 2015-01-01_01:05:15 | 1.3 |
| 2015-01-01_01:05:16 | 7.3 |
| 2015-01-01_01:05:17 | 12.8 |
| 2015-01-01_01:05:18 | 10.4 |
| 2015-01-01_01:05:19 | 7.4 |
| 2015-01-01_01:05:20 | 1 |
| 2015-01-01_01:05:21 | 1.4 |
| 2015-01-01_01:05:22 | 2.3 |
| 2015-01-01_01:05:23 | 2.8 |
| 2015-01-01_01:05:24 | 3.1 |
| 2015-01-01_01:05:25 | 3 |
| 2015-01-01_01:05:26 | 4.6 |
| 2015-01-01_01:05:27 | 5.6 |
| 2015-01-01_01:05:28 | 5 |
| 2015-01-01_01:05:29 | 4.1 |
| 2015-01-01_01:05:30 | 2.5 |
| 2015-01-01_01:05:31 | 0.9 |
| 2015-01-01_01:05:32 | 1.5 |
| 2015-01-01_01:05:33 | 1.7 |
| 2015-01-01_01:05:34 | 1.7 |
| 2015-01-01_01:05:35 | 3.7 |
| 2015-01-01_01:05:36 | 4.2 |
| 2015-01-01_01:05:37 | 3 |
| 2015-01-01_01:05:38 | 1.7 |
| 2015-01-01_01:05:39 | 1.3 |
| 2015-01-01_01:05:40 | 2 |
| 2015-01-01_01:05:41 | 2.6 |
| 2015-01-01_01:05:42 | 2.5 |
| 2015-01-01_01:05:43 | 2.4 |
| 2015-01-01_01:05:44 | 2.8 |
| 2015-01-01_01:05:45 | 3 |
| 2015-01-01_01:05:46 | 2.8 |
| 2015-01-01_01:05:47 | 2.9 |
| 2015-01-01_01:05:48 | 2.8 |
| 2015-01-01_01:05:49 | 3.2 |
| 2015-01-01_01:05:50 | 2.7 |
| 2015-01-01_01:05:51 | 2.7 |
| 2015-01-01_01:05:52 | 2.9 |
| 2015-01-01_01:05:53 | 2.8 |
| 2015-01-01_01:05:54 | 3.3 |
| 2015-01-01_01:05:55 | 4.3 |
| 2015-01-01_01:05:56 | 4.6 |
| 2015-01-01_01:05:57 | 5.1 |
| 2015-01-01_01:05:58 | 5.3 |
| 2015-01-01_01:05:59 | 4.8 |
| 2015-01-01_01:06:00 | 4.9 |
| 2015-01-01_01:06:01 | 4.9 |
| 2015-01-01_01:06:02 | 4.1 |
| 2015-01-01_01:06:03 | 4 |
| 2015-01-01_01:06:04 | 4 |
| 2015-01-01_01:06:05 | 3.9 |
| 2015-01-01_01:06:06 | 4.6 |
| 2015-01-01_01:06:07 | 5 |
| 2015-01-01_01:06:08 | 5.2 |
| 2015-01-01_01:06:09 | 5.6 |
| 2015-01-01_01:06:10 | 5.7 |
| 2015-01-01_01:06:11 | 4.7 |
| 2015-01-01_01:06:12 | 5.1 |
| 2015-01-01_01:06:13 | 5.1 |
| 2015-01-01_01:06:14 | 4.7 |
| 2015-01-01_01:06:15 | 5.1 |
| 2015-01-01_01:06:16 | 4.7 |
| 2015-01-01_01:06:17 | 4.3 |
| 2015-01-01_01:06:18 | 4.8 |
| 2015-01-01_01:06:19 | 4.3 |
| 2015-01-01_01:06:20 | 4.2 |
| 2015-01-01_01:06:21 | 3.6 |
| 2015-01-01_01:06:22 | 3.5 |
| 2015-01-01_01:06:23 | 3.6 |
| 2015-01-01_01:06:24 | 3.4 |
| 2015-01-01_01:06:25 | 3.9 |
| 2015-01-01_01:06:26 | 3.8 |
| 2015-01-01_01:06:27 | 3.6 |
| 2015-01-01_01:06:28 | 4.3 |
| 2015-01-01_01:06:29 | 4.1 |
| 2015-01-01_01:06:30 | 3.8 |
| 2015-01-01_01:06:31 | 4.1 |
| 2015-01-01_01:06:32 | 4.1 |
| 2015-01-01_01:06:33 | 3.9 |
| 2015-01-01_01:06:34 | 3.9 |
| 2015-01-01_01:06:35 | 3.4 |
| 2015-01-01_01:06:36 | 2.6 |
| 2015-01-01_01:06:37 | 2.5 |
| 2015-01-01_01:06:38 | 2.7 |
| 2015-01-01_01:06:39 | 2.7 |
| 2015-01-01_01:06:40 | 2.6 |
| 2015-01-01_01:06:41 | 2.9 |
| 2015-01-01_01:06:42 | 2.9 |
| 2015-01-01_01:06:43 | 2.4 |
| 2015-01-01_01:06:44 | 2.6 |
| 2015-01-01_01:06:45 | 3 |
| 2015-01-01_01:06:46 | 2.8 |
| 2015-01-01_01:06:47 | 3 |
| 2015-01-01_01:06:48 | 3.1 |
| 2015-01-01_01:06:49 | 2.8 |
| 2015-01-01_01:06:50 | 2.7 |
| 2015-01-01_01:06:51 | 2.7 |
| 2015-01-01_01:06:52 | 2.7 |
| 2015-01-01_01:06:53 | 3.3 |
| 2015-01-01_01:06:54 | 3.7 |
| 2015-01-01_01:06:55 | 3.4 |
| 2015-01-01_01:06:56 | 3.5 |
| 2015-01-01_01:06:57 | 3.7 |
| 2015-01-01_01:06:58 | 3.4 |
| 2015-01-01_01:06:59 | 3.7 |
| 2015-01-01_01:07:00 | 3.8 |
| 2015-01-01_01:07:01 | 3.5 |
| 2015-01-01_01:07:02 | 3.9 |
| 2015-01-01_01:07:03 | 4.1 |
| 2015-01-01_01:07:04 | 3.8 |
| 2015-01-01_01:07:05 | 4.1 |
| 2015-01-01_01:07:06 | 4 |
| 2015-01-01_01:07:07 | 3.6 |
| 2015-01-01_01:07:08 | 3.5 |
| 2015-01-01_01:07:09 | 3.3 |
| 2015-01-01_01:07:10 | 3.5 |
| 2015-01-01_01:07:11 | 3.7 |
| 2015-01-01_01:07:12 | 4.3 |
| 2015-01-01_01:07:13 | 4.4 |
| 2015-01-01_01:07:14 | 3.9 |
| 2015-01-01_01:07:15 | 4.2 |
| 2015-01-01_01:07:16 | 4.3 |
| 2015-01-01_01:07:17 | 4.1 |
| 2015-01-01_01:07:18 | 4.2 |
| 2015-01-01_01:07:19 | 4.2 |
| 2015-01-01_01:07:20 | 4.1 |
| 2015-01-01_01:07:21 | 4.5 |
| 2015-01-01_01:07:22 | 4.6 |
| 2015-01-01_01:07:23 | 4.4 |
| 2015-01-01_01:07:24 | 4.7 |
| 2015-01-01_01:07:25 | 4.6 |
| 2015-01-01_01:07:26 | 4 |
| 2015-01-01_01:07:27 | 4.3 |
| 2015-01-01_01:07:28 | 5.3 |
| 2015-01-01_01:07:29 | 5 |
| 2015-01-01_01:07:30 | 4.8 |
| 2015-01-01_01:07:31 | 4.5 |
| 2015-01-01_01:07:32 | 3.9 |
| 2015-01-01_01:07:33 | 3.7 |
| 2015-01-01_01:07:34 | 2.9 |
| 2015-01-01_01:07:35 | 2.7 |
| 2015-01-01_01:07:36 | 2.7 |
| 2015-01-01_01:07:37 | 3 |
| 2015-01-01_01:07:38 | 3.3 |
| 2015-01-01_01:07:39 | 3.3 |
| 2015-01-01_01:07:40 | 3.8 |
| 2015-01-01_01:07:41 | 3.6 |
| 2015-01-01_01:07:42 | 2.9 |
| 2015-01-01_01:07:43 | 2.9 |
| 2015-01-01_01:07:44 | 2.8 |
| 2015-01-01_01:07:45 | 2.7 |
| 2015-01-01_01:07:46 | 3 |
| 2015-01-01_01:07:47 | 3 |
| 2015-01-01_01:07:48 | 2.8 |
| 2015-01-01_01:07:49 | 2.9 |
| 2015-01-01_01:07:50 | 3.1 |
| 2015-01-01_01:07:51 | 3.1 |
| 2015-01-01_01:07:52 | 3.4 |
| 2015-01-01_01:07:53 | 3.1 |
| 2015-01-01_01:07:54 | 2.5 |
| 2015-01-01_01:07:55 | 2.7 |
| 2015-01-01_01:07:56 | 2.8 |
| 2015-01-01_01:07:57 | 2.8 |
| 2015-01-01_01:07:58 | 2.7 |
| 2015-01-01_01:07:59 | 2.9 |
| 2015-01-01_01:08:00 | 2.9 |
| 2015-01-01_01:08:01 | 2.8 |
| 2015-01-01_01:08:02 | 3.6 |
| 2015-01-01_01:08:03 | 4.2 |
| 2015-01-01_01:08:04 | 3.6 |
| 2015-01-01_01:08:05 | 3.2 |
| 2015-01-01_01:08:06 | 2.9 |
| 2015-01-01_01:08:07 | 2.7 |
| 2015-01-01_01:08:08 | 3.6 |
| 2015-01-01_01:08:09 | 3.6 |
| 2015-01-01_01:08:10 | 3 |
| 2015-01-01_01:08:11 | 3 |
| 2015-01-01_01:08:12 | 3 |
| 2015-01-01_01:08:13 | 3 |
| 2015-01-01_01:08:14 | 3.4 |
| 2015-01-01_01:08:15 | 3.2 |
| 2015-01-01_01:08:16 | 2.8 |
| 2015-01-01_01:08:17 | 3.1 |
| 2015-01-01_01:08:18 | 3 |
| 2015-01-01_01:08:19 | 2.9 |
| 2015-01-01_01:08:20 | 3.3 |
| 2015-01-01_01:08:21 | 3.3 |
| 2015-01-01_01:08:22 | 2.8 |
| 2015-01-01_01:08:23 | 2.6 |
| 2015-01-01_01:08:24 | 2.7 |
| 2015-01-01_01:08:25 | 2.8 |
| 2015-01-01_01:08:26 | 2.8 |
| 2015-01-01_01:08:27 | 3.1 |
| 2015-01-01_01:08:28 | 3 |
| 2015-01-01_01:08:29 | 2.8 |
| 2015-01-01_01:08:30 | 3 |
| 2015-01-01_01:08:31 | 2.9 |
| 2015-01-01_01:08:32 | 2.9 |
| 2015-01-01_01:08:33 | 3.5 |
| 2015-01-01_01:08:34 | 3.8 |
| 2015-01-01_01:08:35 | 3.7 |
| 2015-01-01_01:08:36 | 4 |
| 2015-01-01_01:08:37 | 3.8 |
| 2015-01-01_01:08:38 | 3.7 |
| 2015-01-01_01:08:39 | 4 |
| 2015-01-01_01:08:40 | 3.8 |
| 2015-01-01_01:08:41 | 3.4 |
| 2015-01-01_01:08:42 | 3.8 |
| 2015-01-01_01:08:43 | 3.7 |
| 2015-01-01_01:08:44 | 3.3 |
| 2015-01-01_01:08:45 | 3.3 |
| 2015-01-01_01:08:46 | 2.9 |
| 2015-01-01_01:08:47 | 2.6 |
| 2015-01-01_01:08:48 | 3 |
| 2015-01-01_01:08:49 | 3.2 |
| 2015-01-01_01:08:50 | 3.5 |
| 2015-01-01_01:08:51 | 3.5 |
| 2015-01-01_01:08:52 | 5.5 |
| 2015-01-01_01:08:53 | 10.2 |
| 2015-01-01_01:08:54 | 12.3 |
| 2015-01-01_01:08:55 | 11.3 |
| 2015-01-01_01:08:56 | 6.5 |
| 2015-01-01_01:08:57 | 5.6 |
| 2015-01-01_01:08:58 | 4.9 |
| 2015-01-01_01:08:59 | 2.2 |
| 2015-01-01_01:09:00 | 1 |
| 2015-01-01_01:09:01 | 3.8 |
| 2015-01-01_01:09:02 | 5.2 |
| 2015-01-01_01:09:03 | 5.1 |
| 2015-01-01_01:09:04 | 4.1 |
| 2015-01-01_01:09:05 | 3.9 |
| 2015-01-01_01:09:06 | 4.1 |
| 2015-01-01_01:09:07 | 4.1 |
| 2015-01-01_01:09:08 | 4.4 |
| 2015-01-01_01:09:09 | 5 |
| 2015-01-01_01:09:10 | 4.2 |
| 2015-01-01_01:09:11 | 4.4 |
| 2015-01-01_01:09:12 | 4.8 |
| 2015-01-01_01:09:13 | 4.7 |
| 2015-01-01_01:09:14 | 4.9 |
| 2015-01-01_01:09:15 | 4.9 |
| 2015-01-01_01:09:16 | 4.4 |
| 2015-01-01_01:09:17 | 4.5 |
| 2015-01-01_01:09:18 | 5 |
| 2015-01-01_01:09:19 | 4.5 |
| 2015-01-01_01:09:20 | 4.1 |
| 2015-01-01_01:09:21 | 4.3 |
| 2015-01-01_01:09:22 | 4 |
| 2015-01-01_01:09:23 | 4.5 |
| 2015-01-01_01:09:24 | 4.7 |
| 2015-01-01_01:09:25 | 4.6 |
| 2015-01-01_01:09:26 | 4.7 |
| 2015-01-01_01:09:27 | 4.6 |
| 2015-01-01_01:09:28 | 3.7 |
| 2015-01-01_01:09:29 | 3.4 |
| 2015-01-01_01:09:30 | 3.8 |
| 2015-01-01_01:09:31 | 3.9 |
| 2015-01-01_01:09:32 | 4.2 |
| 2015-01-01_01:09:33 | 4.4 |
| 2015-01-01_01:09:34 | 3.7 |
| 2015-01-01_01:09:35 | 3.8 |
| 2015-01-01_01:09:36 | 4.2 |
| 2015-01-01_01:09:37 | 3.9 |
| 2015-01-01_01:09:38 | 4.1 |
| 2015-01-01_01:09:39 | 4.4 |
| 2015-01-01_01:09:40 | 4 |
| 2015-01-01_01:09:41 | 4 |
| 2015-01-01_01:09:42 | 4.2 |
| 2015-01-01_01:09:43 | 3.9 |
| 2015-01-01_01:09:44 | 3.8 |
| 2015-01-01_01:09:45 | 4.2 |
| 2015-01-01_01:09:46 | 3.7 |
| 2015-01-01_01:09:47 | 3.9 |
| 2015-01-01_01:09:48 | 4.2 |
| 2015-01-01_01:09:49 | 4 |
| 2015-01-01_01:09:50 | 4.1 |
| 2015-01-01_01:09:51 | 0.4 |
| 2015-01-01_01:09:52 | 0 |
| 2015-01-01_01:09:53 | 0 |
| 2015-01-01_01:09:54 | 0 |
| 2015-01-01_01:09:55 | 0 |
| 2015-01-01_01:09:56 | 0 |
| 2015-01-01_01:09:57 | 2 |
| 2015-01-01_01:09:58 | 2.9 |
| 2015-01-01_01:09:59 | 2 |
| 2015-01-01_01:10:00 | 3.9 |
| 2015-01-01_01:10:01 | 3.6 |
| 2015-01-01_01:10:02 | 3.7 |
| 2015-01-01_01:10:03 | 0.8 |
| 2015-01-01_01:10:04 | 2.3 |
| 2015-01-01_01:10:05 | 4.4 |
| 2015-01-01_01:10:06 | 4.6 |
| 2015-01-01_01:10:07 | 2.8 |
| 2015-01-01_01:10:08 | 2.3 |
| 2015-01-01_01:10:09 | 2.6 |
| 2015-01-01_01:10:10 | 3 |
| 2015-01-01_01:10:11 | 2.8 |
| 2015-01-01_01:10:12 | 3.3 |
| 2015-01-01_01:10:13 | 3.6 |
| 2015-01-01_01:10:14 | 3.2 |
| 2015-01-01_01:10:15 | 2.8 |
| 2015-01-01_01:10:16 | 2.8 |
| 2015-01-01_01:10:17 | 3.3 |
| 2015-01-01_01:10:18 | 3.2 |
| 2015-01-01_01:10:19 | 3.2 |
| 2015-01-01_01:10:20 | 3 |
| 2015-01-01_01:10:21 | 3.2 |
| 2015-01-01_01:10:22 | 3.7 |
| 2015-01-01_01:10:23 | 3.9 |
| 2015-01-01_01:10:24 | 3.4 |
| 2015-01-01_01:10:25 | 3.5 |
| 2015-01-01_01:10:26 | 3.4 |
| 2015-01-01_01:10:27 | 2.9 |
| 2015-01-01_01:10:28 | 2.6 |
| 2015-01-01_01:10:29 | 2.5 |
| 2015-01-01_01:10:30 | 2.6 |
| 2015-01-01_01:10:31 | 2.9 |
| 2015-01-01_01:10:32 | 2.9 |
| 2015-01-01_01:10:33 | 2.5 |
| 2015-01-01_01:10:34 | 2.8 |
| 2015-01-01_01:10:35 | 2.9 |
| 2015-01-01_01:10:36 | 2.7 |
| 2015-01-01_01:10:37 | 2.7 |
| 2015-01-01_01:10:38 | 2.6 |
| 2015-01-01_01:10:39 | 2.6 |
| 2015-01-01_01:10:40 | 2.6 |
| 2015-01-01_01:10:41 | 2.5 |
| 2015-01-01_01:10:42 | 2.3 |
| 2015-01-01_01:10:43 | 0 |
| 2015-01-01_01:10:44 | 0 |
| 2015-01-01_01:10:45 | 0 |
| 2015-01-01_01:10:46 | 0 |
| 2015-01-01_01:10:47 | 0 |
| 2015-01-01_01:10:48 | 0.8 |
| 2015-01-01_01:10:49 | 0.1 |
| 2015-01-01_01:10:50 | 0 |
| 2015-01-01_01:10:51 | 1.8 |
| 2015-01-01_01:10:52 | 1.4 |
| 2015-01-01_01:10:53 | 3 |
| 2015-01-01_01:10:54 | 4.6 |
| 2015-01-01_01:10:55 | 5.5 |
| 2015-01-01_01:10:56 | 5.3 |
| 2015-01-01_01:10:57 | 5.7 |
| 2015-01-01_01:10:58 | 5.5 |
| 2015-01-01_01:10:59 | 5.4 |
| 2015-01-01_01:11:00 | 4.8 |
| 2015-01-01_01:11:01 | 5.1 |
| 2015-01-01_01:11:02 | 5.5 |
| 2015-01-01_01:11:03 | 5.9 |
| 2015-01-01_01:11:04 | 7.5 |
| 2015-01-01_01:11:05 | 7.1 |
| 2015-01-01_01:11:06 | 8 |
| 2015-01-01_01:11:07 | 8.5 |
| 2015-01-01_01:11:08 | 7.9 |
| 2015-01-01_01:11:09 | 7.2 |
| 2015-01-01_01:11:10 | 6.9 |
| 2015-01-01_01:11:11 | 0.9 |
| 2015-01-01_01:11:12 | 3.7 |
| 2015-01-01_01:11:13 | 5.4 |
| 2015-01-01_01:11:14 | 4.4 |
| 2015-01-01_01:11:15 | 0.5 |
| 2015-01-01_01:11:16 | 0 |
| 2015-01-01_01:11:17 | 3.2 |
| 2015-01-01_01:11:18 | 3.9 |
| 2015-01-01_01:11:19 | 0 |
| 2015-01-01_01:11:20 | 2 |
| 2015-01-01_01:11:21 | 3.5 |
| 2015-01-01_01:11:22 | 5.5 |
| 2015-01-01_01:11:23 | 5.1 |
| 2015-01-01_01:11:24 | 3.1 |
| 2015-01-01_01:11:25 | 3.2 |
| 2015-01-01_01:11:26 | 3.1 |
| 2015-01-01_01:11:27 | 4.1 |
| 2015-01-01_01:11:28 | 4 |
| 2015-01-01_01:11:29 | 3.6 |
| 2015-01-01_01:11:30 | 3.5 |
| 2015-01-01_01:11:31 | 3.1 |
| 2015-01-01_01:11:32 | 2.8 |
| 2015-01-01_01:11:33 | 3.4 |
| 2015-01-01_01:11:34 | 3.3 |
| 2015-01-01_01:11:35 | 3.4 |
| 2015-01-01_01:11:36 | 3.3 |
| 2015-01-01_01:11:37 | 3.4 |
| 2015-01-01_01:11:38 | 4.1 |
| 2015-01-01_01:11:39 | 3.6 |
| 2015-01-01_01:11:40 | 3.1 |
| 2015-01-01_01:11:41 | 3 |
| 2015-01-01_01:11:42 | 3 |
| 2015-01-01_01:11:43 | 2.7 |
| 2015-01-01_01:11:44 | 3.1 |
| 2015-01-01_01:11:45 | 3.5 |
| 2015-01-01_01:11:46 | 4.6 |
| 2015-01-01_01:11:47 | 3.9 |
| 2015-01-01_01:11:48 | 2.6 |
| 2015-01-01_01:11:49 | 1.5 |
| 2015-01-01_01:11:50 | 0 |
| 2015-01-01_01:11:51 | 1.1 |
| 2015-01-01_01:11:52 | 2.6 |
| 2015-01-01_01:11:53 | 2.3 |
| 2015-01-01_01:11:54 | 2.8 |
| 2015-01-01_01:11:55 | 3.5 |
| 2015-01-01_01:11:56 | 5.8 |
| 2015-01-01_01:11:57 | 7 |
| 2015-01-01_01:11:58 | 6.8 |
| 2015-01-01_01:11:59 | 6.4 |
| 2015-01-01_01:12:00 | 5.6 |
| 2015-01-01_01:12:01 | 5.7 |
| 2015-01-01_01:12:02 | 4.4 |
| 2015-01-01_01:12:03 | 4.6 |
| 2015-01-01_01:12:04 | 4.7 |
| 2015-01-01_01:12:05 | 5.1 |
| 2015-01-01_01:12:06 | 3.8 |
| 2015-01-01_01:12:07 | 1.4 |
| 2015-01-01_01:12:08 | 0 |
| 2015-01-01_01:12:09 | 0 |
| 2015-01-01_01:12:10 | 0 |
| 2015-01-01_01:12:11 | 0 |
| 2015-01-01_01:12:12 | 0.4 |
| 2015-01-01_01:12:13 | 2.8 |
| 2015-01-01_01:12:14 | 2.7 |
| 2015-01-01_01:12:15 | 2.5 |
| 2015-01-01_01:12:16 | 2.6 |
| 2015-01-01_01:12:17 | 2.4 |
| 2015-01-01_01:12:18 | 3.2 |
| 2015-01-01_01:12:19 | 5.7 |
| 2015-01-01_01:12:20 | 11.9 |
| 2015-01-01_01:12:21 | 12.5 |
| 2015-01-01_01:12:22 | 10.1 |
| 2015-01-01_01:12:23 | 11.1 |
| 2015-01-01_01:12:24 | 5.9 |
| 2015-01-01_01:12:25 | 3.5 |
| 2015-01-01_01:12:26 | 2.9 |
| 2015-01-01_01:12:27 | 3.6 |
| 2015-01-01_01:12:28 | 8.7 |
| 2015-01-01_01:12:29 | 2.3 |
| 2015-01-01_01:12:30 | 7.8 |
| 2015-01-01_01:12:31 | 5.9 |
| 2015-01-01_01:12:32 | 3.6 |
| 2015-01-01_01:12:33 | 2.3 |
| 2015-01-01_01:12:34 | 2.7 |
| 2015-01-01_01:12:35 | 2.3 |
| 2015-01-01_01:12:36 | 2.3 |
| 2015-01-01_01:12:37 | 2.5 |
| 2015-01-01_01:12:38 | 2.3 |
| 2015-01-01_01:12:39 | 2.5 |
| 2015-01-01_01:12:40 | 2.5 |
| 2015-01-01_01:12:41 | 2.3 |
| 2015-01-01_01:12:42 | 2.2 |
| 2015-01-01_01:12:43 | 2.1 |
| 2015-01-01_01:12:44 | 2.5 |
| 2015-01-01_01:12:45 | 2.8 |
| 2015-01-01_01:12:46 | 7 |
| 2015-01-01_01:12:47 | 11.7 |
| 2015-01-01_01:12:48 | 11.3 |
| 2015-01-01_01:12:49 | 4 |
| 2015-01-01_01:12:50 | 5 |
| 2015-01-01_01:12:51 | 5.3 |
| 2015-01-01_01:12:52 | 4.7 |
| 2015-01-01_01:12:53 | 4.7 |
| 2015-01-01_01:12:54 | 3.8 |
| 2015-01-01_01:12:55 | 4.1 |
| 2015-01-01_01:12:56 | 4.3 |
| 2015-01-01_01:12:57 | 4.1 |
| 2015-01-01_01:12:58 | 4.4 |
| 2015-01-01_01:12:59 | 4.1 |
| 2015-01-01_01:13:00 | 4.1 |
| 2015-01-01_01:13:01 | 4.3 |
| 2015-01-01_01:13:02 | 4.1 |
| 2015-01-01_01:13:03 | 4.5 |
| 2015-01-01_01:13:04 | 4 |
| 2015-01-01_01:13:05 | 3.3 |
| 2015-01-01_01:13:06 | 2.9 |
| 2015-01-01_01:13:07 | 2.9 |
| 2015-01-01_01:13:08 | 3.1 |
| 2015-01-01_01:13:09 | 3.2 |
| 2015-01-01_01:13:10 | 3.1 |
| 2015-01-01_01:13:11 | 3 |
| 2015-01-01_01:13:12 | 3.1 |
| 2015-01-01_01:13:13 | 3.4 |
| 2015-01-01_01:13:14 | 3.6 |
| 2015-01-01_01:13:15 | 4.3 |
| 2015-01-01_01:13:16 | 4 |
| 2015-01-01_01:13:17 | 4.4 |
| 2015-01-01_01:13:18 | 4.2 |
| 2015-01-01_01:13:19 | 4.4 |
| 2015-01-01_01:13:20 | 5.5 |
| 2015-01-01_01:13:21 | 4.9 |
| 2015-01-01_01:13:22 | 5.2 |
| 2015-01-01_01:13:23 | 4.7 |
| 2015-01-01_01:13:24 | 4.7 |
| 2015-01-01_01:13:25 | 5 |
| 2015-01-01_01:13:26 | 4.3 |
| 2015-01-01_01:13:27 | 4.1 |
| 2015-01-01_01:13:28 | 3.5 |
| 2015-01-01_01:13:29 | 3.8 |
| 2015-01-01_01:13:30 | 3.8 |
| 2015-01-01_01:13:31 | 4 |
| 2015-01-01_01:13:32 | 3.8 |
| 2015-01-01_01:13:33 | 3.5 |
| 2015-01-01_01:13:34 | 3.7 |
| 2015-01-01_01:13:35 | 3.7 |
| 2015-01-01_01:13:36 | 4 |
| 2015-01-01_01:13:37 | 4.1 |
| 2015-01-01_01:13:38 | 4.3 |
| 2015-01-01_01:13:39 | 3.8 |
| 2015-01-01_01:13:40 | 3.5 |
| 2015-01-01_01:13:41 | 4.3 |
| 2015-01-01_01:13:42 | 4.4 |
| 2015-01-01_01:13:43 | 5.2 |
| 2015-01-01_01:13:44 | 4.7 |
| 2015-01-01_01:13:45 | 4.6 |
| 2015-01-01_01:13:46 | 4.4 |
| 2015-01-01_01:13:47 | 4.4 |
| 2015-01-01_01:13:48 | 4.8 |
| 2015-01-01_01:13:49 | 4.7 |
| 2015-01-01_01:13:50 | 4.8 |
| 2015-01-01_01:13:51 | 4.4 |
| 2015-01-01_01:13:52 | 4.4 |
| 2015-01-01_01:13:53 | 3.8 |
| 2015-01-01_01:13:54 | 3.6 |
| 2015-01-01_01:13:55 | 3.8 |
| 2015-01-01_01:13:56 | 3.5 |
| 2015-01-01_01:13:57 | 3.3 |
| 2015-01-01_01:13:58 | 2.9 |
| 2015-01-01_01:13:59 | 3.1 |
| 2015-01-01_01:14:00 | 3.1 |
| 2015-01-01_01:14:01 | 3.1 |
| 2015-01-01_01:14:02 | 3.1 |
| 2015-01-01_01:14:03 | 3 |
| 2015-01-01_01:14:04 | 3.4 |
| 2015-01-01_01:14:05 | 2.7 |
| 2015-01-01_01:14:06 | 0 |
| 2015-01-01_01:14:07 | 0 |
| 2015-01-01_01:14:08 | 0 |
| 2015-01-01_01:14:09 | 0 |
| 2015-01-01_01:14:10 | 0 |
| 2015-01-01_01:14:11 | 0 |
| 2015-01-01_01:14:12 | 0 |
| 2015-01-01_01:14:13 | 0 |
| 2015-01-01_01:14:14 | 0 |
| 2015-01-01_01:14:15 | 0 |
| 2015-01-01_01:14:16 | 0 |
| 2015-01-01_01:14:17 | 0 |
| 2015-01-01_01:14:18 | 0 |
| 2015-01-01_01:14:19 | 0 |
| 2015-01-01_01:14:20 | 0 |
| 2015-01-01_01:14:21 | 0 |
| 2015-01-01_01:14:22 | 0.1 |
| 2015-01-01_01:14:23 | 1.2 |
| 2015-01-01_01:14:24 | 1.5 |
| 2015-01-01_01:14:25 | 1.5 |
| 2015-01-01_01:14:26 | 1.6 |
| 2015-01-01_01:14:27 | 1.9 |
| 2015-01-01_01:14:28 | 1.8 |
| 2015-01-01_01:14:29 | 2.2 |
| 2015-01-01_01:14:30 | 7.7 |
| 2015-01-01_01:14:31 | 11.2 |
| 2015-01-01_01:14:32 | 10.7 |
| 2015-01-01_01:14:33 | 11.9 |
| 2015-01-01_01:14:34 | 15 |
| 2015-01-01_01:14:35 | 2.4 |
| 2015-01-01_01:14:36 | 5.3 |
| 2015-01-01_01:14:37 | 9.7 |
| 2015-01-01_01:14:38 | 9.2 |
| 2015-01-01_01:14:39 | 7.8 |
| 2015-01-01_01:14:40 | 7.7 |
| 2015-01-01_01:14:41 | 8.3 |
| 2015-01-01_01:14:42 | 10.4 |
| 2015-01-01_01:14:43 | 4.7 |
| 2015-01-01_01:14:44 | 1.4 |
| 2015-01-01_01:14:45 | 5.3 |
| 2015-01-01_01:14:46 | 5 |
| 2015-01-01_01:14:47 | 3.6 |
| 2015-01-01_01:14:48 | 3.5 |
| 2015-01-01_01:14:49 | 6 |
| 2015-01-01_01:14:50 | 6.1 |
| 2015-01-01_01:14:51 | 7 |
| 2015-01-01_01:14:52 | 6.5 |
| 2015-01-01_01:14:53 | 5.6 |
| 2015-01-01_01:14:54 | 5.9 |
| 2015-01-01_01:14:55 | 5.9 |
| 2015-01-01_01:14:56 | 1.3 |
| 2015-01-01_01:14:57 | 3.1 |
| 2015-01-01_01:14:58 | 4.3 |
| 2015-01-01_01:14:59 | 4.2 |
| 2015-01-01_01:15:00 | 2.5 |
| 2015-01-01_01:15:01 | 2.3 |
| 2015-01-01_01:15:02 | 3.5 |
| 2015-01-01_01:15:03 | 3.8 |
| 2015-01-01_01:15:04 | 3.9 |
| 2015-01-01_01:15:05 | 3 |
| 2015-01-01_01:15:06 | 2.7 |
| 2015-01-01_01:15:07 | 2.6 |
| 2015-01-01_01:15:08 | 2.6 |
| 2015-01-01_01:15:09 | 3.3 |
| 2015-01-01_01:15:10 | 3.6 |
| 2015-01-01_01:15:11 | 3.6 |
| 2015-01-01_01:15:12 | 2.9 |
| 2015-01-01_01:15:13 | 2.9 |
| 2015-01-01_01:15:14 | 1.6 |
| 2015-01-01_01:15:15 | 0.1 |
| 2015-01-01_01:15:16 | 2.9 |
| 2015-01-01_01:15:17 | 2.9 |
| 2015-01-01_01:15:18 | 2 |
| 2015-01-01_01:15:19 | 0.4 |
| 2015-01-01_01:15:20 | 0 |
| 2015-01-01_01:15:21 | 1.7 |
| 2015-01-01_01:15:22 | 3.6 |
| 2015-01-01_01:15:23 | 0.8 |
| 2015-01-01_01:15:24 | 1.4 |
| 2015-01-01_01:15:25 | 2.7 |
| 2015-01-01_01:15:26 | 2.8 |
| 2015-01-01_01:15:27 | 2.6 |
| 2015-01-01_01:15:28 | 2.4 |
| 2015-01-01_01:15:29 | 2.5 |
| 2015-01-01_01:15:30 | 0.3 |
| 2015-01-01_01:15:31 | 0 |
| 2015-01-01_01:15:32 | 0 |
| 2015-01-01_01:15:33 | 1.7 |
| 2015-01-01_01:15:34 | 2.6 |
| 2015-01-01_01:15:35 | 3.6 |
| 2015-01-01_01:15:36 | 6.1 |
| 2015-01-01_01:15:37 | 5.6 |
| 2015-01-01_01:15:38 | 5.5 |
| 2015-01-01_01:15:39 | 7.5 |
| 2015-01-01_01:15:40 | 8.7 |
| 2015-01-01_01:15:41 | 7 |
| 2015-01-01_01:15:42 | 5.5 |
| 2015-01-01_01:15:43 | 5.1 |
| 2015-01-01_01:15:44 | 7.4 |
| 2015-01-01_01:15:45 | 10.4 |
| 2015-01-01_01:15:46 | 1 |
| 2015-01-01_01:15:47 | 4.1 |
| 2015-01-01_01:15:48 | 7 |
| 2015-01-01_01:15:49 | 6.5 |
| 2015-01-01_01:15:50 | 5.5 |
| 2015-01-01_01:15:51 | 5 |
| 2015-01-01_01:15:52 | 5.2 |
| 2015-01-01_01:15:53 | 3.8 |
| 2015-01-01_01:15:54 | 3 |
| 2015-01-01_01:15:55 | 2.7 |
| 2015-01-01_01:15:56 | 2.5 |
| 2015-01-01_01:15:57 | 2.7 |
| 2015-01-01_01:15:58 | 2.5 |
| 2015-01-01_01:15:59 | 2.5 |
| 2015-01-01_01:16:00 | 3.2 |
| 2015-01-01_01:16:01 | 4.6 |
| 2015-01-01_01:16:02 | 6.1 |
| 2015-01-01_01:16:03 | 5.1 |
| 2015-01-01_01:16:04 | 5.3 |
| 2015-01-01_01:16:05 | 5.2 |
| 2015-01-01_01:16:06 | 3.6 |
| 2015-01-01_01:16:07 | 6.8 |
| 2015-01-01_01:16:08 | 6.9 |
| 2015-01-01_01:16:09 | 4.1 |
| 2015-01-01_01:16:10 | 3.6 |
| 2015-01-01_01:16:11 | 3.6 |
| 2015-01-01_01:16:12 | 7.1 |
| 2015-01-01_01:16:13 | 6 |
| 2015-01-01_01:16:14 | 4.7 |
| 2015-01-01_01:16:15 | 3.6 |
| 2015-01-01_01:16:16 | 2.8 |
| 2015-01-01_01:16:17 | 2.9 |
| 2015-01-01_01:16:18 | 4 |
| 2015-01-01_01:16:19 | 3.2 |
| 2015-01-01_01:16:20 | 3.6 |
| 2015-01-01_01:16:21 | 4.6 |
| 2015-01-01_01:16:22 | 3.8 |
| 2015-01-01_01:16:23 | 4.6 |
| 2015-01-01_01:16:24 | 4.7 |
| 2015-01-01_01:16:25 | 3.7 |
| 2015-01-01_01:16:26 | 4.2 |
| 2015-01-01_01:16:27 | 4.7 |
| 2015-01-01_01:16:28 | 3.9 |
| 2015-01-01_01:16:29 | 4.3 |
| 2015-01-01_01:16:30 | 3.4 |
| 2015-01-01_01:16:31 | 3.8 |
| 2015-01-01_01:16:32 | 4.5 |
| 2015-01-01_01:16:33 | 4.3 |
| 2015-01-01_01:16:34 | 5.3 |
| 2015-01-01_01:16:35 | 5 |
| 2015-01-01_01:16:36 | 3.4 |
| 2015-01-01_01:16:37 | 3.5 |
| 2015-01-01_01:16:38 | 5.3 |
| 2015-01-01_01:16:39 | 6.9 |
| 2015-01-01_01:16:40 | 7.1 |
| 2015-01-01_01:16:41 | 5.6 |
| 2015-01-01_01:16:42 | 5.2 |
| 2015-01-01_01:16:43 | 5.2 |
| 2015-01-01_01:16:44 | 4.7 |
| 2015-01-01_01:16:45 | 4 |
| 2015-01-01_01:16:46 | 3.9 |
| 2015-01-01_01:16:47 | 3.7 |
| 2015-01-01_01:16:48 | 3.2 |
| 2015-01-01_01:16:49 | 2.9 |
| 2015-01-01_01:16:50 | 2.7 |
| 2015-01-01_01:16:51 | 3.9 |
| 2015-01-01_01:16:52 | 5.4 |
| 2015-01-01_01:16:53 | 6.1 |
| 2015-01-01_01:16:54 | 6.1 |
| 2015-01-01_01:16:55 | 4.9 |
| 2015-01-01_01:16:56 | 3.4 |
| 2015-01-01_01:16:57 | 3.2 |
| 2015-01-01_01:16:58 | 3.2 |
| 2015-01-01_01:16:59 | 3.3 |
| 2015-01-01_01:17:00 | 3.3 |
| 2015-01-01_01:17:01 | 3.6 |
| 2015-01-01_01:17:02 | 3.5 |
| 2015-01-01_01:17:03 | 3.6 |
| 2015-01-01_01:17:04 | 4.8 |
| 2015-01-01_01:17:05 | 5.3 |
| 2015-01-01_01:17:06 | 6 |
| 2015-01-01_01:17:07 | 5.3 |
| 2015-01-01_01:17:08 | 4.2 |
| 2015-01-01_01:17:09 | 3.6 |
| 2015-01-01_01:17:10 | 3.8 |
| 2015-01-01_01:17:11 | 3.7 |
| 2015-01-01_01:17:12 | 3.8 |
| 2015-01-01_01:17:13 | 4.2 |
| 2015-01-01_01:17:14 | 4 |
| 2015-01-01_01:17:15 | 2.8 |
| 2015-01-01_01:17:16 | 3.6 |
| 2015-01-01_01:17:17 | 4.4 |
| 2015-01-01_01:17:18 | 3.4 |
| 2015-01-01_01:17:19 | 3.9 |
| 2015-01-01_01:17:20 | 5.5 |
| 2015-01-01_01:17:21 | 5 |
| 2015-01-01_01:17:22 | 3.2 |
| 2015-01-01_01:17:23 | 0.4 |
| 2015-01-01_01:17:24 | 0 |
| 2015-01-01_01:17:25 | 0.7 |
| 2015-01-01_01:17:26 | 4.1 |
| 2015-01-01_01:17:27 | 3.6 |
| 2015-01-01_01:17:28 | 3.5 |
| 2015-01-01_01:17:29 | 3.5 |
| 2015-01-01_01:17:30 | 2.5 |
| 2015-01-01_01:17:31 | 3.3 |
| 2015-01-01_01:17:32 | 3.1 |
| 2015-01-01_01:17:33 | 3 |
| 2015-01-01_01:17:34 | 3.9 |
| 2015-01-01_01:17:35 | 4.6 |
| 2015-01-01_01:17:36 | 6.4 |
| 2015-01-01_01:17:37 | 5.5 |
| 2015-01-01_01:17:38 | 3.7 |
| 2015-01-01_01:17:39 | 3.7 |
| 2015-01-01_01:17:40 | 3.1 |
| 2015-01-01_01:17:41 | 2.4 |
| 2015-01-01_01:17:42 | 0.1 |
| 2015-01-01_01:17:43 | 0 |
| 2015-01-01_01:17:44 | 0 |
| 2015-01-01_01:17:45 | 0 |
| 2015-01-01_01:17:46 | 0 |
| 2015-01-01_01:17:47 | 0 |
| 2015-01-01_01:17:48 | 0.7 |
| 2015-01-01_01:17:49 | 1.6 |
| 2015-01-01_01:17:50 | 2.3 |
| 2015-01-01_01:17:51 | 2.4 |
| 2015-01-01_01:17:52 | 2.9 |
| 2015-01-01_01:17:53 | 3.4 |
| 2015-01-01_01:17:54 | 3.3 |
| 2015-01-01_01:17:55 | 3.5 |
| 2015-01-01_01:17:56 | 3.8 |
| 2015-01-01_01:17:57 | 0.7 |
| 2015-01-01_01:17:58 | 0.6 |
| 2015-01-01_01:17:59 | 0.7 |
| 2015-01-01_01:18:00 | 0.7 |
| 2015-01-01_01:18:01 | 0.7 |
| 2015-01-01_01:18:02 | 0.7 |
| 2015-01-01_01:18:03 | 0.6 |
| 2015-01-01_01:18:04 | 0.6 |
| 2015-01-01_01:18:05 | 0.7 |
| 2015-01-01_01:18:06 | 0.7 |
| 2015-01-01_01:18:07 | 0.6 |
| 2015-01-01_01:18:08 | 0.7 |
| 2015-01-01_01:18:09 | 0.6 |
| 2015-01-01_01:18:10 | 0.9 |
| 2015-01-01_01:18:11 | 1.5 |
| 2015-01-01_01:18:12 | 33.9 |
| 2015-01-01_01:18:13 | 22.2 |
| 2015-01-01_01:18:14 | 7.5 |
| 2015-01-01_01:18:15 | 27.7 |
| 2015-01-01_01:18:16 | 20.8 |
| 2015-01-01_01:18:17 | 4.8 |
| 2015-01-01_01:18:18 | 13.4 |
| 2015-01-01_01:18:19 | 18.8 |
| 2015-01-01_01:18:20 | 11.1 |
| 2015-01-01_01:18:21 | 10.7 |
| 2015-01-01_01:18:22 | 13.1 |
| 2015-01-01_01:18:23 | 4.3 |
| 2015-01-01_01:18:24 | 5.9 |
| 2015-01-01_01:18:25 | 11.3 |
| 2015-01-01_01:18:26 | 9.2 |
| 2015-01-01_01:18:27 | 7.4 |
| 2015-01-01_01:18:28 | 6.7 |
| 2015-01-01_01:18:29 | 7.8 |
| 2015-01-01_01:18:30 | 10.2 |
| 2015-01-01_01:18:31 | 5.7 |
| 2015-01-01_01:18:32 | 1.2 |
| 2015-01-01_01:18:33 | 6.6 |
| 2015-01-01_01:18:34 | 7.6 |
| 2015-01-01_01:18:35 | 9.2 |
| 2015-01-01_01:18:36 | 7.4 |
| 2015-01-01_01:18:37 | 6.5 |
| 2015-01-01_01:18:38 | 5.7 |
| 2015-01-01_01:18:39 | 5 |
| 2015-01-01_01:18:40 | 3.1 |
| 2015-01-01_01:18:41 | 2.9 |
| 2015-01-01_01:18:42 | 2.8 |
| 2015-01-01_01:18:43 | 2.9 |
| 2015-01-01_01:18:44 | 3.1 |
| 2015-01-01_01:18:45 | 5.4 |
| 2015-01-01_01:18:46 | 7.2 |
| 2015-01-01_01:18:47 | 6.6 |
| 2015-01-01_01:18:48 | 4.6 |
| 2015-01-01_01:18:49 | 4.6 |
| 2015-01-01_01:18:50 | 4.8 |
| 2015-01-01_01:18:51 | 5.7 |
| 2015-01-01_01:18:52 | 4.8 |
| 2015-01-01_01:18:53 | 5.2 |
| 2015-01-01_01:18:54 | 6.2 |
| 2015-01-01_01:18:55 | 4.7 |
| 2015-01-01_01:18:56 | 5.5 |
| 2015-01-01_01:18:57 | 7 |
| 2015-01-01_01:18:58 | 7.4 |
| 2015-01-01_01:18:59 | 7.2 |
| 2015-01-01_01:19:00 | 6.7 |
| 2015-01-01_01:19:01 | 6.7 |
| 2015-01-01_01:19:02 | 6 |
| 2015-01-01_01:19:03 | 7 |
| 2015-01-01_01:19:04 | 5.8 |
| 2015-01-01_01:19:05 | 3.5 |
| 2015-01-01_01:19:06 | 4.9 |
| 2015-01-01_01:19:07 | 7.4 |
| 2015-01-01_01:19:08 | 7.2 |
| 2015-01-01_01:19:09 | 6.1 |
| 2015-01-01_01:19:10 | 1.4 |
| 2015-01-01_01:19:11 | 3.4 |
| 2015-01-01_01:19:12 | 4.1 |
| 2015-01-01_01:19:13 | 3.9 |
| 2015-01-01_01:19:14 | 4.1 |
| 2015-01-01_01:19:15 | 4 |
| 2015-01-01_01:19:16 | 3.9 |
| 2015-01-01_01:19:17 | 3.6 |
| 2015-01-01_01:19:18 | 3.1 |
| 2015-01-01_01:19:19 | 3.1 |
| 2015-01-01_01:19:20 | 3.8 |
| 2015-01-01_01:19:21 | 4.8 |
| 2015-01-01_01:19:22 | 4.7 |
| 2015-01-01_01:19:23 | 4.1 |
| 2015-01-01_01:19:24 | 5.2 |
| 2015-01-01_01:19:25 | 5.5 |
| 2015-01-01_01:19:26 | 5.1 |
| 2015-01-01_01:19:27 | 5 |
| 2015-01-01_01:19:28 | 5.3 |
| 2015-01-01_01:19:29 | 4.2 |
| 2015-01-01_01:19:30 | 2.8 |
| 2015-01-01_01:19:31 | 2.2 |
| 2015-01-01_01:19:32 | 2.3 |
| 2015-01-01_01:19:33 | 2.3 |
| 2015-01-01_01:19:34 | 2.9 |
| 2015-01-01_01:19:35 | 0.7 |
| 2015-01-01_01:19:36 | 0 |
| 2015-01-01_01:19:37 | 0 |
| 2015-01-01_01:19:38 | 0 |
| 2015-01-01_01:19:39 | 0 |
| 2015-01-01_01:19:40 | 0 |
| 2015-01-01_01:19:41 | 0 |
| 2015-01-01_01:19:42 | 0 |
| 2015-01-01_01:19:43 | 0 |
| 2015-01-01_01:19:44 | 0 |
| 2015-01-01_01:19:45 | 0.2 |
| 2015-01-01_01:19:46 | 0.1 |
| 2015-01-01_01:19:47 | 0 |
| 2015-01-01_01:19:48 | 0 |
| 2015-01-01_01:19:49 | 3 |
| 2015-01-01_01:19:50 | 5.9 |
| 2015-01-01_01:19:51 | 5.2 |
| 2015-01-01_01:19:52 | 4.6 |
| 2015-01-01_01:19:53 | 4.1 |
| 2015-01-01_01:19:54 | 3.5 |
| 2015-01-01_01:19:55 | 3.3 |
| 2015-01-01_01:19:56 | 3.6 |
| 2015-01-01_01:19:57 | 3.1 |
| 2015-01-01_01:19:58 | 3.7 |
| 2015-01-01_01:19:59 | 5.8 |
| 2015-01-01_01:20:00 | 5.1 |
| 2015-01-01_01:20:01 | 4.3 |
| 2015-01-01_01:20:02 | 3.1 |
| 2015-01-01_01:20:03 | 4.1 |
| 2015-01-01_01:20:04 | 6 |
| 2015-01-01_01:20:05 | 5.7 |
| 2015-01-01_01:20:06 | 6.4 |
| 2015-01-01_01:20:07 | 6.8 |
| 2015-01-01_01:20:08 | 7.3 |
| 2015-01-01_01:20:09 | 6.1 |
| 2015-01-01_01:20:10 | 4.6 |
| 2015-01-01_01:20:11 | 3.9 |
| 2015-01-01_01:20:12 | 3.2 |
| 2015-01-01_01:20:13 | 2.4 |
| 2015-01-01_01:20:14 | 4.4 |
| 2015-01-01_01:20:15 | 5 |
| 2015-01-01_01:20:16 | 5.5 |
| 2015-01-01_01:20:17 | 5 |
| 2015-01-01_01:20:18 | 4.9 |
| 2015-01-01_01:20:19 | 5.5 |
| 2015-01-01_01:20:20 | 5.5 |
| 2015-01-01_01:20:21 | 5 |
| 2015-01-01_01:20:22 | 2.7 |
| 2015-01-01_01:20:23 | 2.4 |
| 2015-01-01_01:20:24 | 2.2 |
| 2015-01-01_01:20:25 | 2.2 |
| 2015-01-01_01:20:26 | 2.4 |
| 2015-01-01_01:20:27 | 3.4 |
| 2015-01-01_01:20:28 | 4.3 |
| 2015-01-01_01:20:29 | 4.9 |
| 2015-01-01_01:20:30 | 1.8 |
| 2015-01-01_01:20:31 | 2.2 |
| 2015-01-01_01:20:32 | 2.7 |
| 2015-01-01_01:20:33 | 3.2 |
| 2015-01-01_01:20:34 | 2.7 |
| 2015-01-01_01:20:35 | 3.2 |
| 2015-01-01_01:20:36 | 2.6 |
| 2015-01-01_01:20:37 | 4 |
| 2015-01-01_01:20:38 | 2.6 |
| 2015-01-01_01:20:39 | 3.7 |
| 2015-01-01_01:20:40 | 2 |
| 2015-01-01_01:20:41 | 2.2 |
| 2015-01-01_01:20:42 | 2.1 |
| 2015-01-01_01:20:43 | 2.5 |
| 2015-01-01_01:20:44 | 4 |
| 2015-01-01_01:20:45 | 3.7 |
| 2015-01-01_01:20:46 | 3.7 |
| 2015-01-01_01:20:47 | 5.1 |
| 2015-01-01_01:20:48 | 4.1 |
| 2015-01-01_01:20:49 | 2 |
| 2015-01-01_01:20:50 | 2.9 |
| 2015-01-01_01:20:51 | 4.5 |
| 2015-01-01_01:20:52 | 5.8 |
| 2015-01-01_01:20:53 | 5 |
| 2015-01-01_01:20:54 | 1.6 |
| 2015-01-01_01:20:55 | 1.7 |
| 2015-01-01_01:20:56 | 2.4 |
| 2015-01-01_01:20:57 | 1.7 |
| 2015-01-01_01:20:58 | 2.4 |
| 2015-01-01_01:20:59 | 2.8 |
| 2015-01-01_01:21:00 | 3.1 |
| 2015-01-01_01:21:01 | 2.6 |
| 2015-01-01_01:21:02 | 0.7 |
| 2015-01-01_01:21:03 | 0 |
| 2015-01-01_01:21:04 | 0 |
| 2015-01-01_01:21:05 | 3.6 |
| 2015-01-01_01:21:06 | 6.4 |
| 2015-01-01_01:21:07 | 7 |
| 2015-01-01_01:21:08 | 4.3 |
| 2015-01-01_01:21:09 | 1.3 |
| 2015-01-01_01:21:10 | 0 |
| 2015-01-01_01:21:11 | 1.6 |
| 2015-01-01_01:21:12 | 3.9 |
| 2015-01-01_01:21:13 | 3.4 |
| 2015-01-01_01:21:14 | 3.3 |
| 2015-01-01_01:21:15 | 4.4 |
| 2015-01-01_01:21:16 | 3.7 |
| 2015-01-01_01:21:17 | 4.8 |
| 2015-01-01_01:21:18 | 6.2 |
| 2015-01-01_01:21:19 | 2.4 |
| 2015-01-01_01:21:20 | 3.3 |
| 2015-01-01_01:21:21 | 3.9 |
| 2015-01-01_01:21:22 | 3.9 |
| 2015-01-01_01:21:23 | 1.5 |
| 2015-01-01_01:21:24 | 0 |
| 2015-01-01_01:21:25 | 0 |
| 2015-01-01_01:21:26 | 0.6 |
| 2015-01-01_01:21:27 | 3.2 |
| 2015-01-01_01:21:28 | 0.3 |
| 2015-01-01_01:21:29 | 0 |
| 2015-01-01_01:21:30 | 0.4 |
| 2015-01-01_01:21:31 | 3.6 |
| 2015-01-01_01:21:32 | 3.3 |
| 2015-01-01_01:21:33 | 2.9 |
| 2015-01-01_01:21:34 | 1.8 |
| 2015-01-01_01:21:35 | 1.9 |
| 2015-01-01_01:21:36 | 2.2 |
| 2015-01-01_01:21:37 | 4.6 |
| 2015-01-01_01:21:38 | 5.8 |
| 2015-01-01_01:21:39 | 6.9 |
| 2015-01-01_01:21:40 | 6.5 |
| 2015-01-01_01:21:41 | 5.1 |
| 2015-01-01_01:21:42 | 5.8 |
| 2015-01-01_01:21:43 | 5.7 |
| 2015-01-01_01:21:44 | 4.6 |
| 2015-01-01_01:21:45 | 1.7 |
| 2015-01-01_01:21:46 | 1.2 |
| 2015-01-01_01:21:47 | 2.5 |
| 2015-01-01_01:21:48 | 0 |
| 2015-01-01_01:21:49 | 0 |
| 2015-01-01_01:21:50 | 1.4 |
| 2015-01-01_01:21:51 | 3.9 |
| 2015-01-01_01:21:52 | 5.3 |
| 2015-01-01_01:21:53 | 3.4 |
| 2015-01-01_01:21:54 | 2.1 |
| 2015-01-01_01:21:55 | 2.6 |
| 2015-01-01_01:21:56 | 4.3 |
| 2015-01-01_01:21:57 | 3.3 |
| 2015-01-01_01:21:58 | 2.9 |
| 2015-01-01_01:21:59 | 3.2 |
| 2015-01-01_01:22:00 | 4.1 |
| 2015-01-01_01:22:01 | 4.8 |
| 2015-01-01_01:22:02 | 3.5 |
| 2015-01-01_01:22:03 | 4.6 |
| 2015-01-01_01:22:04 | 5 |
| 2015-01-01_01:22:05 | 6.7 |
| 2015-01-01_01:22:06 | 4.2 |
| 2015-01-01_01:22:07 | 3.4 |
| 2015-01-01_01:22:08 | 4.9 |
| 2015-01-01_01:22:09 | 6.9 |
| 2015-01-01_01:22:10 | 6.7 |
| 2015-01-01_01:22:11 | 6.7 |
| 2015-01-01_01:22:12 | 6.8 |
| 2015-01-01_01:22:13 | 5.6 |
| 2015-01-01_01:22:14 | 4.8 |
| 2015-01-01_01:22:15 | 3.5 |
| 2015-01-01_01:22:16 | 1.2 |
| 2015-01-01_01:22:17 | 0 |
| 2015-01-01_01:22:18 | 0 |
| 2015-01-01_01:22:19 | 0 |
| 2015-01-01_01:22:20 | 0 |
| 2015-01-01_01:22:21 | 0 |
| 2015-01-01_01:22:22 | 0 |
| 2015-01-01_01:22:23 | 0 |
| 2015-01-01_01:22:24 | 0 |
| 2015-01-01_01:22:25 | 0 |
| 2015-01-01_01:22:26 | 0 |
| 2015-01-01_01:22:27 | 2 |
| 2015-01-01_01:22:28 | 6.9 |
| 2015-01-01_01:22:29 | 6.8 |
| 2015-01-01_01:22:30 | 5.8 |
| 2015-01-01_01:22:31 | 5.4 |
| 2015-01-01_01:22:32 | 4.8 |
| 2015-01-01_01:22:33 | 4 |
| 2015-01-01_01:22:34 | 3.3 |
| 2015-01-01_01:22:35 | 4 |
| 2015-01-01_01:22:36 | 3.3 |
| 2015-01-01_01:22:37 | 3.6 |
| 2015-01-01_01:22:38 | 3.6 |
| 2015-01-01_01:22:39 | 3.7 |
| 2015-01-01_01:22:40 | 3.9 |
| 2015-01-01_01:22:41 | 4 |
| 2015-01-01_01:22:42 | 4.1 |
| 2015-01-01_01:22:43 | 3.5 |
| 2015-01-01_01:22:44 | 3.8 |
| 2015-01-01_01:22:45 | 3.1 |
| 2015-01-01_01:22:46 | 3 |
| 2015-01-01_01:22:47 | 4.8 |
| 2015-01-01_01:22:48 | 5 |
| 2015-01-01_01:22:49 | 3.5 |
| 2015-01-01_01:22:50 | 2.4 |
| 2015-01-01_01:22:51 | 0 |
| 2015-01-01_01:22:52 | 3.1 |
| 2015-01-01_01:22:53 | 4.2 |
| 2015-01-01_01:22:54 | 3.1 |
| 2015-01-01_01:22:55 | 2.8 |
| 2015-01-01_01:22:56 | 4.4 |
| 2015-01-01_01:22:57 | 5.9 |
| 2015-01-01_01:22:58 | 6.6 |
| 2015-01-01_01:22:59 | 5.5 |
| 2015-01-01_01:23:00 | 3.3 |
| 2015-01-01_01:23:01 | 3.5 |
| 2015-01-01_01:23:02 | 3.9 |
| 2015-01-01_01:23:03 | 3.8 |
| 2015-01-01_01:23:04 | 2.6 |
| 2015-01-01_01:23:05 | 1.2 |
| 2015-01-01_01:23:06 | 1.2 |
| 2015-01-01_01:23:07 | 2.5 |
| 2015-01-01_01:23:08 | 2.6 |
| 2015-01-01_01:23:09 | 2.6 |
| 2015-01-01_01:23:10 | 2.9 |
| 2015-01-01_01:23:11 | 3.8 |
| 2015-01-01_01:23:12 | 3.3 |
| 2015-01-01_01:23:13 | 3.1 |
| 2015-01-01_01:23:14 | 2.8 |
| 2015-01-01_01:23:15 | 2.9 |
| 2015-01-01_01:23:16 | 3 |
| 2015-01-01_01:23:17 | 3.9 |
| 2015-01-01_01:23:18 | 5.4 |
| 2015-01-01_01:23:19 | 5.4 |
| 2015-01-01_01:23:20 | 4 |
| 2015-01-01_01:23:21 | 3.8 |
| 2015-01-01_01:23:22 | 3.8 |
| 2015-01-01_01:23:23 | 3.8 |
| 2015-01-01_01:23:24 | 3.6 |
| 2015-01-01_01:23:25 | 4 |
| 2015-01-01_01:23:26 | 4.9 |
| 2015-01-01_01:23:27 | 4.4 |
| 2015-01-01_01:23:28 | 5.3 |
| 2015-01-01_01:23:29 | 6.2 |
| 2015-01-01_01:23:30 | 5.1 |
| 2015-01-01_01:23:31 | 3.4 |
| 2015-01-01_01:23:32 | 3.5 |
| 2015-01-01_01:23:33 | 2.8 |
| 2015-01-01_01:23:34 | 3.1 |
| 2015-01-01_01:23:35 | 3.3 |
| 2015-01-01_01:23:36 | 0 |
| 2015-01-01_01:23:37 | 0 |
| 2015-01-01_01:23:38 | 0 |
| 2015-01-01_01:23:39 | 3.1 |
| 2015-01-01_01:23:40 | 3.8 |
| 2015-01-01_01:23:41 | 4.9 |
| 2015-01-01_01:23:42 | 5.9 |
| 2015-01-01_01:23:43 | 3.4 |
| 2015-01-01_01:23:44 | 2.4 |
| 2015-01-01_01:23:45 | 2.6 |
| 2015-01-01_01:23:46 | 2.4 |
| 2015-01-01_01:23:47 | 3.2 |
| 2015-01-01_01:23:48 | 2.8 |
| 2015-01-01_01:23:49 | 2.3 |
| 2015-01-01_01:23:50 | 2.8 |
| 2015-01-01_01:23:51 | 2.8 |
| 2015-01-01_01:23:52 | 2.9 |
| 2015-01-01_01:23:53 | 1.7 |
| 2015-01-01_01:23:54 | 0 |
| 2015-01-01_01:23:55 | 2.8 |
| 2015-01-01_01:23:56 | 2.9 |
| 2015-01-01_01:23:57 | 2.4 |
| 2015-01-01_01:23:58 | 1.4 |
| 2015-01-01_01:23:59 | 4 |
| 2015-01-01_01:24:00 | 5.4 |
| 2015-01-01_01:24:01 | 6 |
| 2015-01-01_01:24:02 | 4.1 |
| 2015-01-01_01:24:03 | 4.3 |
| 2015-01-01_01:24:04 | 5.4 |
| 2015-01-01_01:24:05 | 4.8 |
| 2015-01-01_01:24:06 | 3.7 |
| 2015-01-01_01:24:07 | 1.1 |
| 2015-01-01_01:24:08 | 0 |
| 2015-01-01_01:24:09 | 0 |
| 2015-01-01_01:24:10 | 0 |
| 2015-01-01_01:24:11 | 0 |
| 2015-01-01_01:24:12 | 0 |
| 2015-01-01_01:24:13 | 0.4 |
| 2015-01-01_01:24:14 | 1.9 |
| 2015-01-01_01:24:15 | 2.2 |
| 2015-01-01_01:24:16 | 3.1 |
| 2015-01-01_01:24:17 | 3.2 |
| 2015-01-01_01:24:18 | 4.1 |
| 2015-01-01_01:24:19 | 4.2 |
| 2015-01-01_01:24:20 | 5.1 |
| 2015-01-01_01:24:21 | 6.1 |
| 2015-01-01_01:24:22 | 9.4 |
| 2015-01-01_01:24:23 | 15.5 |
| 2015-01-01_01:24:24 | 15.2 |
| 2015-01-01_01:24:25 | 14.4 |
| 2015-01-01_01:24:26 | 12.5 |
| 2015-01-01_01:24:27 | 13.1 |
| 2015-01-01_01:24:28 | 10.2 |
| 2015-01-01_01:24:29 | 2.3 |
| 2015-01-01_01:24:30 | 5.2 |
| 2015-01-01_01:24:31 | 5.1 |
| 2015-01-01_01:24:32 | 10 |
| 2015-01-01_01:24:33 | 11.7 |
| 2015-01-01_01:24:34 | 18.2 |
| 2015-01-01_01:24:35 | 12.8 |
| 2015-01-01_01:24:36 | 7.9 |
| 2015-01-01_01:24:37 | 5.3 |
| 2015-01-01_01:24:38 | 8.7 |
| 2015-01-01_01:24:39 | 0 |
| 2015-01-01_01:24:40 | 0 |
| 2015-01-01_01:24:41 | 1 |
| 2015-01-01_01:24:42 | 4.5 |
| 2015-01-01_01:24:43 | 3.6 |
| 2015-01-01_01:24:44 | 0.1 |
| 2015-01-01_01:24:45 | 0 |
| 2015-01-01_01:24:46 | 0.7 |
| 2015-01-01_01:24:47 | 1.8 |
| 2015-01-01_01:24:48 | 4.1 |
| 2015-01-01_01:24:49 | 13 |
| 2015-01-01_01:24:50 | 15.8 |
| 2015-01-01_01:24:51 | 6.5 |
| 2015-01-01_01:24:52 | 5.7 |
| 2015-01-01_01:24:53 | 10.2 |
| 2015-01-01_01:24:54 | 11.4 |
| 2015-01-01_01:24:55 | 6.6 |
| 2015-01-01_01:24:56 | 0 |
| 2015-01-01_01:24:57 | 0 |
| 2015-01-01_01:24:58 | 0 |
| 2015-01-01_01:24:59 | 0 |
| 2015-01-01_01:25:00 | 0 |
| 2015-01-01_01:25:01 | 0.3 |
| 2015-01-01_01:25:02 | 2.9 |
| 2015-01-01_01:25:03 | 3 |
| 2015-01-01_01:25:04 | 3.3 |
| 2015-01-01_01:25:05 | 3.5 |
| 2015-01-01_01:25:06 | 4.3 |
| 2015-01-01_01:25:07 | 0.7 |
| 2015-01-01_01:25:08 | 0.6 |
| 2015-01-01_01:25:09 | 0.7 |
| 2015-01-01_01:25:10 | 0.7 |
| 2015-01-01_01:25:11 | 0.7 |
| 2015-01-01_01:25:12 | 0.7 |
| 2015-01-01_01:25:13 | 0.8 |
| 2015-01-01_01:25:14 | 0.6 |
| 2015-01-01_01:25:15 | 0.6 |
| 2015-01-01_01:25:16 | 0.6 |
| 2015-01-01_01:25:17 | 0.6 |
| 2015-01-01_01:25:18 | 0.6 |
| 2015-01-01_01:25:19 | 0.7 |
| 2015-01-01_01:25:20 | 0.6 |
| 2015-01-01_01:25:21 | 0.7 |
| 2015-01-01_01:25:22 | 0.7 |
| 2015-01-01_01:25:23 | 0.6 |
| 2015-01-01_01:25:24 | 0.6 |
| 2015-01-01_01:25:25 | 0.8 |
| 2015-01-01_01:25:26 | 0.6 |
| 2015-01-01_01:25:27 | 0.6 |
| 2015-01-01_01:25:28 | 0.6 |
| 2015-01-01_01:25:29 | 0.7 |
| 2015-01-01_01:25:30 | 0.7 |
| 2015-01-01_01:25:31 | 0.6 |
| 2015-01-01_01:25:32 | 0.6 |
| 2015-01-01_01:25:33 | 0.6 |
| 2015-01-01_01:25:34 | 0.7 |
| 2015-01-01_01:25:35 | 0.7 |
| 2015-01-01_01:25:36 | 0.8 |
| 2015-01-01_01:25:37 | 0.7 |
| 2015-01-01_01:25:38 | 0.6 |
| 2015-01-01_01:25:39 | 0.7 |
| 2015-01-01_01:25:40 | 0.6 |
| 2015-01-01_01:25:41 | 0.6 |
| 2015-01-01_01:25:42 | 0.6 |
| 2015-01-01_01:25:43 | 0.6 |
| 2015-01-01_01:25:44 | 0.6 |
| 2015-01-01_01:25:45 | 0.6 |
| 2015-01-01_01:25:46 | 0.7 |
| 2015-01-01_01:25:47 | 0.6 |
| 2015-01-01_01:25:48 | 0.7 |
| 2015-01-01_01:25:49 | 0.7 |
| 2015-01-01_01:25:50 | 0.7 |
| 2015-01-01_01:25:51 | 0.7 |
| 2015-01-01_01:25:52 | 0.7 |
| 2015-01-01_01:25:53 | 0.7 |
| 2015-01-01_01:25:54 | 0.7 |
| 2015-01-01_01:25:55 | 0.6 |
| 2015-01-01_01:25:56 | 0.7 |
| 2015-01-01_01:25:57 | 0.6 |
| 2015-01-01_01:25:58 | 0.7 |
| 2015-01-01_01:25:59 | 0.8 |
| 2015-01-01_01:26:00 | 0.6 |
| 2015-01-01_01:26:01 | 0.6 |
| 2015-01-01_01:26:02 | 0.6 |
| 2015-01-01_01:26:03 | 0.7 |
| 2015-01-01_01:26:04 | 0.7 |
| 2015-01-01_01:26:05 | 0.9 |
| 2015-01-01_01:26:06 | 22.3 |
| 2015-01-01_01:26:07 | 27.2 |
| 2015-01-01_01:26:08 | 9 |
| 2015-01-01_01:26:09 | 28.7 |
| 2015-01-01_01:26:10 | 27.6 |
| 2015-01-01_01:26:11 | 4.9 |
| 2015-01-01_01:26:12 | 11.9 |
| 2015-01-01_01:26:13 | 13.6 |
| 2015-01-01_01:26:14 | 11.6 |
| 2015-01-01_01:26:15 | 10.8 |
| 2015-01-01_01:26:16 | 4.5 |
| 2015-01-01_01:26:17 | 3.9 |
| 2015-01-01_01:26:18 | 11.5 |
| 2015-01-01_01:26:19 | 15.2 |
| 2015-01-01_01:26:20 | 14.1 |
| 2015-01-01_01:26:21 | 6.8 |
| 2015-01-01_01:26:22 | 4.7 |
| 2015-01-01_01:26:23 | 1.1 |
| 2015-01-01_01:26:24 | 1 |
| 2015-01-01_01:26:25 | 4 |
| 2015-01-01_01:26:26 | 4.4 |
| 2015-01-01_01:26:27 | 5.8 |
| 2015-01-01_01:26:28 | 5.8 |
| 2015-01-01_01:26:29 | 4 |
| 2015-01-01_01:26:30 | 3.1 |
| 2015-01-01_01:26:31 | 0 |
| 2015-01-01_01:26:32 | 0 |
| 2015-01-01_01:26:33 | 1.8 |
| 2015-01-01_01:26:34 | 2.1 |
| 2015-01-01_01:26:35 | 0.4 |
| 2015-01-01_01:26:36 | 0 |
| 2015-01-01_01:26:37 | 0 |
| 2015-01-01_01:26:38 | 0.6 |
| 2015-01-01_01:26:39 | 2.4 |
| 2015-01-01_01:26:40 | 1.9 |
| 2015-01-01_01:26:41 | 5.8 |
| 2015-01-01_01:26:42 | 8.2 |
| 2015-01-01_01:26:43 | 8.1 |
| 2015-01-01_01:26:44 | 5.3 |
| 2015-01-01_01:26:45 | 4.1 |
| 2015-01-01_01:26:46 | 5 |
| 2015-01-01_01:26:47 | 5.5 |
| 2015-01-01_01:26:48 | 5.6 |
| 2015-01-01_01:26:49 | 4.7 |
| 2015-01-01_01:26:50 | 4.1 |
| 2015-01-01_01:26:51 | 3.9 |
| 2015-01-01_01:26:52 | 4.1 |
| 2015-01-01_01:26:53 | 2.3 |
| 2015-01-01_01:26:54 | 0 |
| 2015-01-01_01:26:55 | 0 |
| 2015-01-01_01:26:56 | 0 |
| 2015-01-01_01:26:57 | 0.8 |
| 2015-01-01_01:26:58 | 4 |
| 2015-01-01_01:26:59 | 7 |
| 2015-01-01_01:27:00 | 8.6 |
| 2015-01-01_01:27:01 | 8.9 |
| 2015-01-01_01:27:02 | 6.2 |
| 2015-01-01_01:27:03 | 4.8 |
| 2015-01-01_01:27:04 | 4.7 |
| 2015-01-01_01:27:05 | 4.6 |
| 2015-01-01_01:27:06 | 0.9 |
| 2015-01-01_01:27:07 | 0.2 |
| 2015-01-01_01:27:08 | 4 |
| 2015-01-01_01:27:09 | 7.2 |
| 2015-01-01_01:27:10 | 7.9 |
| 2015-01-01_01:27:11 | 6.8 |
| 2015-01-01_01:27:12 | 5.1 |
| 2015-01-01_01:27:13 | 0.9 |
| 2015-01-01_01:27:14 | 0 |
| 2015-01-01_01:27:15 | 0 |
| 2015-01-01_01:27:16 | 1.3 |
| 2015-01-01_01:27:17 | 0.3 |
| 2015-01-01_01:27:18 | 0 |
| 2015-01-01_01:27:19 | 0 |
| 2015-01-01_01:27:20 | 0 |
| 2015-01-01_01:27:21 | 0 |
| 2015-01-01_01:27:22 | 0 |
| 2015-01-01_01:27:23 | 0 |
| 2015-01-01_01:27:24 | 0.2 |
| 2015-01-01_01:27:25 | 1.7 |
| 2015-01-01_01:27:26 | 1.5 |
| 2015-01-01_01:27:27 | 1.8 |
| 2015-01-01_01:27:28 | 1.9 |
| 2015-01-01_01:27:29 | 2.4 |
| 2015-01-01_01:27:30 | 3.6 |
| 2015-01-01_01:27:31 | 3.5 |
| 2015-01-01_01:27:32 | 0.5 |
| 2015-01-01_01:27:33 | 0.7 |
| 2015-01-01_01:27:34 | 0.6 |
| 2015-01-01_01:27:35 | 0.7 |
| 2015-01-01_01:27:36 | 0.7 |
| 2015-01-01_01:27:37 | 0.7 |
| 2015-01-01_01:27:38 | 0.7 |
| 2015-01-01_01:27:39 | 0.7 |
| 2015-01-01_01:27:40 | 0.7 |
| 2015-01-01_01:27:41 | 0.6 |
| 2015-01-01_01:27:42 | 0.7 |
| 2015-01-01_01:27:43 | 0.6 |
| 2015-01-01_01:27:44 | 0.6 |
| 2015-01-01_01:27:45 | 0.7 |
| 2015-01-01_01:27:46 | 0.6 |
| 2015-01-01_01:27:47 | 0.6 |
| 2015-01-01_01:27:48 | 0.6 |
| 2015-01-01_01:27:49 | 0.7 |
| 2015-01-01_01:27:50 | 1.6 |
| 2015-01-01_01:27:51 | 29.8 |
| 2015-01-01_01:27:52 | 35.5 |
| 2015-01-01_01:27:53 | 9.7 |
| 2015-01-01_01:27:54 | 20.6 |
| 2015-01-01_01:27:55 | 27.7 |
| 2015-01-01_01:27:56 | 9.7 |
| 2015-01-01_01:27:57 | 8.7 |
| 2015-01-01_01:27:58 | 18.5 |
| 2015-01-01_01:27:59 | 7.8 |
| 2015-01-01_01:28:00 | 2.8 |
| 2015-01-01_01:28:01 | 2.7 |
| 2015-01-01_01:28:02 | 5.4 |
| 2015-01-01_01:28:03 | 6.3 |
| 2015-01-01_01:28:04 | 6.1 |
| 2015-01-01_01:28:05 | 9.4 |
| 2015-01-01_01:28:06 | 12 |
| 2015-01-01_01:28:07 | 15.6 |
| 2015-01-01_01:28:08 | 17.9 |
| 2015-01-01_01:28:09 | 4.4 |
| 2015-01-01_01:28:10 | 14.3 |
| 2015-01-01_01:28:11 | 15.4 |
| 2015-01-01_01:28:12 | 8.4 |
| 2015-01-01_01:28:13 | 4.3 |
| 2015-01-01_01:28:14 | 4.7 |
| 2015-01-01_01:28:15 | 4.9 |
| 2015-01-01_01:28:16 | 10.8 |
| 2015-01-01_01:28:17 | 15.2 |
| 2015-01-01_01:28:18 | 11.3 |
| 2015-01-01_01:28:19 | 7.4 |
| 2015-01-01_01:28:20 | 4.9 |
| 2015-01-01_01:28:21 | 0.8 |
| 2015-01-01_01:28:22 | 4.5 |
| 2015-01-01_01:28:23 | 4.7 |
| 2015-01-01_01:28:24 | 3.7 |
| 2015-01-01_01:28:25 | 4.7 |
| 2015-01-01_01:28:26 | 5.2 |
| 2015-01-01_01:28:27 | 5.4 |
| 2015-01-01_01:28:28 | 3.2 |
| 2015-01-01_01:28:29 | 0 |
| 2015-01-01_01:28:30 | 0.2 |
| 2015-01-01_01:28:31 | 0 |
| 2015-01-01_01:28:32 | 0 |
| 2015-01-01_01:28:33 | 0 |
| 2015-01-01_01:28:34 | 1.5 |
| 2015-01-01_01:28:35 | 4.7 |
| 2015-01-01_01:28:36 | 5.8 |
| 2015-01-01_01:28:37 | 5.1 |
| 2015-01-01_01:28:38 | 3.8 |
| 2015-01-01_01:28:39 | 3.1 |
| 2015-01-01_01:28:40 | 2.8 |
| 2015-01-01_01:28:41 | 2.5 |
| 2015-01-01_01:28:42 | 3.3 |
| 2015-01-01_01:28:43 | 0 |
| 2015-01-01_01:28:44 | 0 |
| 2015-01-01_01:28:45 | 0 |
| 2015-01-01_01:28:46 | 0 |
| 2015-01-01_01:28:47 | 0 |
| 2015-01-01_01:28:48 | 0 |
| 2015-01-01_01:28:49 | 0 |
| 2015-01-01_01:28:50 | 0 |
| 2015-01-01_01:28:51 | 0 |
| 2015-01-01_01:28:52 | 1.6 |
| 2015-01-01_01:28:53 | 3.2 |
| 2015-01-01_01:28:54 | 3.6 |
| 2015-01-01_01:28:55 | 2.8 |
| 2015-01-01_01:28:56 | 4.7 |
| 2015-01-01_01:28:57 | 5.8 |
| 2015-01-01_01:28:58 | 6.6 |
| 2015-01-01_01:28:59 | 7.3 |
| 2015-01-01_01:29:00 | 12.1 |
| 2015-01-01_01:29:01 | 15.9 |
| 2015-01-01_01:29:02 | 16 |
| 2015-01-01_01:29:03 | 15 |
| 2015-01-01_01:29:04 | 7 |
| 2015-01-01_01:29:05 | 0.1 |
| 2015-01-01_01:29:06 | 2.9 |
| 2015-01-01_01:29:07 | 6.3 |
| 2015-01-01_01:29:08 | 5.7 |
| 2015-01-01_01:29:09 | 4 |
| 2015-01-01_01:29:10 | 5.4 |
| 2015-01-01_01:29:11 | 4.8 |
| 2015-01-01_01:29:12 | 0 |
| 2015-01-01_01:29:13 | 1.6 |
| 2015-01-01_01:29:14 | 4 |
| 2015-01-01_01:29:15 | 4.9 |
| 2015-01-01_01:29:16 | 4.6 |
| 2015-01-01_01:29:17 | 5.2 |
| 2015-01-01_01:29:18 | 5.4 |
| 2015-01-01_01:29:19 | 6.7 |
| 2015-01-01_01:29:20 | 5.1 |
| 2015-01-01_01:29:21 | 3.1 |
| 2015-01-01_01:29:22 | 3.6 |
| 2015-01-01_01:29:23 | 4.6 |
| 2015-01-01_01:29:24 | 4.9 |
| 2015-01-01_01:29:25 | 5.3 |
| 2015-01-01_01:29:26 | 5.8 |
| 2015-01-01_01:29:27 | 4.6 |
| 2015-01-01_01:29:28 | 0 |
| 2015-01-01_01:29:29 | 0.4 |
| 2015-01-01_01:29:30 | 3.5 |
| 2015-01-01_01:29:31 | 5.5 |
| 2015-01-01_01:29:32 | 5.3 |
| 2015-01-01_01:29:33 | 5.8 |
| 2015-01-01_01:29:34 | 6.3 |
| 2015-01-01_01:29:35 | 3.6 |
| 2015-01-01_01:29:36 | 3.6 |
| 2015-01-01_01:29:37 | 3.7 |
| 2015-01-01_01:29:38 | 5.9 |
| 2015-01-01_01:29:39 | 11.8 |
| 2015-01-01_01:29:40 | 4.5 |
| 2015-01-01_01:29:41 | 2.8 |
| 2015-01-01_01:29:42 | 5.9 |
| 2015-01-01_01:29:43 | 3.7 |
| 2015-01-01_01:29:44 | 2.6 |
| 2015-01-01_01:29:45 | 0 |
| 2015-01-01_01:29:46 | 0 |
| 2015-01-01_01:29:47 | 0 |
| 2015-01-01_01:29:48 | 1.8 |
| 2015-01-01_01:29:49 | 4.4 |
| 2015-01-01_01:29:50 | 4.8 |
| 2015-01-01_01:29:51 | 2.5 |
| 2015-01-01_01:29:52 | 2.2 |
| 2015-01-01_01:29:53 | 2.3 |
| 2015-01-01_01:29:54 | 2.5 |
| 2015-01-01_01:29:55 | 0.8 |
| 2015-01-01_01:29:56 | 1.7 |
| 2015-01-01_01:29:57 | 4 |
| 2015-01-01_01:29:58 | 4.4 |
| 2015-01-01_01:29:59 | 2.8 |
| 2015-01-01_01:30:00 | 2.7 |
| 2015-01-01_01:30:01 | 3.8 |
| 2015-01-01_01:30:02 | 2.8 |
| 2015-01-01_01:30:03 | 2 |
| 2015-01-01_01:30:04 | 1.7 |
| 2015-01-01_01:30:05 | 2.1 |
| 2015-01-01_01:30:06 | 4 |
| 2015-01-01_01:30:07 | 5.9 |
| 2015-01-01_01:30:08 | 5.6 |
| 2015-01-01_01:30:09 | 5.1 |
| 2015-01-01_01:30:10 | 4.1 |
| 2015-01-01_01:30:11 | 1 |
| 2015-01-01_01:30:12 | 0.9 |
| 2015-01-01_01:30:13 | 2.9 |
| 2015-01-01_01:30:14 | 0.6 |
| 2015-01-01_01:30:15 | 0 |
| 2015-01-01_01:30:16 | 0.1 |
| 2015-01-01_01:30:17 | 2.6 |
| 2015-01-01_01:30:18 | 4.2 |
| 2015-01-01_01:30:19 | 4.8 |
| 2015-01-01_01:30:20 | 5.4 |
| 2015-01-01_01:30:21 | 4.6 |
| 2015-01-01_01:30:22 | 2.7 |
| 2015-01-01_01:30:23 | 2.1 |
| 2015-01-01_01:30:24 | 3 |
| 2015-01-01_01:30:25 | 4.1 |
| 2015-01-01_01:30:26 | 4 |
| 2015-01-01_01:30:27 | 3.2 |
| 2015-01-01_01:30:28 | 5.2 |
| 2015-01-01_01:30:29 | 5.1 |
| 2015-01-01_01:30:30 | 2.5 |
| 2015-01-01_01:30:31 | 2.9 |
| 2015-01-01_01:30:32 | 2.2 |
| 2015-01-01_01:30:33 | 1.8 |
| 2015-01-01_01:30:34 | 2.7 |
| 2015-01-01_01:30:35 | 4.2 |
| 2015-01-01_01:30:36 | 3.4 |
| 2015-01-01_01:30:37 | 2.7 |
| 2015-01-01_01:30:38 | 2.6 |
| 2015-01-01_01:30:39 | 2.8 |
| 2015-01-01_01:30:40 | 1.8 |
| 2015-01-01_01:30:41 | 0 |
| 2015-01-01_01:30:42 | 0 |
| 2015-01-01_01:30:43 | 0 |
| 2015-01-01_01:30:44 | 0 |
| 2015-01-01_01:30:45 | 0.3 |
| 2015-01-01_01:30:46 | 0.8 |
| 2015-01-01_01:30:47 | 1.9 |
| 2015-01-01_01:30:48 | 7.3 |
| 2015-01-01_01:30:49 | 9 |
| 2015-01-01_01:30:50 | 6.4 |
| 2015-01-01_01:30:51 | 5.9 |
| 2015-01-01_01:30:52 | 5.5 |
| 2015-01-01_01:30:53 | 5.9 |
| 2015-01-01_01:30:54 | 6.5 |
| 2015-01-01_01:30:55 | 5.3 |
| 2015-01-01_01:30:56 | 1.4 |
| 2015-01-01_01:30:57 | 0 |
| 2015-01-01_01:30:58 | 0 |
| 2015-01-01_01:30:59 | 0 |
| 2015-01-01_01:31:00 | 0 |
| 2015-01-01_01:31:01 | 0 |
| 2015-01-01_01:31:02 | 0 |
| 2015-01-01_01:31:03 | 0 |
| 2015-01-01_01:31:04 | 2.7 |
| 2015-01-01_01:31:05 | 7.9 |
| 2015-01-01_01:31:06 | 0.9 |
| 2015-01-01_01:31:07 | 0 |
| 2015-01-01_01:31:08 | 0 |
| 2015-01-01_01:31:09 | 0 |
| 2015-01-01_01:31:10 | 0 |
| 2015-01-01_01:31:11 | 0 |
| 2015-01-01_01:31:12 | 0 |
| 2015-01-01_01:31:13 | 0 |
| 2015-01-01_01:31:14 | 0 |
| 2015-01-01_01:31:15 | 0.9 |
| 2015-01-01_01:31:16 | 1.2 |
| 2015-01-01_01:31:17 | 1.3 |
| 2015-01-01_01:31:18 | 1.4 |
| 2015-01-01_01:31:19 | 1.2 |
| 2015-01-01_01:31:20 | 1.5 |
| 2015-01-01_01:31:21 | 1.4 |
| 2015-01-01_01:31:22 | 1.7 |
| 2015-01-01_01:31:23 | 1.5 |
| 2015-01-01_01:31:24 | 1.9 |
| 2015-01-01_01:31:25 | 1.8 |
| 2015-01-01_01:31:26 | 1.9 |
| 2015-01-01_01:31:27 | 2.3 |
| 2015-01-01_01:31:28 | 2.1 |
| 2015-01-01_01:31:29 | 2.5 |
| 2015-01-01_01:31:30 | 2.8 |
| 2015-01-01_01:31:31 | 3.7 |
| 2015-01-01_01:31:32 | 4 |
| 2015-01-01_01:31:33 | 4.4 |
| 2015-01-01_01:31:34 | 0.7 |
| 2015-01-01_01:31:35 | 0.7 |
| 2015-01-01_01:31:36 | 0.6 |
| 2015-01-01_01:31:37 | 0.7 |
| 2015-01-01_01:31:38 | 0.7 |
| 2015-01-01_01:31:39 | 0.6 |
| 2015-01-01_01:31:40 | 0.6 |
| 2015-01-01_01:31:41 | 0.6 |
| 2015-01-01_01:31:42 | 0.6 |
| 2015-01-01_01:31:43 | 0.7 |
| 2015-01-01_01:31:44 | 0.7 |
| 2015-01-01_01:31:45 | 0.6 |
| 2015-01-01_01:31:46 | 0.7 |
| 2015-01-01_01:31:47 | 0.7 |
| 2015-01-01_01:31:48 | 0.7 |
| 2015-01-01_01:31:49 | 0.6 |
| 2015-01-01_01:31:50 | 0.6 |
| 2015-01-01_01:31:51 | 0.7 |
| 2015-01-01_01:31:52 | 0.6 |
| 2015-01-01_01:31:53 | 0.6 |
| 2015-01-01_01:31:54 | 0.7 |
| 2015-01-01_01:31:55 | 0.6 |
| 2015-01-01_01:31:56 | 0.6 |
| 2015-01-01_01:31:57 | 0.6 |
| 2015-01-01_01:31:58 | 0.6 |
| 2015-01-01_01:31:59 | 0.7 |
| 2015-01-01_01:32:00 | 0.7 |
| 2015-01-01_01:32:01 | 0.6 |
| 2015-01-01_01:32:02 | 0.7 |
| 2015-01-01_01:32:03 | 0.6 |
| 2015-01-01_01:32:04 | 0.6 |
| 2015-01-01_01:32:05 | 0.7 |
| 2015-01-01_01:32:06 | 0.7 |
| 2015-01-01_01:32:07 | 0.6 |
| 2015-01-01_01:32:08 | 0.6 |
| 2015-01-01_01:32:09 | 0.6 |
| 2015-01-01_01:32:10 | 0.6 |
| 2015-01-01_01:32:11 | 0.6 |
| 2015-01-01_01:32:12 | 0.8 |
| 2015-01-01_01:32:13 | 1.2 |
| 2015-01-01_01:32:14 | 26.1 |
| 2015-01-01_01:32:15 | 31.8 |
| 2015-01-01_01:32:16 | 8.5 |
| 2015-01-01_01:32:17 | 26.8 |
| 2015-01-01_01:32:18 | 17.4 |
| 2015-01-01_01:32:19 | 3.2 |
| 2015-01-01_01:32:20 | 9.3 |
| 2015-01-01_01:32:21 | 10.9 |
| 2015-01-01_01:32:22 | 10.6 |
| 2015-01-01_01:32:23 | 12.7 |
| 2015-01-01_01:32:24 | 9.9 |
| 2015-01-01_01:32:25 | 2.2 |
| 2015-01-01_01:32:26 | 9.4 |
| 2015-01-01_01:32:27 | 10.6 |
| 2015-01-01_01:32:28 | 6.2 |
| 2015-01-01_01:32:29 | 3.6 |
| 2015-01-01_01:32:30 | 2.4 |
| 2015-01-01_01:32:31 | 4.2 |
| 2015-01-01_01:32:32 | 5.7 |
| 2015-01-01_01:32:33 | 8.4 |
| 2015-01-01_01:32:34 | 6.7 |
| 2015-01-01_01:32:35 | 4.7 |
| 2015-01-01_01:32:36 | 5 |
| 2015-01-01_01:32:37 | 9 |
| 2015-01-01_01:32:38 | 9.9 |
| 2015-01-01_01:32:39 | 2.6 |
| 2015-01-01_01:32:40 | 1.5 |
| 2015-01-01_01:32:41 | 6.6 |
| 2015-01-01_01:32:42 | 6.9 |
| 2015-01-01_01:32:43 | 3.5 |
| 2015-01-01_01:32:44 | 0 |
| 2015-01-01_01:32:45 | 0 |
| 2015-01-01_01:32:46 | 0 |
| 2015-01-01_01:32:47 | 0 |
| 2015-01-01_01:32:48 | 0 |
| 2015-01-01_01:32:49 | 1.3 |
| 2015-01-01_01:32:50 | 3.3 |
| 2015-01-01_01:32:51 | 6 |
| 2015-01-01_01:32:52 | 7.1 |
| 2015-01-01_01:32:53 | 4.7 |
| 2015-01-01_01:32:54 | 3.1 |
| 2015-01-01_01:32:55 | 4.4 |
| 2015-01-01_01:32:56 | 4.1 |
| 2015-01-01_01:32:57 | 2.6 |
| 2015-01-01_01:32:58 | 3.6 |
| 2015-01-01_01:32:59 | 5.7 |
| 2015-01-01_01:33:00 | 6.9 |
| 2015-01-01_01:33:01 | 5.1 |
| 2015-01-01_01:33:02 | 0.2 |
| 2015-01-01_01:33:03 | 0 |
| 2015-01-01_01:33:04 | 0 |
| 2015-01-01_01:33:05 | 0 |
| 2015-01-01_01:33:06 | 0 |
| 2015-01-01_01:33:07 | 0 |
| 2015-01-01_01:33:08 | 2 |
| 2015-01-01_01:33:09 | 4.8 |
| 2015-01-01_01:33:10 | 2.5 |
| 2015-01-01_01:33:11 | 8.1 |
| 2015-01-01_01:33:12 | 9.1 |
| 2015-01-01_01:33:13 | 17.3 |
| 2015-01-01_01:33:14 | 14.6 |
| 2015-01-01_01:33:15 | 2.1 |
| 2015-01-01_01:33:16 | 4.4 |
| 2015-01-01_01:33:17 | 4.3 |
| 2015-01-01_01:33:18 | 9 |
| 2015-01-01_01:33:19 | 9.4 |
| 2015-01-01_01:33:20 | 2.3 |
| 2015-01-01_01:33:21 | 0 |
| 2015-01-01_01:33:22 | 0 |
| 2015-01-01_01:33:23 | 0.8 |
| 2015-01-01_01:33:24 | 4.6 |
| 2015-01-01_01:33:25 | 4.4 |
| 2015-01-01_01:33:26 | 3.6 |
| 2015-01-01_01:33:27 | 6 |
| 2015-01-01_01:33:28 | 6.5 |
| 2015-01-01_01:33:29 | 6.1 |
| 2015-01-01_01:33:30 | 1.4 |
| 2015-01-01_01:33:31 | 0 |
| 2015-01-01_01:33:32 | 0 |
| 2015-01-01_01:33:33 | 0 |
| 2015-01-01_01:33:34 | 0 |
| 2015-01-01_01:33:35 | 0 |
| 2015-01-01_01:33:36 | 0 |
| 2015-01-01_01:33:37 | 0 |
| 2015-01-01_01:33:38 | 0 |
| 2015-01-01_01:33:39 | 0 |
| 2015-01-01_01:33:40 | 0 |
| 2015-01-01_01:33:41 | 1.2 |
| 2015-01-01_01:33:42 | 1.6 |
| 2015-01-01_01:33:43 | 1.9 |
| 2015-01-01_01:33:44 | 2.4 |
| 2015-01-01_01:33:45 | 2.8 |
| 2015-01-01_01:33:46 | 3.2 |
| 2015-01-01_01:33:47 | 5.2 |
| 2015-01-01_01:33:48 | 0.7 |
| 2015-01-01_01:33:49 | 6.8 |
| 2015-01-01_01:33:50 | 0.7 |
| 2015-01-01_01:33:51 | 0.6 |
| 2015-01-01_01:33:52 | 0.7 |
| 2015-01-01_01:33:53 | 0.7 |
| 2015-01-01_01:33:54 | 8.5 |
| 2015-01-01_01:33:55 | 6.9 |
| 2015-01-01_01:33:56 | 0.6 |
| 2015-01-01_01:33:57 | 0.7 |
| 2015-01-01_01:33:58 | 0.6 |
| 2015-01-01_01:33:59 | 0.6 |
| 2015-01-01_01:34:00 | 0.6 |
| 2015-01-01_01:34:01 | 0.7 |
| 2015-01-01_01:34:02 | 0.7 |
| 2015-01-01_01:34:03 | 0.7 |
| 2015-01-01_01:34:04 | 0.7 |
| 2015-01-01_01:34:05 | 0.7 |
| 2015-01-01_01:34:06 | 1 |
| 2015-01-01_01:34:07 | 17.6 |
| 2015-01-01_01:34:08 | 18.1 |
| 2015-01-01_01:34:09 | 5.4 |
| 2015-01-01_01:34:10 | 7.3 |
| 2015-01-01_01:34:11 | 4.4 |
| 2015-01-01_01:34:12 | 5.9 |
| 2015-01-01_01:34:13 | 2.2 |
| 2015-01-01_01:34:14 | 3.6 |
| 2015-01-01_01:34:15 | 5.4 |
| 2015-01-01_01:34:16 | 14.4 |
| 2015-01-01_01:34:17 | 30.3 |
| 2015-01-01_01:34:18 | 18.1 |
| 2015-01-01_01:34:19 | 7.2 |
| 2015-01-01_01:34:20 | 17.8 |
| 2015-01-01_01:34:21 | 23.8 |
| 2015-01-01_01:34:22 | 23.2 |
| 2015-01-01_01:34:23 | 7.3 |
| 2015-01-01_01:34:24 | 2.6 |
| 2015-01-01_01:34:25 | 10.4 |
| 2015-01-01_01:34:26 | 13.6 |
| 2015-01-01_01:34:27 | 16.1 |
| 2015-01-01_01:34:28 | 6 |
| 2015-01-01_01:34:29 | 2.6 |
| 2015-01-01_01:34:30 | 10.9 |
| 2015-01-01_01:34:31 | 13.1 |
| 2015-01-01_01:34:32 | 11.1 |
| 2015-01-01_01:34:33 | 10.5 |
| 2015-01-01_01:34:34 | 12.1 |
| 2015-01-01_01:34:35 | 2.3 |
| 2015-01-01_01:34:36 | 3.1 |
| 2015-01-01_01:34:37 | 4.8 |
| 2015-01-01_01:34:38 | 5.3 |
| 2015-01-01_01:34:39 | 5.5 |
| 2015-01-01_01:34:40 | 5.2 |
| 2015-01-01_01:34:41 | 5.3 |
| 2015-01-01_01:34:42 | 5.1 |
| 2015-01-01_01:34:43 | 5 |
| 2015-01-01_01:34:44 | 4.6 |
| 2015-01-01_01:34:45 | 3.9 |
| 2015-01-01_01:34:46 | 3.4 |
| 2015-01-01_01:34:47 | 4.3 |
| 2015-01-01_01:34:48 | 4.5 |
| 2015-01-01_01:34:49 | 3.6 |
| 2015-01-01_01:34:50 | 3 |
| 2015-01-01_01:34:51 | 2.7 |
| 2015-01-01_01:34:52 | 1.6 |
| 2015-01-01_01:34:53 | 1.9 |
| 2015-01-01_01:34:54 | 3.2 |
| 2015-01-01_01:34:55 | 3.4 |
| 2015-01-01_01:34:56 | 4.7 |
| 2015-01-01_01:34:57 | 5.4 |
| 2015-01-01_01:34:58 | 5.9 |
| 2015-01-01_01:34:59 | 6.4 |
| 2015-01-01_01:35:00 | 6.4 |
| 2015-01-01_01:35:01 | 9.4 |
| 2015-01-01_01:35:02 | 9.5 |
| 2015-01-01_01:35:03 | 9.9 |
| 2015-01-01_01:35:04 | 9.4 |
| 2015-01-01_01:35:05 | 8.9 |
| 2015-01-01_01:35:06 | 9.1 |
| 2015-01-01_01:35:07 | 9.2 |
| 2015-01-01_01:35:08 | 9.3 |
| 2015-01-01_01:35:09 | 9.2 |
| 2015-01-01_01:35:10 | 6.6 |
| 2015-01-01_01:35:11 | 5.5 |
| 2015-01-01_01:35:12 | 5.2 |
| 2015-01-01_01:35:13 | 4.7 |
| 2015-01-01_01:35:14 | 4.6 |
| 2015-01-01_01:35:15 | 4.9 |
| 2015-01-01_01:35:16 | 3.7 |
| 2015-01-01_01:35:17 | 0.8 |
| 2015-01-01_01:35:18 | 0 |
| 2015-01-01_01:35:19 | 0 |
| 2015-01-01_01:35:20 | 0 |
| 2015-01-01_01:35:21 | 0 |
| 2015-01-01_01:35:22 | 0 |
| 2015-01-01_01:35:23 | 0 |
| 2015-01-01_01:35:24 | 0 |
| 2015-01-01_01:35:25 | 0 |
| 2015-01-01_01:35:26 | 0 |
| 2015-01-01_01:35:27 | 0 |
| 2015-01-01_01:35:28 | 0.7 |
| 2015-01-01_01:35:29 | 3.3 |
| 2015-01-01_01:35:30 | 4.3 |
| 2015-01-01_01:35:31 | 1.9 |
| 2015-01-01_01:35:32 | 0.7 |
| 2015-01-01_01:35:33 | 0.7 |
| 2015-01-01_01:35:34 | 3.1 |
| 2015-01-01_01:35:35 | 2.8 |
| 2015-01-01_01:35:36 | 3.2 |
| 2015-01-01_01:35:37 | 3.4 |
| 2015-01-01_01:35:38 | 3.3 |
| 2015-01-01_01:35:39 | 2.8 |
| 2015-01-01_01:35:40 | 2.5 |
| 2015-01-01_01:35:41 | 2.8 |
| 2015-01-01_01:35:42 | 2.7 |
| 2015-01-01_01:35:43 | 1.3 |
| 2015-01-01_01:35:44 | 0 |
| 2015-01-01_01:35:45 | 2.4 |
| 2015-01-01_01:35:46 | 3.3 |
| 2015-01-01_01:35:47 | 1.9 |
| 2015-01-01_01:35:48 | 0.2 |
| 2015-01-01_01:35:49 | 0 |
| 2015-01-01_01:35:50 | 0 |
| 2015-01-01_01:35:51 | 0 |
| 2015-01-01_01:35:52 | 0 |
| 2015-01-01_01:35:53 | 0.3 |
| 2015-01-01_01:35:54 | 0 |
| 2015-01-01_01:35:55 | 0 |
| 2015-01-01_01:35:56 | 0 |
| 2015-01-01_01:35:57 | 0 |
| 2015-01-01_01:35:58 | 1.2 |
| 2015-01-01_01:35:59 | 0 |
| 2015-01-01_01:36:00 | 0.9 |
| 2015-01-01_01:36:01 | 5.9 |
| 2015-01-01_01:36:02 | 9.7 |
| 2015-01-01_01:36:03 | 11.6 |
| 2015-01-01_01:36:04 | 14 |
| 2015-01-01_01:36:05 | 9.1 |
| 2015-01-01_01:36:06 | 4.6 |
| 2015-01-01_01:36:07 | 3.5 |
| 2015-01-01_01:36:08 | 4.7 |
| 2015-01-01_01:36:09 | 4.9 |
| 2015-01-01_01:36:10 | 1.3 |
| 2015-01-01_01:36:11 | 0.6 |
| 2015-01-01_01:36:12 | 3.7 |
| 2015-01-01_01:36:13 | 4.9 |
| 2015-01-01_01:36:14 | 4.6 |
| 2015-01-01_01:36:15 | 3.2 |
| 2015-01-01_01:36:16 | 2.6 |
| 2015-01-01_01:36:17 | 2.5 |
| 2015-01-01_01:36:18 | 4.3 |
| 2015-01-01_01:36:19 | 7.7 |
| 2015-01-01_01:36:20 | 6.7 |
| 2015-01-01_01:36:21 | 4.5 |
| 2015-01-01_01:36:22 | 3.4 |
| 2015-01-01_01:36:23 | 3.4 |
| 2015-01-01_01:36:24 | 3.4 |
| 2015-01-01_01:36:25 | 4.8 |
| 2015-01-01_01:36:26 | 4.4 |
| 2015-01-01_01:36:27 | 4.6 |
| 2015-01-01_01:36:28 | 4.4 |
| 2015-01-01_01:36:29 | 3.6 |
| 2015-01-01_01:36:30 | 3.7 |
| 2015-01-01_01:36:31 | 4 |
| 2015-01-01_01:36:32 | 3.9 |
| 2015-01-01_01:36:33 | 3.6 |
| 2015-01-01_01:36:34 | 3.6 |
| 2015-01-01_01:36:35 | 2.9 |
| 2015-01-01_01:36:36 | 2.1 |
| 2015-01-01_01:36:37 | 2.3 |
| 2015-01-01_01:36:38 | 2.4 |
| 2015-01-01_01:36:39 | 2.3 |
| 2015-01-01_01:36:40 | 2.1 |
| 2015-01-01_01:36:41 | 2.4 |
| 2015-01-01_01:36:42 | 2.4 |
| 2015-01-01_01:36:43 | 2.2 |
| 2015-01-01_01:36:44 | 2.4 |
| 2015-01-01_01:36:45 | 2.5 |
| 2015-01-01_01:36:46 | 2.6 |
| 2015-01-01_01:36:47 | 2.5 |
| 2015-01-01_01:36:48 | 2.6 |
| 2015-01-01_01:36:49 | 2.9 |
| 2015-01-01_01:36:50 | 2.9 |
| 2015-01-01_01:36:51 | 3.6 |
| 2015-01-01_01:36:52 | 1.6 |
| 2015-01-01_01:36:53 | 0 |
| 2015-01-01_01:36:54 | 0 |
| 2015-01-01_01:36:55 | 3.2 |
| 2015-01-01_01:36:56 | 12.6 |
| 2015-01-01_01:36:57 | 17.5 |
| 2015-01-01_01:36:58 | 18.7 |
| 2015-01-01_01:36:59 | 17.3 |
| 2015-01-01_01:37:00 | 10.2 |
| 2015-01-01_01:37:01 | 6.8 |
| 2015-01-01_01:37:02 | 2.2 |
| 2015-01-01_01:37:03 | 4.9 |
| 2015-01-01_01:37:04 | 5.3 |
| 2015-01-01_01:37:05 | 5.9 |
| 2015-01-01_01:37:06 | 1.5 |
| 2015-01-01_01:37:07 | 0 |
| 2015-01-01_01:37:08 | 0 |
| 2015-01-01_01:37:09 | 0 |
| 2015-01-01_01:37:10 | 0 |
| 2015-01-01_01:37:11 | 0 |
| 2015-01-01_01:37:12 | 0.9 |
| 2015-01-01_01:37:13 | 1.8 |
| 2015-01-01_01:37:14 | 1.7 |
| 2015-01-01_01:37:15 | 2 |
| 2015-01-01_01:37:16 | 1.7 |
| 2015-01-01_01:37:17 | 2 |
| 2015-01-01_01:37:18 | 2.3 |
| 2015-01-01_01:37:19 | 2.2 |
| 2015-01-01_01:37:20 | 2.4 |
| 2015-01-01_01:37:21 | 7.4 |
| 2015-01-01_01:37:22 | 15.3 |
| 2015-01-01_01:37:23 | 5.6 |
| 2015-01-01_01:37:24 | 5.3 |
| 2015-01-01_01:37:25 | 16.3 |
| 2015-01-01_01:37:26 | 19.6 |
| 2015-01-01_01:37:27 | 4.2 |
| 2015-01-01_01:37:28 | 7.4 |
| 2015-01-01_01:37:29 | 7.9 |
| 2015-01-01_01:37:30 | 14.2 |
| 2015-01-01_01:37:31 | 14.5 |
| 2015-01-01_01:37:32 | 10.5 |
| 2015-01-01_01:37:33 | 23.4 |
| 2015-01-01_01:37:34 | 6.6 |
| 2015-01-01_01:37:35 | 9.4 |
| 2015-01-01_01:37:36 | 16.4 |
| 2015-01-01_01:37:37 | 9.1 |
| 2015-01-01_01:37:38 | 6.1 |
| 2015-01-01_01:37:39 | 4.2 |
| 2015-01-01_01:37:40 | 4.4 |
| 2015-01-01_01:37:41 | 7 |
| 2015-01-01_01:37:42 | 18.4 |
| 2015-01-01_01:37:43 | 16.3 |
| 2015-01-01_01:37:44 | 3.5 |
| 2015-01-01_01:37:45 | 7.1 |
| 2015-01-01_01:37:46 | 13.7 |
| 2015-01-01_01:37:47 | 9 |
| 2015-01-01_01:37:48 | 6.7 |
| 2015-01-01_01:37:49 | 4.9 |
| 2015-01-01_01:37:50 | 3.3 |
| 2015-01-01_01:37:51 | 3.1 |
| 2015-01-01_01:37:52 | 2.7 |
| 2015-01-01_01:37:53 | 0 |
| 2015-01-01_01:37:54 | 0 |
| 2015-01-01_01:37:55 | 1.9 |
| 2015-01-01_01:37:56 | 5 |
| 2015-01-01_01:37:57 | 6.9 |
| 2015-01-01_01:37:58 | 5.9 |
| 2015-01-01_01:37:59 | 4.4 |
| 2015-01-01_01:38:00 | 0.6 |
| 2015-01-01_01:38:01 | 4.1 |
| 2015-01-01_01:38:02 | 5.6 |
| 2015-01-01_01:38:03 | 3.9 |
| 2015-01-01_01:38:04 | 0 |
| 2015-01-01_01:38:05 | 0 |
| 2015-01-01_01:38:06 | 0 |
| 2015-01-01_01:38:07 | 0 |
| 2015-01-01_01:38:08 | 2.8 |
| 2015-01-01_01:38:09 | 2.3 |
| 2015-01-01_01:38:10 | 2 |
| 2015-01-01_01:38:11 | 3.3 |
| 2015-01-01_01:38:12 | 2.2 |
| 2015-01-01_01:38:13 | 6.2 |
| 2015-01-01_01:38:14 | 6.4 |
| 2015-01-01_01:38:15 | 4.9 |
| 2015-01-01_01:38:16 | 9.7 |
| 2015-01-01_01:38:17 | 10.7 |
| 2015-01-01_01:38:18 | 6.4 |
| 2015-01-01_01:38:19 | 6.4 |
| 2015-01-01_01:38:20 | 5.3 |
| 2015-01-01_01:38:21 | 0.6 |
| 2015-01-01_01:38:22 | 3.3 |
| 2015-01-01_01:38:23 | 3.7 |
| 2015-01-01_01:38:24 | 2.1 |
| 2015-01-01_01:38:25 | 0 |
| 2015-01-01_01:38:26 | 0 |
| 2015-01-01_01:38:27 | 2.1 |
| 2015-01-01_01:38:28 | 3.1 |
| 2015-01-01_01:38:29 | 2.5 |
| 2015-01-01_01:38:30 | 2.7 |
| 2015-01-01_01:38:31 | 1.7 |
| 2015-01-01_01:38:32 | 0.3 |
| 2015-01-01_01:38:33 | 0 |
| 2015-01-01_01:38:34 | 0 |
| 2015-01-01_01:38:35 | 3 |
| 2015-01-01_01:38:36 | 2 |
| 2015-01-01_01:38:37 | 0.8 |
| 2015-01-01_01:38:38 | 3.4 |
| 2015-01-01_01:38:39 | 2.9 |
| 2015-01-01_01:38:40 | 2.4 |
| 2015-01-01_01:38:41 | 2.7 |
| 2015-01-01_01:38:42 | 2.5 |
| 2015-01-01_01:38:43 | 4.9 |
| 2015-01-01_01:38:44 | 6 |
| 2015-01-01_01:38:45 | 8.4 |
| 2015-01-01_01:38:46 | 5.9 |
| 2015-01-01_01:38:47 | 3.8 |
| 2015-01-01_01:38:48 | 0 |
| 2015-01-01_01:38:49 | 4.8 |
| 2015-01-01_01:38:50 | 5.6 |
| 2015-01-01_01:38:51 | 5.5 |
| 2015-01-01_01:38:52 | 0 |
| 2015-01-01_01:38:53 | 0 |
| 2015-01-01_01:38:54 | 0.6 |
| 2015-01-01_01:38:55 | 3.5 |
| 2015-01-01_01:38:56 | 1.9 |
| 2015-01-01_01:38:57 | 0 |
| 2015-01-01_01:38:58 | 0 |
| 2015-01-01_01:38:59 | 3.6 |
| 2015-01-01_01:39:00 | 9.2 |
| 2015-01-01_01:39:01 | 3.6 |
| 2015-01-01_01:39:02 | 2.2 |
| 2015-01-01_01:39:03 | 0 |
| 2015-01-01_01:39:04 | 0 |
| 2015-01-01_01:39:05 | 0 |
| 2015-01-01_01:39:06 | 0 |
| 2015-01-01_01:39:07 | 0 |
| 2015-01-01_01:39:08 | 1 |
| 2015-01-01_01:39:09 | 4.2 |
| 2015-01-01_01:39:10 | 13.7 |
| 2015-01-01_01:39:11 | 14.2 |
| 2015-01-01_01:39:12 | 12.6 |
| 2015-01-01_01:39:13 | 12.3 |
| 2015-01-01_01:39:14 | 4 |
| 2015-01-01_01:39:15 | 14.8 |
| 2015-01-01_01:39:16 | 15.7 |
| 2015-01-01_01:39:17 | 3 |
| 2015-01-01_01:39:18 | 0 |
| 2015-01-01_01:39:19 | 0 |
| 2015-01-01_01:39:20 | 0 |
| 2015-01-01_01:39:21 | 0 |
| 2015-01-01_01:39:22 | 0 |
| 2015-01-01_01:39:23 | 0 |
| 2015-01-01_01:39:24 | 0.5 |
| 2015-01-01_01:39:25 | 2.7 |
| 2015-01-01_01:39:26 | 3 |
| 2015-01-01_01:39:27 | 8 |
| 2015-01-01_01:39:28 | 11.8 |
| 2015-01-01_01:39:29 | 11 |
| 2015-01-01_01:39:30 | 5 |
| 2015-01-01_01:39:31 | 6.9 |
| 2015-01-01_01:39:32 | 9.5 |
| 2015-01-01_01:39:33 | 6.1 |
| 2015-01-01_01:39:34 | 3.2 |
| 2015-01-01_01:39:35 | 5.4 |
| 2015-01-01_01:39:36 | 6.1 |
| 2015-01-01_01:39:37 | 0 |
| 2015-01-01_01:39:38 | 3.2 |
| 2015-01-01_01:39:39 | 5.3 |
| 2015-01-01_01:39:40 | 6.4 |
| 2015-01-01_01:39:41 | 3.6 |
| 2015-01-01_01:39:42 | 4.6 |
| 2015-01-01_01:39:43 | 8.8 |
| 2015-01-01_01:39:44 | 8.6 |
| 2015-01-01_01:39:45 | 4.6 |
| 2015-01-01_01:39:46 | 4.1 |
| 2015-01-01_01:39:47 | 4.4 |
| 2015-01-01_01:39:48 | 4.1 |
| 2015-01-01_01:39:49 | 2 |
| 2015-01-01_01:39:50 | 4.6 |
| 2015-01-01_01:39:51 | 3.2 |
| 2015-01-01_01:39:52 | 5.1 |
| 2015-01-01_01:39:53 | 7.2 |
| 2015-01-01_01:39:54 | 10.7 |
| 2015-01-01_01:39:55 | 12.2 |
| 2015-01-01_01:39:56 | 6 |
| 2015-01-01_01:39:57 | 5.2 |
| 2015-01-01_01:39:58 | 5.3 |
| 2015-01-01_01:39:59 | 2.2 |
| 2015-01-01_01:40:00 | 3.1 |
| 2015-01-01_01:40:01 | 5.1 |
| 2015-01-01_01:40:02 | 1.4 |
| 2015-01-01_01:40:03 | 0 |
| 2015-01-01_01:40:04 | 2.3 |
| 2015-01-01_01:40:05 | 7 |
| 2015-01-01_01:40:06 | 3.3 |
| 2015-01-01_01:40:07 | 3.4 |
| 2015-01-01_01:40:08 | 5.1 |
| 2015-01-01_01:40:09 | 7.1 |
| 2015-01-01_01:40:10 | 9.3 |
| 2015-01-01_01:40:11 | 4.6 |
| 2015-01-01_01:40:12 | 6.7 |
| 2015-01-01_01:40:13 | 0.5 |
| 2015-01-01_01:40:14 | 0 |
| 2015-01-01_01:40:15 | 0 |
| 2015-01-01_01:40:16 | 0 |
| 2015-01-01_01:40:17 | 3.3 |
| 2015-01-01_01:40:18 | 5.6 |
| 2015-01-01_01:40:19 | 3.5 |
| 2015-01-01_01:40:20 | 4.8 |
| 2015-01-01_01:40:21 | 9.3 |
| 2015-01-01_01:40:22 | 19.3 |
| 2015-01-01_01:40:23 | 18.9 |
| 2015-01-01_01:40:24 | 10.3 |
| 2015-01-01_01:40:25 | 8.5 |
| 2015-01-01_01:40:26 | 5.3 |
| 2015-01-01_01:40:27 | 0.1 |
| 2015-01-01_01:40:28 | 1.5 |
| 2015-01-01_01:40:29 | 1.2 |
| 2015-01-01_01:40:30 | 0 |
| 2015-01-01_01:40:31 | 0 |
| 2015-01-01_01:40:32 | 0 |
| 2015-01-01_01:40:33 | 0 |
| 2015-01-01_01:40:34 | 0 |
| 2015-01-01_01:40:35 | 0 |
| 2015-01-01_01:40:36 | 0 |
| 2015-01-01_01:40:37 | 0 |
| 2015-01-01_01:40:38 | 0 |
| 2015-01-01_01:40:39 | 0 |
| 2015-01-01_01:40:40 | 0.5 |
| 2015-01-01_01:40:41 | 1.4 |
| 2015-01-01_01:40:42 | 1.9 |
| 2015-01-01_01:40:43 | 2 |
| 2015-01-01_01:40:44 | 2.5 |
| 2015-01-01_01:40:45 | 3.6 |
| 2015-01-01_01:40:46 | 0.8 |
| 2015-01-01_01:40:47 | 0.6 |
| 2015-01-01_01:40:48 | 0.6 |
| 2015-01-01_01:40:49 | 0.6 |
| 2015-01-01_01:40:50 | 0.6 |
| 2015-01-01_01:40:51 | 0.6 |
| 2015-01-01_01:40:52 | 0.6 |
| 2015-01-01_01:40:53 | 0.7 |
| 2015-01-01_01:40:54 | 0.7 |
| 2015-01-01_01:40:55 | 0.7 |
| 2015-01-01_01:40:56 | 0.7 |
| 2015-01-01_01:40:57 | 0.8 |
| 2015-01-01_01:40:58 | 0.7 |
| 2015-01-01_01:40:59 | 0.6 |
| 2015-01-01_01:41:00 | 0.6 |
| 2015-01-01_01:41:01 | 0.6 |
| 2015-01-01_01:41:02 | 0.6 |
| 2015-01-01_01:41:03 | 0.6 |
| 2015-01-01_01:41:04 | 0.6 |
| 2015-01-01_01:41:05 | 0.7 |
| 2015-01-01_01:41:06 | 0.6 |
| 2015-01-01_01:41:07 | 0.6 |
| 2015-01-01_01:41:08 | 0.8 |
| 2015-01-01_01:41:09 | 0.7 |
| 2015-01-01_01:41:10 | 0.6 |
| 2015-01-01_01:41:11 | 0.7 |
| 2015-01-01_01:41:12 | 0.7 |
| 2015-01-01_01:41:13 | 0.7 |
| 2015-01-01_01:41:14 | 0.6 |
| 2015-01-01_01:41:15 | 0.6 |
| 2015-01-01_01:41:16 | 0.7 |
| 2015-01-01_01:41:17 | 0.6 |
| 2015-01-01_01:41:18 | 0.7 |
| 2015-01-01_01:41:19 | 0.6 |
| 2015-01-01_01:41:20 | 0.8 |
| 2015-01-01_01:41:21 | 0.7 |
| 2015-01-01_01:41:22 | 0.7 |
| 2015-01-01_01:41:23 | 0.7 |
| 2015-01-01_01:41:24 | 0.7 |
| 2015-01-01_01:41:25 | 0.7 |
| 2015-01-01_01:41:26 | 0.7 |
| 2015-01-01_01:41:27 | 0.6 |
| 2015-01-01_01:41:28 | 0.7 |
| 2015-01-01_01:41:29 | 0.6 |
| 2015-01-01_01:41:30 | 0.7 |
| 2015-01-01_01:41:31 | 0.7 |
| 2015-01-01_01:41:32 | 0.6 |
| 2015-01-01_01:41:33 | 0.7 |
| 2015-01-01_01:41:34 | 0.6 |
| 2015-01-01_01:41:35 | 0.6 |
| 2015-01-01_01:41:36 | 0.7 |
| 2015-01-01_01:41:37 | 0.6 |
| 2015-01-01_01:41:38 | 0.7 |
| 2015-01-01_01:41:39 | 0.7 |
| 2015-01-01_01:41:40 | 0.7 |
| 2015-01-01_01:41:41 | 0.7 |
| 2015-01-01_01:41:42 | 0.7 |
| 2015-01-01_01:41:43 | 0.7 |
| 2015-01-01_01:41:44 | 0.6 |
| 2015-01-01_01:41:45 | 0.7 |
| 2015-01-01_01:41:46 | 0.6 |
| 2015-01-01_01:41:47 | 0.7 |
| 2015-01-01_01:41:48 | 0.6 |
| 2015-01-01_01:41:49 | 0.7 |
| 2015-01-01_01:41:50 | 0.6 |
| 2015-01-01_01:41:51 | 0.7 |
| 2015-01-01_01:41:52 | 0.6 |
| 2015-01-01_01:41:53 | 0.7 |
| 2015-01-01_01:41:54 | 0.8 |
| 2015-01-01_01:41:55 | 0.6 |
| 2015-01-01_01:41:56 | 0.7 |
| 2015-01-01_01:41:57 | 0.7 |
| 2015-01-01_01:41:58 | 0.7 |
| 2015-01-01_01:41:59 | 0.6 |
| 2015-01-01_01:42:00 | 0.6 |
| 2015-01-01_01:42:01 | 0.6 |
| 2015-01-01_01:42:02 | 0.7 |
| 2015-01-01_01:42:03 | 0.7 |
| 2015-01-01_01:42:04 | 0.7 |
| 2015-01-01_01:42:05 | 0.7 |
| 2015-01-01_01:42:06 | 0.8 |
| 2015-01-01_01:42:07 | 1.3 |
| 2015-01-01_01:42:08 | 41 |
| 2015-01-01_01:42:09 | 47.3 |
| 2015-01-01_01:42:10 | 11.7 |
| 2015-01-01_01:42:11 | 31.3 |
| 2015-01-01_01:42:12 | 35.3 |
| 2015-01-01_01:42:13 | 9.8 |
| 2015-01-01_01:42:14 | 28.8 |
| 2015-01-01_01:42:15 | 31.7 |
| 2015-01-01_01:42:16 | 6.1 |
| 2015-01-01_01:42:17 | 8.6 |
| 2015-01-01_01:42:18 | 19.5 |
| 2015-01-01_01:42:19 | 18.2 |
| 2015-01-01_01:42:20 | 2.7 |
| 2015-01-01_01:42:21 | 10.1 |
| 2015-01-01_01:42:22 | 6.5 |
| 2015-01-01_01:42:23 | 6.6 |
| 2015-01-01_01:42:24 | 5.7 |
| 2015-01-01_01:42:25 | 3.1 |
| 2015-01-01_01:42:26 | 0 |
| 2015-01-01_01:42:27 | 0 |
| 2015-01-01_01:42:28 | 0 |
| 2015-01-01_01:42:29 | 0 |
| 2015-01-01_01:42:30 | 0 |
| 2015-01-01_01:42:31 | 0 |
| 2015-01-01_01:42:32 | 0 |
| 2015-01-01_01:42:33 | 0 |
| 2015-01-01_01:42:34 | 0 |
| 2015-01-01_01:42:35 | 0.5 |
| 2015-01-01_01:42:36 | 1 |
| 2015-01-01_01:42:37 | 1.4 |
| 2015-01-01_01:42:38 | 1.4 |
| 2015-01-01_01:42:39 | 1.8 |
| 2015-01-01_01:42:40 | 1.9 |
| 2015-01-01_01:42:41 | 2.1 |
| 2015-01-01_01:42:42 | 3.2 |
| 2015-01-01_01:42:43 | 3.1 |
| 2015-01-01_01:42:44 | 0.7 |
| 2015-01-01_01:42:45 | 0.7 |
| 2015-01-01_01:42:46 | 0.7 |
| 2015-01-01_01:42:47 | 0.7 |
| 2015-01-01_01:42:48 | 0.8 |
| 2015-01-01_01:42:49 | 11.2 |
| 2015-01-01_01:42:50 | 19.9 |
| 2015-01-01_01:42:51 | 20.7 |
| 2015-01-01_01:42:52 | 7.5 |
| 2015-01-01_01:42:53 | 13.6 |
| 2015-01-01_01:42:54 | 12.7 |
| 2015-01-01_01:42:55 | 5 |
| 2015-01-01_01:42:56 | 1.9 |
| 2015-01-01_01:42:57 | 2.5 |
| 2015-01-01_01:42:58 | 3.8 |
| 2015-01-01_01:42:59 | 2.8 |
| 2015-01-01_01:43:00 | 2.7 |
| 2015-01-01_01:43:01 | 6.7 |
| 2015-01-01_01:43:02 | 11.8 |
| 2015-01-01_01:43:03 | 5.3 |
| 2015-01-01_01:43:04 | 5.3 |
| 2015-01-01_01:43:05 | 5.2 |
| 2015-01-01_01:43:06 | 4.3 |
| 2015-01-01_01:43:07 | 4.1 |
| 2015-01-01_01:43:08 | 3.6 |
| 2015-01-01_01:43:09 | 0 |
| 2015-01-01_01:43:10 | 0.7 |
| 2015-01-01_01:43:11 | 4 |
| 2015-01-01_01:43:12 | 4.7 |
| 2015-01-01_01:43:13 | 4.1 |
| 2015-01-01_01:43:14 | 5 |
| 2015-01-01_01:43:15 | 9.9 |
| 2015-01-01_01:43:16 | 18.9 |
| 2015-01-01_01:43:17 | 11.2 |
| 2015-01-01_01:43:18 | 5.3 |
| 2015-01-01_01:43:19 | 3.7 |
| 2015-01-01_01:43:20 | 0 |
| 2015-01-01_01:43:21 | 0 |
| 2015-01-01_01:43:22 | 1.4 |
| 2015-01-01_01:43:23 | 2.8 |
| 2015-01-01_01:43:24 | 3.4 |
| 2015-01-01_01:43:25 | 4.3 |
| 2015-01-01_01:43:26 | 4.2 |
| 2015-01-01_01:43:27 | 0.6 |
| 2015-01-01_01:43:28 | 0.7 |
| 2015-01-01_01:43:29 | 0.7 |
| 2015-01-01_01:43:30 | 0.7 |
| 2015-01-01_01:43:31 | 0.6 |
| 2015-01-01_01:43:32 | 0.6 |
| 2015-01-01_01:43:33 | 0.6 |
| 2015-01-01_01:43:34 | 0.7 |
| 2015-01-01_01:43:35 | 0.6 |
| 2015-01-01_01:43:36 | 0.6 |
| 2015-01-01_01:43:37 | 0.8 |
| 2015-01-01_01:43:38 | 0.6 |
| 2015-01-01_01:43:39 | 0.6 |
| 2015-01-01_01:43:40 | 0.7 |
| 2015-01-01_01:43:41 | 0.7 |
| 2015-01-01_01:43:42 | 0.6 |
| 2015-01-01_01:43:43 | 0.7 |
| 2015-01-01_01:43:44 | 0.6 |
| 2015-01-01_01:43:45 | 0.7 |
| 2015-01-01_01:43:46 | 0.6 |
| 2015-01-01_01:43:47 | 0.6 |
| 2015-01-01_01:43:48 | 0.8 |
| 2015-01-01_01:43:49 | 0.6 |
| 2015-01-01_01:43:50 | 0.7 |
| 2015-01-01_01:43:51 | 0.6 |
| 2015-01-01_01:43:52 | 0.6 |
| 2015-01-01_01:43:53 | 0.6 |
| 2015-01-01_01:43:54 | 0.7 |
| 2015-01-01_01:43:55 | 0.7 |
| 2015-01-01_01:43:56 | 0.7 |
| 2015-01-01_01:43:57 | 0.6 |
| 2015-01-01_01:43:58 | 0.6 |
| 2015-01-01_01:43:59 | 0.6 |
| 2015-01-01_01:44:00 | 0.7 |
| 2015-01-01_01:44:01 | 0.6 |
| 2015-01-01_01:44:02 | 0.6 |
| 2015-01-01_01:44:03 | 0.7 |
| 2015-01-01_01:44:04 | 0.7 |
| 2015-01-01_01:44:05 | 0.7 |
| 2015-01-01_01:44:06 | 0.7 |
| 2015-01-01_01:44:07 | 0.7 |
| 2015-01-01_01:44:08 | 0.7 |
| 2015-01-01_01:44:09 | 0.6 |
| 2015-01-01_01:44:10 | 0.6 |
| 2015-01-01_01:44:11 | 0.8 |
| 2015-01-01_01:44:12 | 0.6 |
| 2015-01-01_01:44:13 | 0.6 |
| 2015-01-01_01:44:14 | 0.6 |
| 2015-01-01_01:44:15 | 0.6 |
| 2015-01-01_01:44:16 | 0.7 |
| 2015-01-01_01:44:17 | 0.7 |
| 2015-01-01_01:44:18 | 0.6 |
| 2015-01-01_01:44:19 | 0.7 |
| 2015-01-01_01:44:20 | 0.6 |
| 2015-01-01_01:44:21 | 0.6 |
| 2015-01-01_01:44:22 | 0.7 |
| 2015-01-01_01:44:23 | 0.7 |
| 2015-01-01_01:44:24 | 0.6 |
| 2015-01-01_01:44:25 | 0.7 |
| 2015-01-01_01:44:26 | 0.7 |
| 2015-01-01_01:44:27 | 0.7 |
| 2015-01-01_01:44:28 | 0.6 |
| 2015-01-01_01:44:29 | 0.7 |
| 2015-01-01_01:44:30 | 0.6 |
| 2015-01-01_01:44:31 | 0.7 |
| 2015-01-01_01:44:32 | 0.6 |
| 2015-01-01_01:44:33 | 0.6 |
| 2015-01-01_01:44:34 | 0.8 |
| 2015-01-01_01:44:35 | 0.7 |
| 2015-01-01_01:44:36 | 0.6 |
| 2015-01-01_01:44:37 | 1.1 |
| 2015-01-01_01:44:38 | 16.3 |
| 2015-01-01_01:44:39 | 21 |
| 2015-01-01_01:44:40 | 7.7 |
| 2015-01-01_01:44:41 | 6.6 |
| 2015-01-01_01:44:42 | 14 |
| 2015-01-01_01:44:43 | 17 |
| 2015-01-01_01:44:44 | 12.5 |
| 2015-01-01_01:44:45 | 2.5 |
| 2015-01-01_01:44:46 | 8 |
| 2015-01-01_01:44:47 | 11.3 |
| 2015-01-01_01:44:48 | 11.2 |
| 2015-01-01_01:44:49 | 11 |
| 2015-01-01_01:44:50 | 15.3 |
| 2015-01-01_01:44:51 | 7.3 |
| 2015-01-01_01:44:52 | 5.2 |
| 2015-01-01_01:44:53 | 13.3 |
| 2015-01-01_01:44:54 | 10.2 |
| 2015-01-01_01:44:55 | 8.4 |
| 2015-01-01_01:44:56 | 2.2 |
| 2015-01-01_01:44:57 | 0 |
| 2015-01-01_01:44:58 | 3.4 |
| 2015-01-01_01:44:59 | 4.5 |
| 2015-01-01_01:45:00 | 3.1 |
| 2015-01-01_01:45:01 | 3.4 |
| 2015-01-01_01:45:02 | 4.7 |
| 2015-01-01_01:45:03 | 0 |
| 2015-01-01_01:45:04 | 0 |
| 2015-01-01_01:45:05 | 0.7 |
| 2015-01-01_01:45:06 | 2.8 |
| 2015-01-01_01:45:07 | 2.6 |
| 2015-01-01_01:45:08 | 1.8 |
| 2015-01-01_01:45:09 | 4.9 |
| 2015-01-01_01:45:10 | 4.1 |
| 2015-01-01_01:45:11 | 3.4 |
| 2015-01-01_01:45:12 | 9.2 |
| 2015-01-01_01:45:13 | 9.7 |
| 2015-01-01_01:45:14 | 8.9 |
| 2015-01-01_01:45:15 | 7.7 |
| 2015-01-01_01:45:16 | 6.8 |
| 2015-01-01_01:45:17 | 4.5 |
| 2015-01-01_01:45:18 | 5.7 |
| 2015-01-01_01:45:19 | 4.3 |
| 2015-01-01_01:45:20 | 4.1 |
| 2015-01-01_01:45:21 | 9.3 |
| 2015-01-01_01:45:22 | 19.7 |
| 2015-01-01_01:45:23 | 19 |
| 2015-01-01_01:45:24 | 3.6 |
| 2015-01-01_01:45:25 | 5.6 |
| 2015-01-01_01:45:26 | 7.3 |
| 2015-01-01_01:45:27 | 4.8 |
| 2015-01-01_01:45:28 | 3.1 |
| 2015-01-01_01:45:29 | 3.5 |
| 2015-01-01_01:45:30 | 3.4 |
| 2015-01-01_01:45:31 | 2.7 |
| 2015-01-01_01:45:32 | 2.9 |
| 2015-01-01_01:45:33 | 1.9 |
| 2015-01-01_01:45:34 | 3.8 |
| 2015-01-01_01:45:35 | 5 |
| 2015-01-01_01:45:36 | 2.5 |
| 2015-01-01_01:45:37 | 1.3 |
| 2015-01-01_01:45:38 | 3.7 |
| 2015-01-01_01:45:39 | 5.3 |
| 2015-01-01_01:45:40 | 8.5 |
| 2015-01-01_01:45:41 | 6.6 |
| 2015-01-01_01:45:42 | 0.5 |
| 2015-01-01_01:45:43 | 0 |
| 2015-01-01_01:45:44 | 3.1 |
| 2015-01-01_01:45:45 | 0.6 |
| 2015-01-01_01:45:46 | 0 |
| 2015-01-01_01:45:47 | 0 |
| 2015-01-01_01:45:48 | 0 |
| 2015-01-01_01:45:49 | 0 |
| 2015-01-01_01:45:50 | 0 |
| 2015-01-01_01:45:51 | 0 |
| 2015-01-01_01:45:52 | 0 |
| 2015-01-01_01:45:53 | 0 |
| 2015-01-01_01:45:54 | 0 |
| 2015-01-01_01:45:55 | 0.9 |
| 2015-01-01_01:45:56 | 0.5 |
| 2015-01-01_01:45:57 | 4.7 |
| 2015-01-01_01:45:58 | 4.6 |
| 2015-01-01_01:45:59 | 4.8 |
| 2015-01-01_01:46:00 | 3.5 |
| 2015-01-01_01:46:01 | 1.5 |
| 2015-01-01_01:46:02 | 0 |
| 2015-01-01_01:46:03 | 0 |
| 2015-01-01_01:46:04 | 1.4 |
| 2015-01-01_01:46:05 | 1.7 |
| 2015-01-01_01:46:06 | 1.6 |
| 2015-01-01_01:46:07 | 1.8 |
| 2015-01-01_01:46:08 | 2.8 |
| 2015-01-01_01:46:09 | 2.8 |
| 2015-01-01_01:46:10 | 2.8 |
| 2015-01-01_01:46:11 | 3.6 |
| 2015-01-01_01:46:12 | 3.8 |
| 2015-01-01_01:46:13 | 4.5 |
| 2015-01-01_01:46:14 | 4.5 |
| 2015-01-01_01:46:15 | 4.5 |
| 2015-01-01_01:46:16 | 4.5 |
| 2015-01-01_01:46:17 | 4.9 |
| 2015-01-01_01:46:18 | 4.9 |
| 2015-01-01_01:46:19 | 0.6 |
| 2015-01-01_01:46:20 | 0.6 |
| 2015-01-01_01:46:21 | 0.6 |
| 2015-01-01_01:46:22 | 0.7 |
| 2015-01-01_01:46:23 | 0.8 |
| 2015-01-01_01:46:24 | 0.6 |
| 2015-01-01_01:46:25 | 0.7 |
| 2015-01-01_01:46:26 | 0.7 |
| 2015-01-01_01:46:27 | 0.6 |
| 2015-01-01_01:46:28 | 0.7 |
| 2015-01-01_01:46:29 | 0.6 |
| 2015-01-01_01:46:30 | 0.6 |
| 2015-01-01_01:46:31 | 0.6 |
| 2015-01-01_01:46:32 | 0.7 |
| 2015-01-01_01:46:33 | 0.7 |
| 2015-01-01_01:46:34 | 0.7 |
| 2015-01-01_01:46:35 | 0.7 |
| 2015-01-01_01:46:36 | 0.6 |
| 2015-01-01_01:46:37 | 0.6 |
| 2015-01-01_01:46:38 | 0.7 |
| 2015-01-01_01:46:39 | 0.7 |
| 2015-01-01_01:46:40 | 0.6 |
| 2015-01-01_01:46:41 | 0.6 |
| 2015-01-01_01:46:42 | 0.7 |
| 2015-01-01_01:46:43 | 0.6 |
| 2015-01-01_01:46:44 | 0.6 |
| 2015-01-01_01:46:45 | 0.9 |
| 2015-01-01_01:46:46 | 37.8 |
| 2015-01-01_01:46:47 | 25.9 |
| 2015-01-01_01:46:48 | 13.3 |
| 2015-01-01_01:46:49 | 8.8 |
| 2015-01-01_01:46:50 | 16.1 |
| 2015-01-01_01:46:51 | 14.5 |
| 2015-01-01_01:46:52 | 11.8 |
| 2015-01-01_01:46:53 | 14.1 |
| 2015-01-01_01:46:54 | 11 |
| 2015-01-01_01:46:55 | 5.8 |
| 2015-01-01_01:46:56 | 15.1 |
| 2015-01-01_01:46:57 | 11.7 |
| 2015-01-01_01:46:58 | 1.5 |
| 2015-01-01_01:46:59 | 0 |
| 2015-01-01_01:47:00 | 0.1 |
| 2015-01-01_01:47:01 | 4.1 |
| 2015-01-01_01:47:02 | 6 |
| 2015-01-01_01:47:03 | 4.8 |
| 2015-01-01_01:47:04 | 5 |
| 2015-01-01_01:47:05 | 4.6 |
| 2015-01-01_01:47:06 | 4.1 |
| 2015-01-01_01:47:07 | 4 |
| 2015-01-01_01:47:08 | 3.9 |
| 2015-01-01_01:47:09 | 5.7 |
| 2015-01-01_01:47:10 | 8.3 |
| 2015-01-01_01:47:11 | 8.1 |
| 2015-01-01_01:47:12 | 8.4 |
| 2015-01-01_01:47:13 | 10.1 |
| 2015-01-01_01:47:14 | 10.3 |
| 2015-01-01_01:47:15 | 14.1 |
| 2015-01-01_01:47:16 | 13.6 |
| 2015-01-01_01:47:17 | 4.2 |
| 2015-01-01_01:47:18 | 10.7 |
| 2015-01-01_01:47:19 | 8.6 |
| 2015-01-01_01:47:20 | 6.4 |
| 2015-01-01_01:47:21 | 4.3 |
| 2015-01-01_01:47:22 | 5.2 |
| 2015-01-01_01:47:23 | 4.6 |
| 2015-01-01_01:47:24 | 4.4 |
| 2015-01-01_01:47:25 | 5.7 |
| 2015-01-01_01:47:26 | 5.4 |
| 2015-01-01_01:47:27 | 4.8 |
| 2015-01-01_01:47:28 | 3.8 |
| 2015-01-01_01:47:29 | 5.4 |
| 2015-01-01_01:47:30 | 4.6 |
| 2015-01-01_01:47:31 | 4.5 |
| 2015-01-01_01:47:32 | 3.6 |
| 2015-01-01_01:47:33 | 4 |
| 2015-01-01_01:47:34 | 1.4 |
| 2015-01-01_01:47:35 | 0 |
| 2015-01-01_01:47:36 | 0 |
| 2015-01-01_01:47:37 | 0 |
| 2015-01-01_01:47:38 | 2.3 |
| 2015-01-01_01:47:39 | 6.8 |
| 2015-01-01_01:47:40 | 5.9 |
| 2015-01-01_01:47:41 | 2.9 |
| 2015-01-01_01:47:42 | 0.6 |
| 2015-01-01_01:47:43 | 0 |
| 2015-01-01_01:47:44 | 0 |
| 2015-01-01_01:47:45 | 0 |
| 2015-01-01_01:47:46 | 0.7 |
| 2015-01-01_01:47:47 | 1.9 |
| 2015-01-01_01:47:48 | 2.3 |
| 2015-01-01_01:47:49 | 2.6 |
| 2015-01-01_01:47:50 | 3.7 |
| 2015-01-01_01:47:51 | 3.5 |
| 2015-01-01_01:47:52 | 4 |
| 2015-01-01_01:47:53 | 5 |
| 2015-01-01_01:47:54 | 0.6 |
| 2015-01-01_01:47:55 | 0.6 |
| 2015-01-01_01:47:56 | 0.6 |
| 2015-01-01_01:47:57 | 0.7 |
| 2015-01-01_01:47:58 | 0.6 |
| 2015-01-01_01:47:59 | 0.6 |
| 2015-01-01_01:48:00 | 0.6 |
| 2015-01-01_01:48:01 | 0.6 |
| 2015-01-01_01:48:02 | 0.7 |
| 2015-01-01_01:48:03 | 0.6 |
| 2015-01-01_01:48:04 | 0.7 |
| 2015-01-01_01:48:05 | 0.7 |
| 2015-01-01_01:48:06 | 0.6 |
| 2015-01-01_01:48:07 | 0.6 |
| 2015-01-01_01:48:08 | 0.6 |
| 2015-01-01_01:48:09 | 0.7 |
| 2015-01-01_01:48:10 | 0.9 |
| 2015-01-01_01:48:11 | 1 |
| 2015-01-01_01:48:12 | 0.7 |
| 2015-01-01_01:48:13 | 0.7 |
| 2015-01-01_01:48:14 | 0.8 |
| 2015-01-01_01:48:15 | 13 |
| 2015-01-01_01:48:16 | 23 |
| 2015-01-01_01:48:17 | 16.2 |
| 2015-01-01_01:48:18 | 5.1 |
| 2015-01-01_01:48:19 | 11 |
| 2015-01-01_01:48:20 | 17.2 |
| 2015-01-01_01:48:21 | 13.7 |
| 2015-01-01_01:48:22 | 11.5 |
| 2015-01-01_01:48:23 | 15.2 |
| 2015-01-01_01:48:24 | 5.7 |
| 2015-01-01_01:48:25 | 4.9 |
| 2015-01-01_01:48:26 | 9.1 |
| 2015-01-01_01:48:27 | 10.6 |
| 2015-01-01_01:48:28 | 11.8 |
| 2015-01-01_01:48:29 | 11.5 |
| 2015-01-01_01:48:30 | 8.4 |
| 2015-01-01_01:48:31 | 6.7 |
| 2015-01-01_01:48:32 | 7.6 |
| 2015-01-01_01:48:33 | 9.4 |
| 2015-01-01_01:48:34 | 13.7 |
| 2015-01-01_01:48:35 | 23.2 |
| 2015-01-01_01:48:36 | 17.6 |
| 2015-01-01_01:48:37 | 18.6 |
| 2015-01-01_01:48:38 | 7.3 |
| 2015-01-01_01:48:39 | 15.5 |
| 2015-01-01_01:48:40 | 3.5 |
| 2015-01-01_01:48:41 | 5.8 |
| 2015-01-01_01:48:42 | 5.2 |
| 2015-01-01_01:48:43 | 9 |
| 2015-01-01_01:48:44 | 14.7 |
| 2015-01-01_01:48:45 | 3.2 |
| 2015-01-01_01:48:46 | 4.6 |
| 2015-01-01_01:48:47 | 4.3 |
| 2015-01-01_01:48:48 | 2.2 |
| 2015-01-01_01:48:49 | 3.8 |
| 2015-01-01_01:48:50 | 4.4 |
| 2015-01-01_01:48:51 | 0.4 |
| 2015-01-01_01:48:52 | 0 |
| 2015-01-01_01:48:53 | 0 |
| 2015-01-01_01:48:54 | 0 |
| 2015-01-01_01:48:55 | 0 |
| 2015-01-01_01:48:56 | 0 |
| 2015-01-01_01:48:57 | 0.8 |
| 2015-01-01_01:48:58 | 1.3 |
| 2015-01-01_01:48:59 | 1.1 |
| 2015-01-01_01:49:00 | 1.2 |
| 2015-01-01_01:49:01 | 1.5 |
| 2015-01-01_01:49:02 | 1.6 |
| 2015-01-01_01:49:03 | 2.3 |
| 2015-01-01_01:49:04 | 2.4 |
| 2015-01-01_01:49:05 | 2.9 |
| 2015-01-01_01:49:06 | 3.7 |
| 2015-01-01_01:49:07 | 0.6 |
| 2015-01-01_01:49:08 | 0.6 |
| 2015-01-01_01:49:09 | 0.6 |
| 2015-01-01_01:49:10 | 0.7 |
| 2015-01-01_01:49:11 | 0.7 |
| 2015-01-01_01:49:12 | 0.7 |
| 2015-01-01_01:49:13 | 0.7 |
| 2015-01-01_01:49:14 | 0.7 |
| 2015-01-01_01:49:15 | 0.7 |
| 2015-01-01_01:49:16 | 0.8 |
| 2015-01-01_01:49:17 | 0.7 |
| 2015-01-01_01:49:18 | 0.6 |
| 2015-01-01_01:49:19 | 0.7 |
| 2015-01-01_01:49:20 | 0.6 |
| 2015-01-01_01:49:21 | 0.6 |
| 2015-01-01_01:49:22 | 0.7 |
| 2015-01-01_01:49:23 | 0.7 |
| 2015-01-01_01:49:24 | 0.7 |
| 2015-01-01_01:49:25 | 0.7 |
| 2015-01-01_01:49:26 | 0.6 |
| 2015-01-01_01:49:27 | 0.7 |
| 2015-01-01_01:49:28 | 0.6 |
| 2015-01-01_01:49:29 | 0.6 |
| 2015-01-01_01:49:30 | 0.6 |
| 2015-01-01_01:49:31 | 0.7 |
| 2015-01-01_01:49:32 | 0.6 |
| 2015-01-01_01:49:33 | 0.7 |
| 2015-01-01_01:49:34 | 0.7 |
| 2015-01-01_01:49:35 | 0.7 |
| 2015-01-01_01:49:36 | 0.7 |
| 2015-01-01_01:49:37 | 0.7 |
| 2015-01-01_01:49:38 | 0.7 |
| 2015-01-01_01:49:39 | 0.8 |
| 2015-01-01_01:49:40 | 0.7 |
| 2015-01-01_01:49:41 | 0.7 |
| 2015-01-01_01:49:42 | 0.7 |
| 2015-01-01_01:49:43 | 0.7 |
| 2015-01-01_01:49:44 | 0.6 |
| 2015-01-01_01:49:45 | 0.6 |
| 2015-01-01_01:49:46 | 0.5 |
| 2015-01-01_01:49:47 | 0.7 |
| 2015-01-01_01:49:48 | 0.7 |
| 2015-01-01_01:49:49 | 0.8 |
| 2015-01-01_01:49:50 | 1.4 |
| 2015-01-01_01:49:51 | 22.9 |
| 2015-01-01_01:49:52 | 26.8 |
| 2015-01-01_01:49:53 | 9.3 |
| 2015-01-01_01:49:54 | 14.4 |
| 2015-01-01_01:49:55 | 15.1 |
| 2015-01-01_01:49:56 | 14.8 |
| 2015-01-01_01:49:57 | 24.4 |
| 2015-01-01_01:49:58 | 17.2 |
| 2015-01-01_01:49:59 | 15 |
| 2015-01-01_01:50:00 | 29.7 |
| 2015-01-01_01:50:01 | 31 |
| 2015-01-01_01:50:02 | 20.9 |
| 2015-01-01_01:50:03 | 9.2 |
| 2015-01-01_01:50:04 | 20.8 |
| 2015-01-01_01:50:05 | 21.2 |
| 2015-01-01_01:50:06 | 19.2 |
| 2015-01-01_01:50:07 | 4 |
| 2015-01-01_01:50:08 | 6.2 |
| 2015-01-01_01:50:09 | 12.1 |
| 2015-01-01_01:50:10 | 8.9 |
| 2015-01-01_01:50:11 | 5.5 |
| 2015-01-01_01:50:12 | 4.8 |
| 2015-01-01_01:50:13 | 6.7 |
| 2015-01-01_01:50:14 | 11.5 |
| 2015-01-01_01:50:15 | 8 |
| 2015-01-01_01:50:16 | 4.9 |
| 2015-01-01_01:50:17 | 4 |
| 2015-01-01_01:50:18 | 5.1 |
| 2015-01-01_01:50:19 | 4.1 |
| 2015-01-01_01:50:20 | 5.7 |
| 2015-01-01_01:50:21 | 3.5 |
| 2015-01-01_01:50:22 | 9.5 |
| 2015-01-01_01:50:23 | 12.1 |
| 2015-01-01_01:50:24 | 0.2 |
| 2015-01-01_01:50:25 | 0 |
| 2015-01-01_01:50:26 | 2.2 |
| 2015-01-01_01:50:27 | 7.1 |
| 2015-01-01_01:50:28 | 3.8 |
| 2015-01-01_01:50:29 | 6.1 |
| 2015-01-01_01:50:30 | 4.3 |
| 2015-01-01_01:50:31 | 4.9 |
| 2015-01-01_01:50:32 | 1.4 |
| 2015-01-01_01:50:33 | 0 |
| 2015-01-01_01:50:34 | 0.4 |
| 2015-01-01_01:50:35 | 3.5 |
| 2015-01-01_01:50:36 | 1.1 |
| 2015-01-01_01:50:37 | 0 |
| 2015-01-01_01:50:38 | 0.3 |
| 2015-01-01_01:50:39 | 4 |
| 2015-01-01_01:50:40 | 6 |
| 2015-01-01_01:50:41 | 1.9 |
| 2015-01-01_01:50:42 | 0 |
| 2015-01-01_01:50:43 | 0.4 |
| 2015-01-01_01:50:44 | 3 |
| 2015-01-01_01:50:45 | 3.6 |
| 2015-01-01_01:50:46 | 0.3 |
| 2015-01-01_01:50:47 | 0 |
| 2015-01-01_01:50:48 | 0 |
| 2015-01-01_01:50:49 | 2.2 |
| 2015-01-01_01:50:50 | 2.8 |
| 2015-01-01_01:50:51 | 0.8 |
| 2015-01-01_01:50:52 | 1 |
| 2015-01-01_01:50:53 | 1.2 |
| 2015-01-01_01:50:54 | 1.1 |
| 2015-01-01_01:50:55 | 1.5 |
| 2015-01-01_01:50:56 | 1.4 |
| 2015-01-01_01:50:57 | 0.2 |
| 2015-01-01_01:50:58 | 0 |
| 2015-01-01_01:50:59 | 4.6 |
| 2015-01-01_01:51:00 | 9.1 |
| 2015-01-01_01:51:01 | 12.4 |
| 2015-01-01_01:51:02 | 11 |
| 2015-01-01_01:51:03 | 11.8 |
| 2015-01-01_01:51:04 | 9.8 |
| 2015-01-01_01:51:05 | 1 |
| 2015-01-01_01:51:06 | 1.5 |
| 2015-01-01_01:51:07 | 1.6 |
| 2015-01-01_01:51:08 | 2.3 |
| 2015-01-01_01:51:09 | 2.6 |
| 2015-01-01_01:51:10 | 3.7 |
| 2015-01-01_01:51:11 | 0.6 |
| 2015-01-01_01:51:12 | 0.7 |
| 2015-01-01_01:51:13 | 0.7 |
| 2015-01-01_01:51:14 | 0.7 |
| 2015-01-01_01:51:15 | 0.7 |
| 2015-01-01_01:51:16 | 0.8 |
| 2015-01-01_01:51:17 | 18.9 |
| 2015-01-01_01:51:18 | 31.7 |
| 2015-01-01_01:51:19 | 9.7 |
| 2015-01-01_01:51:20 | 15.8 |
| 2015-01-01_01:51:21 | 22.5 |
| 2015-01-01_01:51:22 | 12.2 |
| 2015-01-01_01:51:23 | 6.6 |
| 2015-01-01_01:51:24 | 12.1 |
| 2015-01-01_01:51:25 | 20.4 |
| 2015-01-01_01:51:26 | 17.6 |
| 2015-01-01_01:51:27 | 11.6 |
| 2015-01-01_01:51:28 | 4.8 |
| 2015-01-01_01:51:29 | 14.9 |
| 2015-01-01_01:51:30 | 9.5 |
| 2015-01-01_01:51:31 | 8.9 |
| 2015-01-01_01:51:32 | 6.2 |
| 2015-01-01_01:51:33 | 0.2 |
| 2015-01-01_01:51:34 | 0 |
| 2015-01-01_01:51:35 | 0 |
| 2015-01-01_01:51:36 | 1.6 |
| 2015-01-01_01:51:37 | 6.4 |
| 2015-01-01_01:51:38 | 9.4 |
| 2015-01-01_01:51:39 | 7.9 |
| 2015-01-01_01:51:40 | 4.9 |
| 2015-01-01_01:51:41 | 6.5 |
| 2015-01-01_01:51:42 | 6.9 |
| 2015-01-01_01:51:43 | 2.6 |
| 2015-01-01_01:51:44 | 3.3 |
| 2015-01-01_01:51:45 | 9.3 |
| 2015-01-01_01:51:46 | 16.8 |
| 2015-01-01_01:51:47 | 11.7 |
| 2015-01-01_01:51:48 | 2.3 |
| 2015-01-01_01:51:49 | 1.3 |
| 2015-01-01_01:51:50 | 0.3 |
| 2015-01-01_01:51:51 | 1 |
| 2015-01-01_01:51:52 | 1.1 |
| 2015-01-01_01:51:53 | 1.2 |
| 2015-01-01_01:51:54 | 1.2 |
| 2015-01-01_01:51:55 | 1.7 |
| 2015-01-01_01:51:56 | 1.4 |
| 2015-01-01_01:51:57 | 1.8 |
| 2015-01-01_01:51:58 | 2 |
| 2015-01-01_01:51:59 | 2.6 |
| 2015-01-01_01:52:00 | 3.5 |
| 2015-01-01_01:52:01 | 3.9 |
| 2015-01-01_01:52:02 | 0.6 |
| 2015-01-01_01:52:03 | 0.6 |
| 2015-01-01_01:52:04 | 0.7 |
| 2015-01-01_01:52:05 | 0.6 |
| 2015-01-01_01:52:06 | 0.8 |
| 2015-01-01_01:52:07 | 1 |
| 2015-01-01_01:52:08 | 0.7 |
| 2015-01-01_01:52:09 | 0.6 |
| 2015-01-01_01:52:10 | 0.6 |
| 2015-01-01_01:52:11 | 0.7 |
| 2015-01-01_01:52:12 | 0.6 |
| 2015-01-01_01:52:13 | 0.6 |
| 2015-01-01_01:52:14 | 0.6 |
| 2015-01-01_01:52:15 | 0.6 |
| 2015-01-01_01:52:16 | 0.6 |
| 2015-01-01_01:52:17 | 0.6 |
| 2015-01-01_01:52:18 | 0.6 |
| 2015-01-01_01:52:19 | 0.7 |
| 2015-01-01_01:52:20 | 0.7 |
| 2015-01-01_01:52:21 | 0.6 |
| 2015-01-01_01:52:22 | 0.6 |
| 2015-01-01_01:52:23 | 0.7 |
| 2015-01-01_01:52:24 | 0.6 |
| 2015-01-01_01:52:25 | 0.6 |
| 2015-01-01_01:52:26 | 0.7 |
| 2015-01-01_01:52:27 | 0.7 |
| 2015-01-01_01:52:28 | 0.6 |
| 2015-01-01_01:52:29 | 0.6 |
| 2015-01-01_01:52:30 | 0.6 |
| 2015-01-01_01:52:31 | 0.8 |
| 2015-01-01_01:52:32 | 1.1 |
| 2015-01-01_01:52:33 | 2.2 |
| 2015-01-01_01:52:34 | 33.7 |
| 2015-01-01_01:52:35 | 35.3 |
| 2015-01-01_01:52:36 | 10.6 |
| 2015-01-01_01:52:37 | 14.3 |
| 2015-01-01_01:52:38 | 19 |
| 2015-01-01_01:52:39 | 22.3 |
| 2015-01-01_01:52:40 | 2.8 |
| 2015-01-01_01:52:41 | 8 |
| 2015-01-01_01:52:42 | 8.8 |
| 2015-01-01_01:52:43 | 7.5 |
| 2015-01-01_01:52:44 | 7.6 |
| 2015-01-01_01:52:45 | 8.2 |
| 2015-01-01_01:52:46 | 9.2 |
| 2015-01-01_01:52:47 | 0.9 |
| 2015-01-01_01:52:48 | 6.5 |
| 2015-01-01_01:52:49 | 5.8 |
| 2015-01-01_01:52:50 | 9.3 |
| 2015-01-01_01:52:51 | 2.6 |
| 2015-01-01_01:52:52 | 1.7 |
| 2015-01-01_01:52:53 | 1.5 |
| 2015-01-01_01:52:54 | 1.7 |
| 2015-01-01_01:52:55 | 2.2 |
| 2015-01-01_01:52:56 | 1.9 |
| 2015-01-01_01:52:57 | 2.1 |
| 2015-01-01_01:52:58 | 3 |
| 2015-01-01_01:52:59 | 3.3 |
| 2015-01-01_01:53:00 | 0.6 |
| 2015-01-01_01:53:01 | 7.1 |
| 2015-01-01_01:53:02 | 14.3 |
| 2015-01-01_01:53:03 | 9.3 |
| 2015-01-01_01:53:04 | 7.3 |
| 2015-01-01_01:53:05 | 4.3 |
| 2015-01-01_01:53:06 | 7.2 |
| 2015-01-01_01:53:07 | 15.2 |
| 2015-01-01_01:53:08 | 15 |
| 2015-01-01_01:53:09 | 3.6 |
| 2015-01-01_01:53:10 | 12.5 |
| 2015-01-01_01:53:11 | 20 |
| 2015-01-01_01:53:12 | 16.5 |
| 2015-01-01_01:53:13 | 5.4 |
| 2015-01-01_01:53:14 | 12.7 |
| 2015-01-01_01:53:15 | 12.5 |
| 2015-01-01_01:53:16 | 14.2 |
| 2015-01-01_01:53:17 | 9.7 |
| 2015-01-01_01:53:18 | 17.5 |
| 2015-01-01_01:53:19 | 10.1 |
| 2015-01-01_01:53:20 | 0.4 |
| 2015-01-01_01:53:21 | 1.4 |
| 2015-01-01_01:53:22 | 1.2 |
| 2015-01-01_01:53:23 | 1.3 |
| 2015-01-01_01:53:24 | 1.4 |
| 2015-01-01_01:53:25 | 1.7 |
| 2015-01-01_01:53:26 | 2 |
| 2015-01-01_01:53:27 | 2.3 |
| 2015-01-01_01:53:28 | 3.3 |
| 2015-01-01_01:53:29 | 4.6 |
| 2015-01-01_01:53:30 | 7 |
| 2015-01-01_01:53:31 | 11.2 |
| 2015-01-01_01:53:32 | 5.3 |
| 2015-01-01_01:53:33 | 5 |
| 2015-01-01_01:53:34 | 0.6 |
| 2015-01-01_01:53:35 | 0.6 |
| 2015-01-01_01:53:36 | 0.7 |
| 2015-01-01_01:53:37 | 0.7 |
| 2015-01-01_01:53:38 | 0.7 |
| 2015-01-01_01:53:39 | 0.6 |
| 2015-01-01_01:53:40 | 1 |
| 2015-01-01_01:53:41 | 0.8 |
| 2015-01-01_01:53:42 | 0.7 |
| 2015-01-01_01:53:43 | 0.6 |
| 2015-01-01_01:53:44 | 0.7 |
| 2015-01-01_01:53:45 | 0.7 |
| 2015-01-01_01:53:46 | 0.7 |
| 2015-01-01_01:53:47 | 1 |
| 2015-01-01_01:53:48 | 0.7 |
| 2015-01-01_01:53:49 | 0.7 |
| 2015-01-01_01:53:50 | 0.8 |
| 2015-01-01_01:53:51 | 0.8 |
| 2015-01-01_01:53:52 | 0.6 |
| 2015-01-01_01:53:53 | 0.9 |
| 2015-01-01_01:53:54 | 0.7 |
| 2015-01-01_01:53:55 | 0.6 |
| 2015-01-01_01:53:56 | 0.8 |
| 2015-01-01_01:53:57 | 0.7 |
| 2015-01-01_01:53:58 | 0.7 |
| 2015-01-01_01:53:59 | 0.6 |
| 2015-01-01_01:54:00 | 0.6 |
| 2015-01-01_01:54:01 | 0.6 |
| 2015-01-01_01:54:02 | 0.6 |
| 2015-01-01_01:54:03 | 0.6 |
| 2015-01-01_01:54:04 | 0.6 |
| 2015-01-01_01:54:05 | 0.7 |
| 2015-01-01_01:54:06 | 0.7 |
| 2015-01-01_01:54:07 | 0.6 |
| 2015-01-01_01:54:08 | 0.7 |
| 2015-01-01_01:54:09 | 0.6 |
| 2015-01-01_01:54:10 | 0.7 |
| 2015-01-01_01:54:11 | 0.6 |
| 2015-01-01_01:54:12 | 0.7 |
| 2015-01-01_01:54:13 | 0.7 |
| 2015-01-01_01:54:14 | 0.6 |
| 2015-01-01_01:54:15 | 0.6 |
| 2015-01-01_01:54:16 | 0.6 |
| 2015-01-01_01:54:17 | 0.6 |
| 2015-01-01_01:54:18 | 0.6 |
| 2015-01-01_01:54:19 | 0.7 |
| 2015-01-01_01:54:20 | 0.7 |
| 2015-01-01_01:54:21 | 0.6 |
| 2015-01-01_01:54:22 | 0.6 |
| 2015-01-01_01:54:23 | 0.6 |
| 2015-01-01_01:54:24 | 0.6 |
| 2015-01-01_01:54:25 | 0.7 |
| 2015-01-01_01:54:26 | 0.7 |
| 2015-01-01_01:54:27 | 0.7 |
| 2015-01-01_01:54:28 | 0.6 |
| 2015-01-01_01:54:29 | 0.6 |
| 2015-01-01_01:54:30 | 0.6 |
| 2015-01-01_01:54:31 | 0.8 |
| 2015-01-01_01:54:32 | 0.7 |
| 2015-01-01_01:54:33 | 0.6 |
| 2015-01-01_01:54:34 | 0.6 |
| 2015-01-01_01:54:35 | 0.6 |
| 2015-01-01_01:54:36 | 0.6 |
| 2015-01-01_01:54:37 | 0.7 |